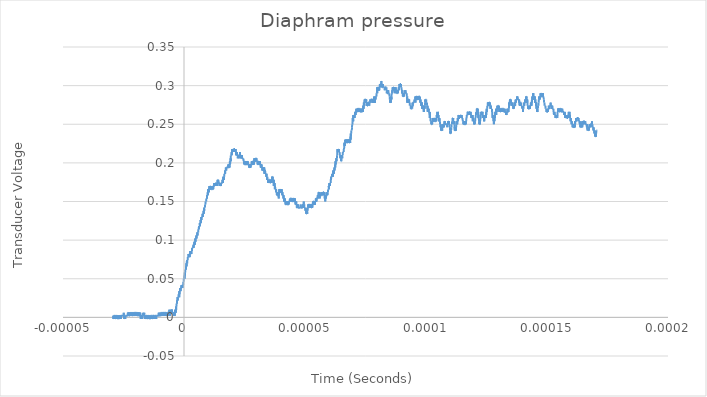
| Category | Series 0 |
|---|---|
| -2.92e-05 | 0.002 |
| -2.9168e-05 | -0.002 |
| -2.9136e-05 | -0.002 |
| -2.9104e-05 | 0.002 |
| -2.9072e-05 | 0.002 |
| -2.904e-05 | 0.002 |
| -2.9008e-05 | -0.002 |
| -2.8976e-05 | 0.002 |
| -2.8944e-05 | 0.002 |
| -2.8912e-05 | 0.002 |
| -2.888e-05 | 0.002 |
| -2.8848e-05 | 0.002 |
| -2.8816e-05 | 0.002 |
| -2.8784e-05 | -0.002 |
| -2.8752e-05 | 0.002 |
| -2.872e-05 | 0.002 |
| -2.8688e-05 | -0.002 |
| -2.8656e-05 | 0.002 |
| -2.8624e-05 | 0.002 |
| -2.8592e-05 | 0.002 |
| -2.856e-05 | 0.002 |
| -2.8528e-05 | -0.002 |
| -2.8496e-05 | 0.002 |
| -2.8464e-05 | -0.002 |
| -2.8432e-05 | 0.002 |
| -2.84e-05 | 0.002 |
| -2.8368e-05 | 0.002 |
| -2.8336e-05 | 0.002 |
| -2.8304e-05 | 0.002 |
| -2.8272e-05 | -0.002 |
| -2.824e-05 | -0.002 |
| -2.8208e-05 | -0.002 |
| -2.8176e-05 | 0.002 |
| -2.8144e-05 | 0.002 |
| -2.8112e-05 | 0.002 |
| -2.808e-05 | 0.002 |
| -2.8048e-05 | 0.002 |
| -2.8016e-05 | 0.002 |
| -2.7984e-05 | 0.002 |
| -2.7952e-05 | -0.002 |
| -2.792e-05 | 0.002 |
| -2.7888e-05 | 0.002 |
| -2.7856e-05 | -0.002 |
| -2.7824e-05 | 0.002 |
| -2.7792e-05 | -0.002 |
| -2.776e-05 | 0.002 |
| -2.7728e-05 | 0.002 |
| -2.7696e-05 | 0.002 |
| -2.7664e-05 | -0.002 |
| -2.7632e-05 | -0.002 |
| -2.76e-05 | -0.002 |
| -2.7568e-05 | 0.002 |
| -2.7536e-05 | -0.002 |
| -2.7504e-05 | -0.002 |
| -2.7472e-05 | -0.002 |
| -2.744e-05 | 0.002 |
| -2.7408e-05 | -0.002 |
| -2.7376e-05 | 0.002 |
| -2.7344e-05 | 0.002 |
| -2.7312e-05 | 0.002 |
| -2.728e-05 | -0.002 |
| -2.7248e-05 | 0.002 |
| -2.7216e-05 | -0.002 |
| -2.7184e-05 | -0.002 |
| -2.7152e-05 | -0.002 |
| -2.712e-05 | -0.002 |
| -2.7088e-05 | -0.002 |
| -2.7056e-05 | -0.002 |
| -2.7024e-05 | 0.002 |
| -2.6992e-05 | -0.002 |
| -2.696e-05 | 0.002 |
| -2.6928e-05 | -0.002 |
| -2.6896e-05 | 0.002 |
| -2.6864e-05 | -0.002 |
| -2.6832e-05 | 0.002 |
| -2.68e-05 | 0.002 |
| -2.6768e-05 | 0.002 |
| -2.6736e-05 | 0.002 |
| -2.6704e-05 | -0.002 |
| -2.6672e-05 | -0.002 |
| -2.664e-05 | 0.002 |
| -2.6608e-05 | -0.002 |
| -2.6576e-05 | 0.002 |
| -2.6544e-05 | -0.002 |
| -2.6512e-05 | -0.002 |
| -2.648e-05 | 0.002 |
| -2.6448e-05 | -0.002 |
| -2.6416e-05 | 0.002 |
| -2.6384e-05 | 0.002 |
| -2.6352e-05 | -0.002 |
| -2.632e-05 | 0.002 |
| -2.6288e-05 | 0.002 |
| -2.6256e-05 | -0.002 |
| -2.6224e-05 | 0.002 |
| -2.6192e-05 | -0.002 |
| -2.616e-05 | 0.002 |
| -2.6128e-05 | -0.002 |
| -2.6096e-05 | 0.002 |
| -2.6064e-05 | 0.002 |
| -2.6032e-05 | 0.002 |
| -2.6e-05 | 0.002 |
| -2.5968e-05 | 0.002 |
| -2.5936e-05 | 0.002 |
| -2.5904e-05 | 0.002 |
| -2.5872e-05 | 0.002 |
| -2.584e-05 | 0.002 |
| -2.5808e-05 | 0.002 |
| -2.5776e-05 | 0.002 |
| -2.5744e-05 | 0.002 |
| -2.5712e-05 | 0.002 |
| -2.568e-05 | 0.002 |
| -2.5648e-05 | 0.002 |
| -2.5616e-05 | 0.002 |
| -2.5584e-05 | 0.002 |
| -2.5552e-05 | 0.002 |
| -2.552e-05 | 0.002 |
| -2.5488e-05 | 0.002 |
| -2.5456e-05 | 0.002 |
| -2.5424e-05 | 0.002 |
| -2.5392e-05 | 0.002 |
| -2.536e-05 | 0.002 |
| -2.5328e-05 | 0.002 |
| -2.5296e-05 | 0.002 |
| -2.5264e-05 | 0.002 |
| -2.5232e-05 | 0.002 |
| -2.52e-05 | 0.002 |
| -2.5168e-05 | 0.002 |
| -2.5136e-05 | 0.002 |
| -2.5104e-05 | 0.002 |
| -2.5072e-05 | 0.002 |
| -2.504e-05 | 0.002 |
| -2.5008e-05 | 0.002 |
| -2.4976e-05 | 0.002 |
| -2.4944e-05 | 0.002 |
| -2.4912e-05 | 0.002 |
| -2.488e-05 | 0.006 |
| -2.4848e-05 | 0.002 |
| -2.4816e-05 | 0.002 |
| -2.4784e-05 | 0.002 |
| -2.4752e-05 | 0.002 |
| -2.472e-05 | 0.002 |
| -2.4688e-05 | -0.002 |
| -2.4656e-05 | 0.002 |
| -2.4624e-05 | 0.002 |
| -2.4592e-05 | 0.002 |
| -2.456e-05 | 0.002 |
| -2.4528e-05 | 0.002 |
| -2.4496e-05 | -0.002 |
| -2.4464e-05 | -0.002 |
| -2.4432e-05 | 0.002 |
| -2.44e-05 | 0.002 |
| -2.4368e-05 | 0.002 |
| -2.4336e-05 | 0.002 |
| -2.4304e-05 | 0.002 |
| -2.4272e-05 | -0.002 |
| -2.424e-05 | 0.002 |
| -2.4208e-05 | 0.002 |
| -2.4176e-05 | 0.002 |
| -2.4144e-05 | 0.002 |
| -2.4112e-05 | 0.002 |
| -2.408e-05 | 0.002 |
| -2.4048e-05 | 0.002 |
| -2.4016e-05 | 0.002 |
| -2.3984e-05 | 0.002 |
| -2.3952e-05 | 0.002 |
| -2.392e-05 | 0.002 |
| -2.3888e-05 | 0.002 |
| -2.3856e-05 | 0.002 |
| -2.3824e-05 | 0.002 |
| -2.3792e-05 | 0.002 |
| -2.376e-05 | 0.002 |
| -2.3728e-05 | 0.002 |
| -2.3696e-05 | 0.002 |
| -2.3664e-05 | 0.002 |
| -2.3632e-05 | 0.002 |
| -2.36e-05 | 0.002 |
| -2.3568e-05 | 0.002 |
| -2.3536e-05 | 0.002 |
| -2.3504e-05 | 0.002 |
| -2.3472e-05 | 0.002 |
| -2.344e-05 | 0.002 |
| -2.3408e-05 | 0.002 |
| -2.3376e-05 | 0.002 |
| -2.3344e-05 | 0.002 |
| -2.3312e-05 | 0.002 |
| -2.328e-05 | 0.002 |
| -2.3248e-05 | 0.002 |
| -2.3216e-05 | 0.006 |
| -2.3184e-05 | 0.006 |
| -2.3152e-05 | 0.006 |
| -2.312e-05 | 0.002 |
| -2.3088e-05 | 0.002 |
| -2.3056e-05 | 0.002 |
| -2.3024e-05 | 0.006 |
| -2.2992e-05 | 0.002 |
| -2.296e-05 | 0.002 |
| -2.2928e-05 | 0.006 |
| -2.2896e-05 | 0.002 |
| -2.2864e-05 | 0.006 |
| -2.2832e-05 | 0.002 |
| -2.28e-05 | 0.002 |
| -2.2768e-05 | 0.006 |
| -2.2736e-05 | 0.006 |
| -2.2704e-05 | 0.002 |
| -2.2672e-05 | 0.002 |
| -2.264e-05 | 0.006 |
| -2.2608e-05 | 0.002 |
| -2.2576e-05 | 0.002 |
| -2.2544e-05 | 0.002 |
| -2.2512e-05 | 0.002 |
| -2.248e-05 | 0.002 |
| -2.2448e-05 | 0.002 |
| -2.2416e-05 | 0.002 |
| -2.2384e-05 | 0.006 |
| -2.2352e-05 | 0.002 |
| -2.232e-05 | 0.002 |
| -2.2288e-05 | 0.006 |
| -2.2256e-05 | 0.002 |
| -2.2224e-05 | 0.002 |
| -2.2192e-05 | 0.002 |
| -2.216e-05 | 0.002 |
| -2.2128e-05 | 0.006 |
| -2.2096e-05 | 0.006 |
| -2.2064e-05 | 0.002 |
| -2.2032e-05 | 0.006 |
| -2.2e-05 | 0.002 |
| -2.1968e-05 | 0.006 |
| -2.1936e-05 | 0.006 |
| -2.1904e-05 | 0.006 |
| -2.1872e-05 | 0.006 |
| -2.184e-05 | 0.002 |
| -2.1808e-05 | 0.006 |
| -2.1776e-05 | 0.002 |
| -2.1744e-05 | 0.006 |
| -2.1712e-05 | 0.002 |
| -2.168e-05 | 0.002 |
| -2.1648e-05 | 0.006 |
| -2.1616e-05 | 0.006 |
| -2.1584e-05 | 0.002 |
| -2.1552e-05 | 0.006 |
| -2.152e-05 | 0.006 |
| -2.1488e-05 | 0.006 |
| -2.1456e-05 | 0.006 |
| -2.1424e-05 | 0.002 |
| -2.1392e-05 | 0.002 |
| -2.136e-05 | 0.002 |
| -2.1328e-05 | 0.006 |
| -2.1296e-05 | 0.006 |
| -2.1264e-05 | 0.002 |
| -2.1232e-05 | 0.002 |
| -2.12e-05 | 0.002 |
| -2.1168e-05 | 0.006 |
| -2.1136e-05 | 0.006 |
| -2.1104e-05 | 0.002 |
| -2.1072e-05 | 0.002 |
| -2.104e-05 | 0.006 |
| -2.1008e-05 | 0.002 |
| -2.0976e-05 | 0.006 |
| -2.0944e-05 | 0.002 |
| -2.0912e-05 | 0.006 |
| -2.088e-05 | 0.006 |
| -2.0848e-05 | 0.006 |
| -2.0816e-05 | 0.002 |
| -2.0784e-05 | 0.002 |
| -2.0752e-05 | 0.002 |
| -2.072e-05 | 0.002 |
| -2.0688e-05 | 0.006 |
| -2.0656e-05 | 0.002 |
| -2.0624e-05 | 0.002 |
| -2.0592e-05 | 0.006 |
| -2.056e-05 | 0.006 |
| -2.0528e-05 | 0.006 |
| -2.0496e-05 | 0.002 |
| -2.0464e-05 | 0.006 |
| -2.0432e-05 | 0.002 |
| -2.04e-05 | 0.006 |
| -2.0368e-05 | 0.006 |
| -2.0336e-05 | 0.006 |
| -2.0304e-05 | 0.006 |
| -2.0272e-05 | 0.006 |
| -2.024e-05 | 0.002 |
| -2.0208e-05 | 0.006 |
| -2.0176e-05 | 0.002 |
| -2.0144e-05 | 0.006 |
| -2.0112e-05 | 0.006 |
| -2.008e-05 | 0.006 |
| -2.0048e-05 | 0.006 |
| -2.0016e-05 | 0.002 |
| -1.9984e-05 | 0.006 |
| -1.9952e-05 | 0.006 |
| -1.992e-05 | 0.006 |
| -1.9888e-05 | 0.006 |
| -1.9856e-05 | 0.006 |
| -1.9824e-05 | 0.006 |
| -1.9792e-05 | 0.002 |
| -1.976e-05 | 0.006 |
| -1.9728e-05 | 0.006 |
| -1.9696e-05 | 0.006 |
| -1.9664e-05 | 0.002 |
| -1.9632e-05 | 0.006 |
| -1.96e-05 | 0.006 |
| -1.9568e-05 | 0.002 |
| -1.9536e-05 | 0.006 |
| -1.9504e-05 | 0.006 |
| -1.9472e-05 | 0.006 |
| -1.944e-05 | 0.002 |
| -1.9408e-05 | 0.002 |
| -1.9376e-05 | 0.002 |
| -1.9344e-05 | 0.002 |
| -1.9312e-05 | 0.006 |
| -1.928e-05 | 0.002 |
| -1.9248e-05 | 0.006 |
| -1.9216e-05 | 0.006 |
| -1.9184e-05 | 0.006 |
| -1.9152e-05 | 0.002 |
| -1.912e-05 | 0.002 |
| -1.9088e-05 | 0.002 |
| -1.9056e-05 | 0.006 |
| -1.9024e-05 | 0.002 |
| -1.8992e-05 | 0.002 |
| -1.896e-05 | 0.002 |
| -1.8928e-05 | 0.006 |
| -1.8896e-05 | 0.002 |
| -1.8864e-05 | 0.006 |
| -1.8832e-05 | 0.002 |
| -1.88e-05 | 0.002 |
| -1.8768e-05 | 0.002 |
| -1.8736e-05 | 0.002 |
| -1.8704e-05 | 0.002 |
| -1.8672e-05 | 0.006 |
| -1.864e-05 | 0.002 |
| -1.8608e-05 | 0.002 |
| -1.8576e-05 | 0.002 |
| -1.8544e-05 | 0.002 |
| -1.8512e-05 | 0.006 |
| -1.848e-05 | 0.002 |
| -1.8448e-05 | 0.002 |
| -1.8416e-05 | 0.002 |
| -1.8384e-05 | 0.002 |
| -1.8352e-05 | 0.006 |
| -1.832e-05 | 0.002 |
| -1.8288e-05 | 0.002 |
| -1.8256e-05 | 0.006 |
| -1.8224e-05 | 0.002 |
| -1.8192e-05 | 0.002 |
| -1.816e-05 | 0.002 |
| -1.8128e-05 | 0.002 |
| -1.8096e-05 | 0.002 |
| -1.8064e-05 | 0.006 |
| -1.8032e-05 | 0.002 |
| -1.8e-05 | 0.002 |
| -1.7968e-05 | 0.002 |
| -1.7936e-05 | 0.002 |
| -1.7904e-05 | -0.002 |
| -1.7872e-05 | 0.002 |
| -1.784e-05 | 0.002 |
| -1.7808e-05 | 0.002 |
| -1.7776e-05 | 0.002 |
| -1.7744e-05 | 0.002 |
| -1.7712e-05 | 0.002 |
| -1.768e-05 | 0.002 |
| -1.7648e-05 | 0.002 |
| -1.7616e-05 | 0.002 |
| -1.7584e-05 | 0.002 |
| -1.7552e-05 | 0.002 |
| -1.752e-05 | 0.002 |
| -1.7488e-05 | 0.002 |
| -1.7456e-05 | 0.002 |
| -1.7424e-05 | 0.002 |
| -1.7392e-05 | 0.002 |
| -1.736e-05 | 0.002 |
| -1.7328e-05 | 0.002 |
| -1.7296e-05 | 0.002 |
| -1.7264e-05 | -0.002 |
| -1.7232e-05 | 0.002 |
| -1.72e-05 | 0.002 |
| -1.7168e-05 | 0.002 |
| -1.7136e-05 | 0.002 |
| -1.7104e-05 | 0.002 |
| -1.7072e-05 | 0.002 |
| -1.704e-05 | 0.002 |
| -1.7008e-05 | 0.002 |
| -1.6976e-05 | 0.002 |
| -1.6944e-05 | 0.002 |
| -1.6912e-05 | 0.002 |
| -1.688e-05 | 0.006 |
| -1.6848e-05 | 0.002 |
| -1.6816e-05 | 0.002 |
| -1.6784e-05 | 0.002 |
| -1.6752e-05 | 0.002 |
| -1.672e-05 | 0.002 |
| -1.6688e-05 | 0.002 |
| -1.6656e-05 | 0.002 |
| -1.6624e-05 | 0.002 |
| -1.6592e-05 | 0.002 |
| -1.656e-05 | 0.002 |
| -1.6528e-05 | 0.002 |
| -1.6496e-05 | 0.002 |
| -1.6464e-05 | 0.006 |
| -1.6432e-05 | 0.002 |
| -1.64e-05 | 0.002 |
| -1.6368e-05 | 0.002 |
| -1.6336e-05 | 0.002 |
| -1.6304e-05 | 0.002 |
| -1.6272e-05 | 0.002 |
| -1.624e-05 | 0.002 |
| -1.6208e-05 | 0.002 |
| -1.6176e-05 | 0.002 |
| -1.6144e-05 | -0.002 |
| -1.6112e-05 | 0.002 |
| -1.608e-05 | 0.002 |
| -1.6048e-05 | 0.002 |
| -1.6016e-05 | 0.002 |
| -1.5984e-05 | -0.002 |
| -1.5952e-05 | -0.002 |
| -1.592e-05 | 0.002 |
| -1.5888e-05 | 0.002 |
| -1.5856e-05 | -0.002 |
| -1.5824e-05 | 0.002 |
| -1.5792e-05 | 0.002 |
| -1.576e-05 | 0.002 |
| -1.5728e-05 | -0.002 |
| -1.5696e-05 | 0.002 |
| -1.5664e-05 | 0.002 |
| -1.5632e-05 | 0.002 |
| -1.56e-05 | 0.002 |
| -1.5568e-05 | -0.002 |
| -1.5536e-05 | 0.002 |
| -1.5504e-05 | 0.002 |
| -1.5472e-05 | 0.002 |
| -1.544e-05 | 0.002 |
| -1.5408e-05 | 0.002 |
| -1.5376e-05 | 0.002 |
| -1.5344e-05 | -0.002 |
| -1.5312e-05 | -0.002 |
| -1.528e-05 | 0.002 |
| -1.5248e-05 | 0.002 |
| -1.5216e-05 | -0.002 |
| -1.5184e-05 | 0.002 |
| -1.5152e-05 | -0.002 |
| -1.512e-05 | -0.002 |
| -1.5088e-05 | 0.002 |
| -1.5056e-05 | 0.002 |
| -1.5024e-05 | -0.002 |
| -1.4992e-05 | -0.002 |
| -1.496e-05 | -0.002 |
| -1.4928e-05 | 0.002 |
| -1.4896e-05 | 0.002 |
| -1.4864e-05 | -0.002 |
| -1.4832e-05 | 0.002 |
| -1.48e-05 | -0.002 |
| -1.4768e-05 | 0.002 |
| -1.4736e-05 | 0.002 |
| -1.4704e-05 | -0.002 |
| -1.4672e-05 | -0.002 |
| -1.464e-05 | 0.002 |
| -1.4608e-05 | 0.002 |
| -1.4576e-05 | -0.002 |
| -1.4544e-05 | 0.002 |
| -1.4512e-05 | 0.002 |
| -1.448e-05 | 0.002 |
| -1.4448e-05 | -0.002 |
| -1.4416e-05 | -0.002 |
| -1.4384e-05 | -0.002 |
| -1.4352e-05 | 0.002 |
| -1.432e-05 | -0.002 |
| -1.4288e-05 | -0.002 |
| -1.4256e-05 | -0.002 |
| -1.4224e-05 | 0.002 |
| -1.4192e-05 | -0.002 |
| -1.416e-05 | 0.002 |
| -1.4128e-05 | 0.002 |
| -1.4096e-05 | -0.002 |
| -1.4064e-05 | -0.002 |
| -1.4032e-05 | 0.002 |
| -1.4e-05 | -0.002 |
| -1.3968e-05 | -0.002 |
| -1.3936e-05 | -0.002 |
| -1.3904e-05 | -0.002 |
| -1.3872e-05 | -0.002 |
| -1.384e-05 | -0.002 |
| -1.3808e-05 | 0.002 |
| -1.3776e-05 | -0.002 |
| -1.3744e-05 | 0.002 |
| -1.3712e-05 | 0.002 |
| -1.368e-05 | 0.002 |
| -1.3648e-05 | 0.002 |
| -1.3616e-05 | 0.002 |
| -1.3584e-05 | 0.002 |
| -1.3552e-05 | 0.002 |
| -1.352e-05 | -0.002 |
| -1.3488e-05 | 0.002 |
| -1.3456e-05 | 0.002 |
| -1.3424e-05 | 0.002 |
| -1.3392e-05 | 0.002 |
| -1.336e-05 | 0.002 |
| -1.3328e-05 | 0.002 |
| -1.3296e-05 | 0.002 |
| -1.3264e-05 | 0.002 |
| -1.3232e-05 | 0.002 |
| -1.32e-05 | 0.002 |
| -1.3168e-05 | 0.002 |
| -1.3136e-05 | -0.002 |
| -1.3104e-05 | 0.002 |
| -1.3072e-05 | -0.002 |
| -1.304e-05 | -0.002 |
| -1.3008e-05 | 0.002 |
| -1.2976e-05 | 0.002 |
| -1.2944e-05 | 0.002 |
| -1.2912e-05 | 0.002 |
| -1.288e-05 | -0.002 |
| -1.2848e-05 | -0.002 |
| -1.2816e-05 | 0.002 |
| -1.2784e-05 | 0.002 |
| -1.2752e-05 | 0.002 |
| -1.272e-05 | 0.002 |
| -1.2688e-05 | 0.002 |
| -1.2656e-05 | 0.002 |
| -1.2624e-05 | 0.002 |
| -1.2592e-05 | 0.002 |
| -1.256e-05 | 0.002 |
| -1.2528e-05 | 0.002 |
| -1.2496e-05 | 0.002 |
| -1.2464e-05 | 0.002 |
| -1.2432e-05 | 0.002 |
| -1.24e-05 | 0.002 |
| -1.2368e-05 | 0.002 |
| -1.2336e-05 | 0.002 |
| -1.2304e-05 | 0.002 |
| -1.2272e-05 | -0.002 |
| -1.224e-05 | 0.002 |
| -1.2208e-05 | -0.002 |
| -1.2176e-05 | 0.002 |
| -1.2144e-05 | 0.002 |
| -1.2112e-05 | 0.002 |
| -1.208e-05 | -0.002 |
| -1.2048e-05 | 0.002 |
| -1.2016e-05 | 0.002 |
| -1.1984e-05 | -0.002 |
| -1.1952e-05 | 0.002 |
| -1.192e-05 | 0.002 |
| -1.1888e-05 | 0.002 |
| -1.1856e-05 | 0.002 |
| -1.1824e-05 | 0.002 |
| -1.1792e-05 | 0.002 |
| -1.176e-05 | 0.002 |
| -1.1728e-05 | 0.002 |
| -1.1696e-05 | 0.002 |
| -1.1664e-05 | 0.002 |
| -1.1632e-05 | 0.002 |
| -1.16e-05 | 0.002 |
| -1.1568e-05 | -0.002 |
| -1.1536e-05 | 0.002 |
| -1.1504e-05 | -0.002 |
| -1.1472e-05 | 0.002 |
| -1.144e-05 | 0.002 |
| -1.1408e-05 | 0.002 |
| -1.1376e-05 | 0.002 |
| -1.1344e-05 | 0.002 |
| -1.1312e-05 | 0.002 |
| -1.128e-05 | 0.002 |
| -1.1248e-05 | 0.002 |
| -1.1216e-05 | 0.002 |
| -1.1184e-05 | 0.002 |
| -1.1152e-05 | 0.002 |
| -1.112e-05 | 0.002 |
| -1.1088e-05 | 0.002 |
| -1.1056e-05 | 0.002 |
| -1.1024e-05 | 0.002 |
| -1.0992e-05 | 0.002 |
| -1.096e-05 | 0.002 |
| -1.0928e-05 | 0.002 |
| -1.0896e-05 | 0.002 |
| -1.0864e-05 | 0.002 |
| -1.0832e-05 | 0.002 |
| -1.08e-05 | 0.002 |
| -1.0768e-05 | 0.002 |
| -1.0736e-05 | 0.002 |
| -1.0704e-05 | 0.002 |
| -1.0672e-05 | 0.002 |
| -1.064e-05 | 0.002 |
| -1.0608e-05 | 0.002 |
| -1.0576e-05 | 0.002 |
| -1.0544e-05 | 0.002 |
| -1.0512e-05 | 0.002 |
| -1.048e-05 | 0.002 |
| -1.0448e-05 | 0.006 |
| -1.0416e-05 | 0.002 |
| -1.0384e-05 | 0.002 |
| -1.0352e-05 | 0.002 |
| -1.032e-05 | 0.002 |
| -1.0288e-05 | 0.002 |
| -1.0256e-05 | 0.002 |
| -1.0224e-05 | 0.006 |
| -1.0192e-05 | 0.002 |
| -1.016e-05 | 0.002 |
| -1.0128e-05 | 0.002 |
| -1.0096e-05 | 0.002 |
| -1.0064e-05 | 0.002 |
| -1.0032e-05 | 0.002 |
| -1e-05 | 0.002 |
| -9.968e-06 | 0.002 |
| -9.936e-06 | 0.002 |
| -9.904e-06 | 0.002 |
| -9.872e-06 | 0.002 |
| -9.84e-06 | 0.002 |
| -9.808e-06 | 0.002 |
| -9.776e-06 | 0.002 |
| -9.744e-06 | 0.002 |
| -9.712e-06 | 0.006 |
| -9.68e-06 | 0.006 |
| -9.648e-06 | 0.002 |
| -9.616e-06 | 0.002 |
| -9.584e-06 | 0.006 |
| -9.552e-06 | 0.006 |
| -9.52e-06 | 0.006 |
| -9.488e-06 | 0.006 |
| -9.456e-06 | 0.006 |
| -9.424e-06 | 0.002 |
| -9.392e-06 | 0.006 |
| -9.36e-06 | 0.006 |
| -9.328e-06 | 0.002 |
| -9.296e-06 | 0.002 |
| -9.264e-06 | 0.002 |
| -9.232e-06 | 0.006 |
| -9.2e-06 | 0.006 |
| -9.168e-06 | 0.006 |
| -9.136e-06 | 0.006 |
| -9.104e-06 | 0.006 |
| -9.072e-06 | 0.002 |
| -9.04e-06 | 0.006 |
| -9.008e-06 | 0.006 |
| -8.976e-06 | 0.006 |
| -8.944e-06 | 0.002 |
| -8.912e-06 | 0.006 |
| -8.88e-06 | 0.006 |
| -8.848e-06 | 0.002 |
| -8.816e-06 | 0.006 |
| -8.784e-06 | 0.002 |
| -8.752e-06 | 0.006 |
| -8.72e-06 | 0.006 |
| -8.688e-06 | 0.006 |
| -8.656e-06 | 0.002 |
| -8.624e-06 | 0.006 |
| -8.592e-06 | 0.002 |
| -8.56e-06 | 0.006 |
| -8.528e-06 | 0.006 |
| -8.496e-06 | 0.002 |
| -8.464e-06 | 0.006 |
| -8.432e-06 | 0.006 |
| -8.4e-06 | 0.006 |
| -8.368e-06 | 0.006 |
| -8.336e-06 | 0.006 |
| -8.304e-06 | 0.006 |
| -8.272e-06 | 0.002 |
| -8.24e-06 | 0.006 |
| -8.208e-06 | 0.006 |
| -8.176e-06 | 0.002 |
| -8.144e-06 | 0.006 |
| -8.112e-06 | 0.006 |
| -8.08e-06 | 0.002 |
| -8.048e-06 | 0.006 |
| -8.016e-06 | 0.006 |
| -7.984e-06 | 0.006 |
| -7.952e-06 | 0.006 |
| -7.92e-06 | 0.002 |
| -7.888e-06 | 0.006 |
| -7.856e-06 | 0.006 |
| -7.824e-06 | 0.006 |
| -7.792e-06 | 0.006 |
| -7.76e-06 | 0.006 |
| -7.728e-06 | 0.006 |
| -7.696e-06 | 0.006 |
| -7.664e-06 | 0.002 |
| -7.632e-06 | 0.006 |
| -7.6e-06 | 0.006 |
| -7.568e-06 | 0.002 |
| -7.536e-06 | 0.006 |
| -7.504e-06 | 0.006 |
| -7.472e-06 | 0.006 |
| -7.44e-06 | 0.002 |
| -7.408e-06 | 0.006 |
| -7.376e-06 | 0.002 |
| -7.344e-06 | 0.006 |
| -7.312e-06 | 0.002 |
| -7.28e-06 | 0.002 |
| -7.248e-06 | 0.006 |
| -7.216e-06 | 0.006 |
| -7.184e-06 | 0.002 |
| -7.152e-06 | 0.006 |
| -7.12e-06 | 0.006 |
| -7.088e-06 | 0.002 |
| -7.056e-06 | 0.002 |
| -7.024e-06 | 0.006 |
| -6.992e-06 | 0.006 |
| -6.96e-06 | 0.006 |
| -6.928e-06 | 0.006 |
| -6.896e-06 | 0.002 |
| -6.864e-06 | 0.002 |
| -6.832e-06 | 0.006 |
| -6.8e-06 | 0.006 |
| -6.768e-06 | 0.002 |
| -6.736e-06 | 0.006 |
| -6.704e-06 | 0.006 |
| -6.672e-06 | 0.006 |
| -6.64e-06 | 0.006 |
| -6.608e-06 | 0.006 |
| -6.576e-06 | 0.002 |
| -6.544e-06 | 0.006 |
| -6.512e-06 | 0.006 |
| -6.48e-06 | 0.006 |
| -6.448e-06 | 0.006 |
| -6.416e-06 | 0.006 |
| -6.384e-06 | 0.006 |
| -6.352e-06 | 0.006 |
| -6.32e-06 | 0.006 |
| -6.288e-06 | 0.006 |
| -6.256e-06 | 0.006 |
| -6.224e-06 | 0.006 |
| -6.192e-06 | 0.006 |
| -6.16e-06 | 0.006 |
| -6.128e-06 | 0.006 |
| -6.096e-06 | 0.006 |
| -6.064e-06 | 0.01 |
| -6.032e-06 | 0.006 |
| -6e-06 | 0.006 |
| -5.968e-06 | 0.006 |
| -5.936e-06 | 0.002 |
| -5.904e-06 | 0.006 |
| -5.872e-06 | 0.006 |
| -5.84e-06 | 0.006 |
| -5.808e-06 | 0.002 |
| -5.776e-06 | 0.006 |
| -5.744e-06 | 0.006 |
| -5.712e-06 | 0.006 |
| -5.68e-06 | 0.006 |
| -5.648e-06 | 0.006 |
| -5.616e-06 | 0.006 |
| -5.584e-06 | 0.01 |
| -5.552e-06 | 0.01 |
| -5.52e-06 | 0.006 |
| -5.488e-06 | 0.006 |
| -5.456e-06 | 0.006 |
| -5.424e-06 | 0.006 |
| -5.392e-06 | 0.006 |
| -5.36e-06 | 0.006 |
| -5.328e-06 | 0.006 |
| -5.296e-06 | 0.006 |
| -5.264e-06 | 0.006 |
| -5.232e-06 | 0.006 |
| -5.2e-06 | 0.01 |
| -5.168e-06 | 0.006 |
| -5.136e-06 | 0.006 |
| -5.104e-06 | 0.006 |
| -5.072e-06 | 0.006 |
| -5.04e-06 | 0.006 |
| -5.008e-06 | 0.01 |
| -4.976e-06 | 0.006 |
| -4.944e-06 | 0.01 |
| -4.912e-06 | 0.006 |
| -4.88e-06 | 0.006 |
| -4.848e-06 | 0.006 |
| -4.816e-06 | 0.006 |
| -4.784e-06 | 0.006 |
| -4.752e-06 | 0.006 |
| -4.72e-06 | 0.006 |
| -4.688e-06 | 0.006 |
| -4.656e-06 | 0.006 |
| -4.624e-06 | 0.006 |
| -4.592e-06 | 0.006 |
| -4.56e-06 | 0.006 |
| -4.528e-06 | 0.006 |
| -4.496e-06 | 0.006 |
| -4.464e-06 | 0.006 |
| -4.432e-06 | 0.006 |
| -4.4e-06 | 0.006 |
| -4.368e-06 | 0.006 |
| -4.336e-06 | 0.006 |
| -4.304e-06 | 0.006 |
| -4.272e-06 | 0.002 |
| -4.24e-06 | 0.006 |
| -4.208e-06 | 0.006 |
| -4.176e-06 | 0.002 |
| -4.144e-06 | 0.006 |
| -4.112e-06 | 0.002 |
| -4.08e-06 | 0.006 |
| -4.048e-06 | 0.002 |
| -4.016e-06 | 0.006 |
| -3.984e-06 | 0.006 |
| -3.952e-06 | 0.002 |
| -3.92e-06 | 0.006 |
| -3.888e-06 | 0.002 |
| -3.856e-06 | 0.006 |
| -3.824e-06 | 0.006 |
| -3.792e-06 | 0.006 |
| -3.76e-06 | 0.006 |
| -3.728e-06 | 0.006 |
| -3.696e-06 | 0.006 |
| -3.664e-06 | 0.01 |
| -3.632e-06 | 0.006 |
| -3.6e-06 | 0.006 |
| -3.568e-06 | 0.006 |
| -3.536e-06 | 0.01 |
| -3.504e-06 | 0.01 |
| -3.472e-06 | 0.01 |
| -3.44e-06 | 0.01 |
| -3.408e-06 | 0.006 |
| -3.376e-06 | 0.01 |
| -3.344e-06 | 0.01 |
| -3.312e-06 | 0.014 |
| -3.28e-06 | 0.014 |
| -3.248e-06 | 0.01 |
| -3.216e-06 | 0.014 |
| -3.184e-06 | 0.014 |
| -3.152e-06 | 0.014 |
| -3.12e-06 | 0.014 |
| -3.088e-06 | 0.014 |
| -3.056e-06 | 0.018 |
| -3.024e-06 | 0.018 |
| -2.992e-06 | 0.018 |
| -2.96e-06 | 0.018 |
| -2.928e-06 | 0.018 |
| -2.896e-06 | 0.022 |
| -2.864e-06 | 0.018 |
| -2.832e-06 | 0.022 |
| -2.8e-06 | 0.022 |
| -2.768e-06 | 0.022 |
| -2.736e-06 | 0.022 |
| -2.704e-06 | 0.022 |
| -2.672e-06 | 0.026 |
| -2.64e-06 | 0.026 |
| -2.608e-06 | 0.022 |
| -2.576e-06 | 0.022 |
| -2.544e-06 | 0.026 |
| -2.512e-06 | 0.026 |
| -2.48e-06 | 0.026 |
| -2.448e-06 | 0.026 |
| -2.416e-06 | 0.026 |
| -2.384e-06 | 0.026 |
| -2.352e-06 | 0.026 |
| -2.32e-06 | 0.026 |
| -2.288e-06 | 0.026 |
| -2.256e-06 | 0.03 |
| -2.224e-06 | 0.03 |
| -2.192e-06 | 0.03 |
| -2.16e-06 | 0.03 |
| -2.128e-06 | 0.03 |
| -2.096e-06 | 0.03 |
| -2.064e-06 | 0.03 |
| -2.032e-06 | 0.03 |
| -2e-06 | 0.03 |
| -1.968e-06 | 0.026 |
| -1.936e-06 | 0.03 |
| -1.904e-06 | 0.034 |
| -1.872e-06 | 0.03 |
| -1.84e-06 | 0.034 |
| -1.808e-06 | 0.034 |
| -1.776e-06 | 0.034 |
| -1.744e-06 | 0.034 |
| -1.712e-06 | 0.034 |
| -1.68e-06 | 0.034 |
| -1.648e-06 | 0.034 |
| -1.616e-06 | 0.034 |
| -1.584e-06 | 0.034 |
| -1.552e-06 | 0.038 |
| -1.52e-06 | 0.034 |
| -1.488e-06 | 0.038 |
| -1.456e-06 | 0.038 |
| -1.424e-06 | 0.034 |
| -1.392e-06 | 0.038 |
| -1.36e-06 | 0.038 |
| -1.328e-06 | 0.038 |
| -1.296e-06 | 0.038 |
| -1.264e-06 | 0.038 |
| -1.232e-06 | 0.038 |
| -1.2e-06 | 0.038 |
| -1.168e-06 | 0.038 |
| -1.136e-06 | 0.038 |
| -1.104e-06 | 0.038 |
| -1.072e-06 | 0.042 |
| -1.04e-06 | 0.042 |
| -1.008e-06 | 0.042 |
| -9.76e-07 | 0.038 |
| -9.44e-07 | 0.038 |
| -9.12e-07 | 0.038 |
| -8.8e-07 | 0.038 |
| -8.48e-07 | 0.038 |
| -8.16e-07 | 0.038 |
| -7.84e-07 | 0.038 |
| -7.52e-07 | 0.042 |
| -7.2e-07 | 0.042 |
| -6.88e-07 | 0.038 |
| -6.56e-07 | 0.042 |
| -6.24e-07 | 0.038 |
| -5.92e-07 | 0.038 |
| -5.6e-07 | 0.042 |
| -5.28e-07 | 0.042 |
| -4.96e-07 | 0.042 |
| -4.64e-07 | 0.042 |
| -4.32e-07 | 0.042 |
| -4e-07 | 0.042 |
| -3.68e-07 | 0.042 |
| -3.36e-07 | 0.042 |
| -3.04e-07 | 0.042 |
| -2.72e-07 | 0.046 |
| -2.4e-07 | 0.046 |
| -2.08e-07 | 0.046 |
| -1.76e-07 | 0.046 |
| -1.44e-07 | 0.046 |
| -1.12e-07 | 0.046 |
| -8e-08 | 0.05 |
| -4.8e-08 | 0.05 |
| -1.6e-08 | 0.05 |
| 1.6e-08 | 0.05 |
| 4.8e-08 | 0.05 |
| 8e-08 | 0.05 |
| 1.12e-07 | 0.05 |
| 1.44e-07 | 0.05 |
| 1.76e-07 | 0.054 |
| 2.08e-07 | 0.054 |
| 2.4e-07 | 0.05 |
| 2.72e-07 | 0.058 |
| 3.04e-07 | 0.054 |
| 3.36e-07 | 0.054 |
| 3.68e-07 | 0.054 |
| 4e-07 | 0.058 |
| 4.32e-07 | 0.058 |
| 4.64e-07 | 0.058 |
| 4.96e-07 | 0.058 |
| 5.28e-07 | 0.058 |
| 5.6e-07 | 0.062 |
| 5.92e-07 | 0.062 |
| 6.24e-07 | 0.062 |
| 6.56e-07 | 0.062 |
| 6.88e-07 | 0.062 |
| 7.2e-07 | 0.062 |
| 7.52e-07 | 0.062 |
| 7.84e-07 | 0.062 |
| 8.16e-07 | 0.066 |
| 8.48e-07 | 0.062 |
| 8.8e-07 | 0.066 |
| 9.12e-07 | 0.066 |
| 9.44e-07 | 0.066 |
| 9.76e-07 | 0.066 |
| 1.008e-06 | 0.07 |
| 1.04e-06 | 0.066 |
| 1.072e-06 | 0.07 |
| 1.104e-06 | 0.07 |
| 1.136e-06 | 0.07 |
| 1.168e-06 | 0.07 |
| 1.2e-06 | 0.074 |
| 1.232e-06 | 0.074 |
| 1.264e-06 | 0.074 |
| 1.296e-06 | 0.07 |
| 1.328e-06 | 0.074 |
| 1.36e-06 | 0.074 |
| 1.392e-06 | 0.074 |
| 1.424e-06 | 0.074 |
| 1.456e-06 | 0.074 |
| 1.488e-06 | 0.074 |
| 1.52e-06 | 0.074 |
| 1.552e-06 | 0.074 |
| 1.584e-06 | 0.078 |
| 1.616e-06 | 0.078 |
| 1.648e-06 | 0.078 |
| 1.68e-06 | 0.078 |
| 1.712e-06 | 0.078 |
| 1.744e-06 | 0.078 |
| 1.776e-06 | 0.078 |
| 1.808e-06 | 0.078 |
| 1.84e-06 | 0.078 |
| 1.872e-06 | 0.078 |
| 1.904e-06 | 0.082 |
| 1.936e-06 | 0.078 |
| 1.968e-06 | 0.078 |
| 2e-06 | 0.082 |
| 2.032e-06 | 0.082 |
| 2.064e-06 | 0.082 |
| 2.096e-06 | 0.078 |
| 2.128e-06 | 0.082 |
| 2.16e-06 | 0.082 |
| 2.192e-06 | 0.082 |
| 2.224e-06 | 0.082 |
| 2.256e-06 | 0.082 |
| 2.288e-06 | 0.082 |
| 2.32e-06 | 0.082 |
| 2.352e-06 | 0.082 |
| 2.384e-06 | 0.078 |
| 2.416e-06 | 0.082 |
| 2.448e-06 | 0.082 |
| 2.48e-06 | 0.082 |
| 2.512e-06 | 0.082 |
| 2.544e-06 | 0.082 |
| 2.576e-06 | 0.082 |
| 2.608e-06 | 0.082 |
| 2.64e-06 | 0.086 |
| 2.672e-06 | 0.082 |
| 2.704e-06 | 0.082 |
| 2.736e-06 | 0.086 |
| 2.768e-06 | 0.082 |
| 2.8e-06 | 0.082 |
| 2.832e-06 | 0.082 |
| 2.864e-06 | 0.082 |
| 2.896e-06 | 0.086 |
| 2.928e-06 | 0.086 |
| 2.96e-06 | 0.086 |
| 2.992e-06 | 0.082 |
| 3.024e-06 | 0.082 |
| 3.056e-06 | 0.082 |
| 3.088e-06 | 0.086 |
| 3.12e-06 | 0.086 |
| 3.152e-06 | 0.086 |
| 3.184e-06 | 0.086 |
| 3.216e-06 | 0.086 |
| 3.248e-06 | 0.086 |
| 3.28e-06 | 0.086 |
| 3.312e-06 | 0.086 |
| 3.344e-06 | 0.09 |
| 3.376e-06 | 0.09 |
| 3.408e-06 | 0.09 |
| 3.44e-06 | 0.09 |
| 3.472e-06 | 0.09 |
| 3.504e-06 | 0.09 |
| 3.536e-06 | 0.09 |
| 3.568e-06 | 0.09 |
| 3.6e-06 | 0.09 |
| 3.632e-06 | 0.09 |
| 3.664e-06 | 0.09 |
| 3.696e-06 | 0.09 |
| 3.728e-06 | 0.09 |
| 3.76e-06 | 0.09 |
| 3.792e-06 | 0.09 |
| 3.824e-06 | 0.09 |
| 3.856e-06 | 0.09 |
| 3.888e-06 | 0.094 |
| 3.92e-06 | 0.094 |
| 3.952e-06 | 0.094 |
| 3.984e-06 | 0.09 |
| 4.016e-06 | 0.09 |
| 4.048e-06 | 0.094 |
| 4.08e-06 | 0.094 |
| 4.112e-06 | 0.094 |
| 4.144e-06 | 0.094 |
| 4.176e-06 | 0.094 |
| 4.208e-06 | 0.094 |
| 4.24e-06 | 0.094 |
| 4.272e-06 | 0.094 |
| 4.304e-06 | 0.098 |
| 4.336e-06 | 0.098 |
| 4.368e-06 | 0.094 |
| 4.4e-06 | 0.098 |
| 4.432e-06 | 0.094 |
| 4.464e-06 | 0.098 |
| 4.496e-06 | 0.098 |
| 4.528e-06 | 0.098 |
| 4.56e-06 | 0.098 |
| 4.592e-06 | 0.098 |
| 4.624e-06 | 0.098 |
| 4.656e-06 | 0.102 |
| 4.688e-06 | 0.102 |
| 4.72e-06 | 0.098 |
| 4.752e-06 | 0.102 |
| 4.784e-06 | 0.102 |
| 4.816e-06 | 0.102 |
| 4.848e-06 | 0.102 |
| 4.88e-06 | 0.102 |
| 4.912e-06 | 0.102 |
| 4.944e-06 | 0.102 |
| 4.976e-06 | 0.102 |
| 5.008e-06 | 0.102 |
| 5.04e-06 | 0.102 |
| 5.072e-06 | 0.102 |
| 5.104e-06 | 0.106 |
| 5.136e-06 | 0.106 |
| 5.168e-06 | 0.102 |
| 5.2e-06 | 0.106 |
| 5.232e-06 | 0.106 |
| 5.264e-06 | 0.106 |
| 5.296e-06 | 0.106 |
| 5.328e-06 | 0.106 |
| 5.36e-06 | 0.106 |
| 5.392e-06 | 0.106 |
| 5.424e-06 | 0.106 |
| 5.456e-06 | 0.106 |
| 5.488e-06 | 0.106 |
| 5.52e-06 | 0.11 |
| 5.552e-06 | 0.106 |
| 5.584e-06 | 0.11 |
| 5.616e-06 | 0.11 |
| 5.648e-06 | 0.11 |
| 5.68e-06 | 0.11 |
| 5.712e-06 | 0.11 |
| 5.744e-06 | 0.11 |
| 5.776e-06 | 0.11 |
| 5.808e-06 | 0.11 |
| 5.84e-06 | 0.11 |
| 5.872e-06 | 0.11 |
| 5.904e-06 | 0.114 |
| 5.936e-06 | 0.114 |
| 5.968e-06 | 0.114 |
| 6e-06 | 0.114 |
| 6.032e-06 | 0.114 |
| 6.064e-06 | 0.114 |
| 6.096e-06 | 0.114 |
| 6.128e-06 | 0.114 |
| 6.16e-06 | 0.118 |
| 6.192e-06 | 0.114 |
| 6.224e-06 | 0.118 |
| 6.256e-06 | 0.118 |
| 6.288e-06 | 0.118 |
| 6.32e-06 | 0.118 |
| 6.352e-06 | 0.118 |
| 6.384e-06 | 0.118 |
| 6.416e-06 | 0.118 |
| 6.448e-06 | 0.118 |
| 6.48e-06 | 0.118 |
| 6.512e-06 | 0.118 |
| 6.544e-06 | 0.122 |
| 6.576e-06 | 0.118 |
| 6.608e-06 | 0.122 |
| 6.64e-06 | 0.122 |
| 6.672e-06 | 0.122 |
| 6.704e-06 | 0.122 |
| 6.736e-06 | 0.122 |
| 6.768e-06 | 0.122 |
| 6.8e-06 | 0.122 |
| 6.832e-06 | 0.122 |
| 6.864e-06 | 0.126 |
| 6.896e-06 | 0.122 |
| 6.928e-06 | 0.122 |
| 6.96e-06 | 0.122 |
| 6.992e-06 | 0.126 |
| 7.024e-06 | 0.126 |
| 7.056e-06 | 0.126 |
| 7.088e-06 | 0.126 |
| 7.12e-06 | 0.126 |
| 7.152e-06 | 0.13 |
| 7.184e-06 | 0.126 |
| 7.216e-06 | 0.126 |
| 7.248e-06 | 0.126 |
| 7.28e-06 | 0.13 |
| 7.312e-06 | 0.13 |
| 7.344e-06 | 0.13 |
| 7.376e-06 | 0.13 |
| 7.408e-06 | 0.13 |
| 7.44e-06 | 0.13 |
| 7.472e-06 | 0.13 |
| 7.504e-06 | 0.13 |
| 7.536e-06 | 0.13 |
| 7.568e-06 | 0.13 |
| 7.6e-06 | 0.13 |
| 7.632e-06 | 0.13 |
| 7.664e-06 | 0.13 |
| 7.696e-06 | 0.134 |
| 7.728e-06 | 0.134 |
| 7.76e-06 | 0.13 |
| 7.792e-06 | 0.134 |
| 7.824e-06 | 0.134 |
| 7.856e-06 | 0.134 |
| 7.888e-06 | 0.134 |
| 7.92e-06 | 0.134 |
| 7.952e-06 | 0.134 |
| 7.984e-06 | 0.134 |
| 8.016e-06 | 0.134 |
| 8.048e-06 | 0.134 |
| 8.08e-06 | 0.134 |
| 8.112e-06 | 0.138 |
| 8.144e-06 | 0.134 |
| 8.176e-06 | 0.138 |
| 8.208e-06 | 0.138 |
| 8.24e-06 | 0.138 |
| 8.272e-06 | 0.138 |
| 8.304e-06 | 0.142 |
| 8.336e-06 | 0.138 |
| 8.368e-06 | 0.138 |
| 8.4e-06 | 0.142 |
| 8.432e-06 | 0.142 |
| 8.464e-06 | 0.142 |
| 8.496e-06 | 0.142 |
| 8.528e-06 | 0.142 |
| 8.56e-06 | 0.142 |
| 8.592e-06 | 0.142 |
| 8.624e-06 | 0.142 |
| 8.656e-06 | 0.146 |
| 8.688e-06 | 0.146 |
| 8.72e-06 | 0.146 |
| 8.752e-06 | 0.146 |
| 8.784e-06 | 0.146 |
| 8.816e-06 | 0.146 |
| 8.848e-06 | 0.146 |
| 8.88e-06 | 0.146 |
| 8.912e-06 | 0.15 |
| 8.944e-06 | 0.15 |
| 8.976e-06 | 0.15 |
| 9.008e-06 | 0.15 |
| 9.04e-06 | 0.15 |
| 9.072e-06 | 0.15 |
| 9.104e-06 | 0.15 |
| 9.136e-06 | 0.15 |
| 9.168e-06 | 0.15 |
| 9.2e-06 | 0.154 |
| 9.232e-06 | 0.154 |
| 9.264e-06 | 0.154 |
| 9.296e-06 | 0.154 |
| 9.328e-06 | 0.154 |
| 9.36e-06 | 0.154 |
| 9.392e-06 | 0.154 |
| 9.424e-06 | 0.154 |
| 9.456e-06 | 0.154 |
| 9.488e-06 | 0.158 |
| 9.52e-06 | 0.154 |
| 9.552e-06 | 0.158 |
| 9.584e-06 | 0.158 |
| 9.616e-06 | 0.158 |
| 9.648e-06 | 0.158 |
| 9.68e-06 | 0.158 |
| 9.712e-06 | 0.162 |
| 9.744e-06 | 0.162 |
| 9.776e-06 | 0.162 |
| 9.808e-06 | 0.162 |
| 9.84e-06 | 0.162 |
| 9.872e-06 | 0.162 |
| 9.904e-06 | 0.158 |
| 9.936e-06 | 0.162 |
| 9.968e-06 | 0.162 |
| 1e-05 | 0.166 |
| 1.0032e-05 | 0.162 |
| 1.0064e-05 | 0.162 |
| 1.0096e-05 | 0.166 |
| 1.0128e-05 | 0.166 |
| 1.016e-05 | 0.162 |
| 1.0192e-05 | 0.166 |
| 1.0224e-05 | 0.166 |
| 1.0256e-05 | 0.162 |
| 1.0288e-05 | 0.166 |
| 1.032e-05 | 0.166 |
| 1.0352e-05 | 0.166 |
| 1.0384e-05 | 0.166 |
| 1.0416e-05 | 0.166 |
| 1.0448e-05 | 0.166 |
| 1.048e-05 | 0.166 |
| 1.0512e-05 | 0.17 |
| 1.0544e-05 | 0.166 |
| 1.0576e-05 | 0.166 |
| 1.0608e-05 | 0.17 |
| 1.064e-05 | 0.166 |
| 1.0672e-05 | 0.166 |
| 1.0704e-05 | 0.17 |
| 1.0736e-05 | 0.17 |
| 1.0768e-05 | 0.17 |
| 1.08e-05 | 0.166 |
| 1.0832e-05 | 0.17 |
| 1.0864e-05 | 0.17 |
| 1.0896e-05 | 0.17 |
| 1.0928e-05 | 0.166 |
| 1.096e-05 | 0.17 |
| 1.0992e-05 | 0.166 |
| 1.1024e-05 | 0.17 |
| 1.1056e-05 | 0.17 |
| 1.1088e-05 | 0.17 |
| 1.112e-05 | 0.166 |
| 1.1152e-05 | 0.17 |
| 1.1184e-05 | 0.166 |
| 1.1216e-05 | 0.166 |
| 1.1248e-05 | 0.166 |
| 1.128e-05 | 0.166 |
| 1.1312e-05 | 0.17 |
| 1.1344e-05 | 0.166 |
| 1.1376e-05 | 0.166 |
| 1.1408e-05 | 0.166 |
| 1.144e-05 | 0.166 |
| 1.1472e-05 | 0.166 |
| 1.1504e-05 | 0.166 |
| 1.1536e-05 | 0.166 |
| 1.1568e-05 | 0.166 |
| 1.16e-05 | 0.166 |
| 1.1632e-05 | 0.166 |
| 1.1664e-05 | 0.166 |
| 1.1696e-05 | 0.17 |
| 1.1728e-05 | 0.166 |
| 1.176e-05 | 0.17 |
| 1.1792e-05 | 0.17 |
| 1.1824e-05 | 0.17 |
| 1.1856e-05 | 0.166 |
| 1.1888e-05 | 0.166 |
| 1.192e-05 | 0.17 |
| 1.1952e-05 | 0.17 |
| 1.1984e-05 | 0.166 |
| 1.2016e-05 | 0.166 |
| 1.2048e-05 | 0.17 |
| 1.208e-05 | 0.166 |
| 1.2112e-05 | 0.17 |
| 1.2144e-05 | 0.17 |
| 1.2176e-05 | 0.17 |
| 1.2208e-05 | 0.17 |
| 1.224e-05 | 0.17 |
| 1.2272e-05 | 0.17 |
| 1.2304e-05 | 0.17 |
| 1.2336e-05 | 0.17 |
| 1.2368e-05 | 0.17 |
| 1.24e-05 | 0.17 |
| 1.2432e-05 | 0.17 |
| 1.2464e-05 | 0.17 |
| 1.2496e-05 | 0.174 |
| 1.2528e-05 | 0.17 |
| 1.256e-05 | 0.17 |
| 1.2592e-05 | 0.17 |
| 1.2624e-05 | 0.17 |
| 1.2656e-05 | 0.17 |
| 1.2688e-05 | 0.174 |
| 1.272e-05 | 0.17 |
| 1.2752e-05 | 0.174 |
| 1.2784e-05 | 0.17 |
| 1.2816e-05 | 0.17 |
| 1.2848e-05 | 0.174 |
| 1.288e-05 | 0.17 |
| 1.2912e-05 | 0.174 |
| 1.2944e-05 | 0.174 |
| 1.2976e-05 | 0.174 |
| 1.3008e-05 | 0.174 |
| 1.304e-05 | 0.174 |
| 1.3072e-05 | 0.174 |
| 1.3104e-05 | 0.17 |
| 1.3136e-05 | 0.174 |
| 1.3168e-05 | 0.174 |
| 1.32e-05 | 0.174 |
| 1.3232e-05 | 0.17 |
| 1.3264e-05 | 0.174 |
| 1.3296e-05 | 0.17 |
| 1.3328e-05 | 0.174 |
| 1.336e-05 | 0.174 |
| 1.3392e-05 | 0.174 |
| 1.3424e-05 | 0.174 |
| 1.3456e-05 | 0.17 |
| 1.3488e-05 | 0.174 |
| 1.352e-05 | 0.174 |
| 1.3552e-05 | 0.174 |
| 1.3584e-05 | 0.174 |
| 1.3616e-05 | 0.174 |
| 1.3648e-05 | 0.174 |
| 1.368e-05 | 0.17 |
| 1.3712e-05 | 0.174 |
| 1.3744e-05 | 0.174 |
| 1.3776e-05 | 0.174 |
| 1.3808e-05 | 0.174 |
| 1.384e-05 | 0.174 |
| 1.3872e-05 | 0.174 |
| 1.3904e-05 | 0.178 |
| 1.3936e-05 | 0.174 |
| 1.3968e-05 | 0.178 |
| 1.4e-05 | 0.178 |
| 1.4032e-05 | 0.174 |
| 1.4064e-05 | 0.174 |
| 1.4096e-05 | 0.174 |
| 1.4128e-05 | 0.174 |
| 1.416e-05 | 0.174 |
| 1.4192e-05 | 0.178 |
| 1.4224e-05 | 0.174 |
| 1.4256e-05 | 0.174 |
| 1.4288e-05 | 0.174 |
| 1.432e-05 | 0.174 |
| 1.4352e-05 | 0.174 |
| 1.4384e-05 | 0.174 |
| 1.4416e-05 | 0.174 |
| 1.4448e-05 | 0.174 |
| 1.448e-05 | 0.174 |
| 1.4512e-05 | 0.174 |
| 1.4544e-05 | 0.174 |
| 1.4576e-05 | 0.174 |
| 1.4608e-05 | 0.174 |
| 1.464e-05 | 0.17 |
| 1.4672e-05 | 0.174 |
| 1.4704e-05 | 0.174 |
| 1.4736e-05 | 0.174 |
| 1.4768e-05 | 0.174 |
| 1.48e-05 | 0.174 |
| 1.4832e-05 | 0.174 |
| 1.4864e-05 | 0.174 |
| 1.4896e-05 | 0.174 |
| 1.4928e-05 | 0.174 |
| 1.496e-05 | 0.17 |
| 1.4992e-05 | 0.17 |
| 1.5024e-05 | 0.174 |
| 1.5056e-05 | 0.174 |
| 1.5088e-05 | 0.174 |
| 1.512e-05 | 0.17 |
| 1.5152e-05 | 0.174 |
| 1.5184e-05 | 0.17 |
| 1.5216e-05 | 0.174 |
| 1.5248e-05 | 0.17 |
| 1.528e-05 | 0.17 |
| 1.5312e-05 | 0.17 |
| 1.5344e-05 | 0.174 |
| 1.5376e-05 | 0.174 |
| 1.5408e-05 | 0.174 |
| 1.544e-05 | 0.174 |
| 1.5472e-05 | 0.174 |
| 1.5504e-05 | 0.174 |
| 1.5536e-05 | 0.174 |
| 1.5568e-05 | 0.174 |
| 1.56e-05 | 0.174 |
| 1.5632e-05 | 0.174 |
| 1.5664e-05 | 0.174 |
| 1.5696e-05 | 0.174 |
| 1.5728e-05 | 0.174 |
| 1.576e-05 | 0.174 |
| 1.5792e-05 | 0.174 |
| 1.5824e-05 | 0.174 |
| 1.5856e-05 | 0.174 |
| 1.5888e-05 | 0.174 |
| 1.592e-05 | 0.178 |
| 1.5952e-05 | 0.174 |
| 1.5984e-05 | 0.174 |
| 1.6016e-05 | 0.174 |
| 1.6048e-05 | 0.178 |
| 1.608e-05 | 0.178 |
| 1.6112e-05 | 0.174 |
| 1.6144e-05 | 0.178 |
| 1.6176e-05 | 0.178 |
| 1.6208e-05 | 0.178 |
| 1.624e-05 | 0.182 |
| 1.6272e-05 | 0.178 |
| 1.6304e-05 | 0.178 |
| 1.6336e-05 | 0.178 |
| 1.6368e-05 | 0.178 |
| 1.64e-05 | 0.178 |
| 1.6432e-05 | 0.182 |
| 1.6464e-05 | 0.178 |
| 1.6496e-05 | 0.182 |
| 1.6528e-05 | 0.182 |
| 1.656e-05 | 0.182 |
| 1.6592e-05 | 0.182 |
| 1.6624e-05 | 0.182 |
| 1.6656e-05 | 0.186 |
| 1.6688e-05 | 0.186 |
| 1.672e-05 | 0.186 |
| 1.6752e-05 | 0.186 |
| 1.6784e-05 | 0.186 |
| 1.6816e-05 | 0.186 |
| 1.6848e-05 | 0.186 |
| 1.688e-05 | 0.186 |
| 1.6912e-05 | 0.186 |
| 1.6944e-05 | 0.19 |
| 1.6976e-05 | 0.186 |
| 1.7008e-05 | 0.186 |
| 1.704e-05 | 0.186 |
| 1.7072e-05 | 0.19 |
| 1.7104e-05 | 0.19 |
| 1.7136e-05 | 0.19 |
| 1.7168e-05 | 0.19 |
| 1.72e-05 | 0.19 |
| 1.7232e-05 | 0.19 |
| 1.7264e-05 | 0.19 |
| 1.7296e-05 | 0.194 |
| 1.7328e-05 | 0.194 |
| 1.736e-05 | 0.194 |
| 1.7392e-05 | 0.194 |
| 1.7424e-05 | 0.19 |
| 1.7456e-05 | 0.194 |
| 1.7488e-05 | 0.194 |
| 1.752e-05 | 0.194 |
| 1.7552e-05 | 0.194 |
| 1.7584e-05 | 0.194 |
| 1.7616e-05 | 0.194 |
| 1.7648e-05 | 0.194 |
| 1.768e-05 | 0.194 |
| 1.7712e-05 | 0.194 |
| 1.7744e-05 | 0.194 |
| 1.7776e-05 | 0.194 |
| 1.7808e-05 | 0.194 |
| 1.784e-05 | 0.194 |
| 1.7872e-05 | 0.194 |
| 1.7904e-05 | 0.194 |
| 1.7936e-05 | 0.194 |
| 1.7968e-05 | 0.194 |
| 1.8e-05 | 0.194 |
| 1.8032e-05 | 0.194 |
| 1.8064e-05 | 0.194 |
| 1.8096e-05 | 0.194 |
| 1.8128e-05 | 0.194 |
| 1.816e-05 | 0.194 |
| 1.8192e-05 | 0.194 |
| 1.8224e-05 | 0.194 |
| 1.8256e-05 | 0.194 |
| 1.8288e-05 | 0.198 |
| 1.832e-05 | 0.194 |
| 1.8352e-05 | 0.194 |
| 1.8384e-05 | 0.194 |
| 1.8416e-05 | 0.194 |
| 1.8448e-05 | 0.194 |
| 1.848e-05 | 0.194 |
| 1.8512e-05 | 0.198 |
| 1.8544e-05 | 0.194 |
| 1.8576e-05 | 0.194 |
| 1.8608e-05 | 0.194 |
| 1.864e-05 | 0.194 |
| 1.8672e-05 | 0.194 |
| 1.8704e-05 | 0.194 |
| 1.8736e-05 | 0.198 |
| 1.8768e-05 | 0.194 |
| 1.88e-05 | 0.198 |
| 1.8832e-05 | 0.198 |
| 1.8864e-05 | 0.198 |
| 1.8896e-05 | 0.198 |
| 1.8928e-05 | 0.198 |
| 1.896e-05 | 0.202 |
| 1.8992e-05 | 0.198 |
| 1.9024e-05 | 0.198 |
| 1.9056e-05 | 0.198 |
| 1.9088e-05 | 0.202 |
| 1.912e-05 | 0.202 |
| 1.9152e-05 | 0.202 |
| 1.9184e-05 | 0.202 |
| 1.9216e-05 | 0.202 |
| 1.9248e-05 | 0.206 |
| 1.928e-05 | 0.206 |
| 1.9312e-05 | 0.202 |
| 1.9344e-05 | 0.206 |
| 1.9376e-05 | 0.21 |
| 1.9408e-05 | 0.21 |
| 1.944e-05 | 0.21 |
| 1.9472e-05 | 0.21 |
| 1.9504e-05 | 0.21 |
| 1.9536e-05 | 0.21 |
| 1.9568e-05 | 0.21 |
| 1.96e-05 | 0.21 |
| 1.9632e-05 | 0.21 |
| 1.9664e-05 | 0.21 |
| 1.9696e-05 | 0.214 |
| 1.9728e-05 | 0.21 |
| 1.976e-05 | 0.214 |
| 1.9792e-05 | 0.214 |
| 1.9824e-05 | 0.214 |
| 1.9856e-05 | 0.214 |
| 1.9888e-05 | 0.218 |
| 1.992e-05 | 0.214 |
| 1.9952e-05 | 0.214 |
| 1.9984e-05 | 0.214 |
| 2.0016e-05 | 0.214 |
| 2.0048e-05 | 0.214 |
| 2.008e-05 | 0.218 |
| 2.0112e-05 | 0.218 |
| 2.0144e-05 | 0.214 |
| 2.0176e-05 | 0.214 |
| 2.0208e-05 | 0.214 |
| 2.024e-05 | 0.218 |
| 2.0272e-05 | 0.218 |
| 2.0304e-05 | 0.218 |
| 2.0336e-05 | 0.218 |
| 2.0368e-05 | 0.218 |
| 2.04e-05 | 0.214 |
| 2.0432e-05 | 0.218 |
| 2.0464e-05 | 0.218 |
| 2.0496e-05 | 0.218 |
| 2.0528e-05 | 0.218 |
| 2.056e-05 | 0.218 |
| 2.0592e-05 | 0.218 |
| 2.0624e-05 | 0.218 |
| 2.0656e-05 | 0.218 |
| 2.0688e-05 | 0.218 |
| 2.072e-05 | 0.218 |
| 2.0752e-05 | 0.218 |
| 2.0784e-05 | 0.218 |
| 2.0816e-05 | 0.218 |
| 2.0848e-05 | 0.218 |
| 2.088e-05 | 0.218 |
| 2.0912e-05 | 0.218 |
| 2.0944e-05 | 0.218 |
| 2.0976e-05 | 0.218 |
| 2.1008e-05 | 0.218 |
| 2.104e-05 | 0.218 |
| 2.1072e-05 | 0.214 |
| 2.1104e-05 | 0.214 |
| 2.1136e-05 | 0.218 |
| 2.1168e-05 | 0.214 |
| 2.12e-05 | 0.218 |
| 2.1232e-05 | 0.214 |
| 2.1264e-05 | 0.214 |
| 2.1296e-05 | 0.218 |
| 2.1328e-05 | 0.214 |
| 2.136e-05 | 0.214 |
| 2.1392e-05 | 0.214 |
| 2.1424e-05 | 0.214 |
| 2.1456e-05 | 0.214 |
| 2.1488e-05 | 0.21 |
| 2.152e-05 | 0.214 |
| 2.1552e-05 | 0.214 |
| 2.1584e-05 | 0.214 |
| 2.1616e-05 | 0.214 |
| 2.1648e-05 | 0.21 |
| 2.168e-05 | 0.21 |
| 2.1712e-05 | 0.21 |
| 2.1744e-05 | 0.21 |
| 2.1776e-05 | 0.214 |
| 2.1808e-05 | 0.214 |
| 2.184e-05 | 0.21 |
| 2.1872e-05 | 0.214 |
| 2.1904e-05 | 0.21 |
| 2.1936e-05 | 0.21 |
| 2.1968e-05 | 0.21 |
| 2.2e-05 | 0.21 |
| 2.2032e-05 | 0.21 |
| 2.2064e-05 | 0.21 |
| 2.2096e-05 | 0.21 |
| 2.2128e-05 | 0.21 |
| 2.216e-05 | 0.21 |
| 2.2192e-05 | 0.21 |
| 2.2224e-05 | 0.21 |
| 2.2256e-05 | 0.206 |
| 2.2288e-05 | 0.21 |
| 2.232e-05 | 0.21 |
| 2.2352e-05 | 0.21 |
| 2.2384e-05 | 0.21 |
| 2.2416e-05 | 0.21 |
| 2.2448e-05 | 0.21 |
| 2.248e-05 | 0.206 |
| 2.2512e-05 | 0.21 |
| 2.2544e-05 | 0.21 |
| 2.2576e-05 | 0.21 |
| 2.2608e-05 | 0.21 |
| 2.264e-05 | 0.21 |
| 2.2672e-05 | 0.21 |
| 2.2704e-05 | 0.21 |
| 2.2736e-05 | 0.21 |
| 2.2768e-05 | 0.21 |
| 2.28e-05 | 0.21 |
| 2.2832e-05 | 0.21 |
| 2.2864e-05 | 0.21 |
| 2.2896e-05 | 0.21 |
| 2.2928e-05 | 0.21 |
| 2.296e-05 | 0.21 |
| 2.2992e-05 | 0.21 |
| 2.3024e-05 | 0.206 |
| 2.3056e-05 | 0.21 |
| 2.3088e-05 | 0.21 |
| 2.312e-05 | 0.21 |
| 2.3152e-05 | 0.214 |
| 2.3184e-05 | 0.21 |
| 2.3216e-05 | 0.21 |
| 2.3248e-05 | 0.21 |
| 2.328e-05 | 0.21 |
| 2.3312e-05 | 0.21 |
| 2.3344e-05 | 0.21 |
| 2.3376e-05 | 0.21 |
| 2.3408e-05 | 0.21 |
| 2.344e-05 | 0.21 |
| 2.3472e-05 | 0.21 |
| 2.3504e-05 | 0.21 |
| 2.3536e-05 | 0.21 |
| 2.3568e-05 | 0.21 |
| 2.36e-05 | 0.206 |
| 2.3632e-05 | 0.206 |
| 2.3664e-05 | 0.206 |
| 2.3696e-05 | 0.206 |
| 2.3728e-05 | 0.21 |
| 2.376e-05 | 0.206 |
| 2.3792e-05 | 0.21 |
| 2.3824e-05 | 0.21 |
| 2.3856e-05 | 0.21 |
| 2.3888e-05 | 0.206 |
| 2.392e-05 | 0.21 |
| 2.3952e-05 | 0.206 |
| 2.3984e-05 | 0.206 |
| 2.4016e-05 | 0.206 |
| 2.4048e-05 | 0.206 |
| 2.408e-05 | 0.206 |
| 2.4112e-05 | 0.206 |
| 2.4144e-05 | 0.206 |
| 2.4176e-05 | 0.206 |
| 2.4208e-05 | 0.206 |
| 2.424e-05 | 0.206 |
| 2.4272e-05 | 0.206 |
| 2.4304e-05 | 0.206 |
| 2.4336e-05 | 0.206 |
| 2.4368e-05 | 0.206 |
| 2.44e-05 | 0.206 |
| 2.4432e-05 | 0.206 |
| 2.4464e-05 | 0.206 |
| 2.4496e-05 | 0.206 |
| 2.4528e-05 | 0.206 |
| 2.456e-05 | 0.202 |
| 2.4592e-05 | 0.202 |
| 2.4624e-05 | 0.202 |
| 2.4656e-05 | 0.202 |
| 2.4688e-05 | 0.202 |
| 2.472e-05 | 0.202 |
| 2.4752e-05 | 0.202 |
| 2.4784e-05 | 0.202 |
| 2.4816e-05 | 0.202 |
| 2.4848e-05 | 0.198 |
| 2.488e-05 | 0.198 |
| 2.4912e-05 | 0.198 |
| 2.4944e-05 | 0.198 |
| 2.4976e-05 | 0.198 |
| 2.5008e-05 | 0.202 |
| 2.504e-05 | 0.202 |
| 2.5072e-05 | 0.202 |
| 2.5104e-05 | 0.202 |
| 2.5136e-05 | 0.198 |
| 2.5168e-05 | 0.198 |
| 2.52e-05 | 0.198 |
| 2.5232e-05 | 0.198 |
| 2.5264e-05 | 0.198 |
| 2.5296e-05 | 0.198 |
| 2.5328e-05 | 0.198 |
| 2.536e-05 | 0.198 |
| 2.5392e-05 | 0.198 |
| 2.5424e-05 | 0.198 |
| 2.5456e-05 | 0.202 |
| 2.5488e-05 | 0.198 |
| 2.552e-05 | 0.198 |
| 2.5552e-05 | 0.198 |
| 2.5584e-05 | 0.202 |
| 2.5616e-05 | 0.202 |
| 2.5648e-05 | 0.198 |
| 2.568e-05 | 0.198 |
| 2.5712e-05 | 0.198 |
| 2.5744e-05 | 0.202 |
| 2.5776e-05 | 0.198 |
| 2.5808e-05 | 0.198 |
| 2.584e-05 | 0.198 |
| 2.5872e-05 | 0.198 |
| 2.5904e-05 | 0.198 |
| 2.5936e-05 | 0.202 |
| 2.5968e-05 | 0.198 |
| 2.6e-05 | 0.198 |
| 2.6032e-05 | 0.202 |
| 2.6064e-05 | 0.202 |
| 2.6096e-05 | 0.198 |
| 2.6128e-05 | 0.198 |
| 2.616e-05 | 0.198 |
| 2.6192e-05 | 0.198 |
| 2.6224e-05 | 0.202 |
| 2.6256e-05 | 0.198 |
| 2.6288e-05 | 0.202 |
| 2.632e-05 | 0.198 |
| 2.6352e-05 | 0.198 |
| 2.6384e-05 | 0.198 |
| 2.6416e-05 | 0.198 |
| 2.6448e-05 | 0.198 |
| 2.648e-05 | 0.198 |
| 2.6512e-05 | 0.198 |
| 2.6544e-05 | 0.198 |
| 2.6576e-05 | 0.198 |
| 2.6608e-05 | 0.198 |
| 2.664e-05 | 0.198 |
| 2.6672e-05 | 0.198 |
| 2.6704e-05 | 0.198 |
| 2.6736e-05 | 0.198 |
| 2.6768e-05 | 0.198 |
| 2.68e-05 | 0.198 |
| 2.6832e-05 | 0.198 |
| 2.6864e-05 | 0.198 |
| 2.6896e-05 | 0.194 |
| 2.6928e-05 | 0.194 |
| 2.696e-05 | 0.198 |
| 2.6992e-05 | 0.198 |
| 2.7024e-05 | 0.198 |
| 2.7056e-05 | 0.198 |
| 2.7088e-05 | 0.194 |
| 2.712e-05 | 0.198 |
| 2.7152e-05 | 0.198 |
| 2.7184e-05 | 0.194 |
| 2.7216e-05 | 0.194 |
| 2.7248e-05 | 0.198 |
| 2.728e-05 | 0.194 |
| 2.7312e-05 | 0.198 |
| 2.7344e-05 | 0.198 |
| 2.7376e-05 | 0.198 |
| 2.7408e-05 | 0.194 |
| 2.744e-05 | 0.198 |
| 2.7472e-05 | 0.194 |
| 2.7504e-05 | 0.198 |
| 2.7536e-05 | 0.198 |
| 2.7568e-05 | 0.198 |
| 2.76e-05 | 0.198 |
| 2.7632e-05 | 0.198 |
| 2.7664e-05 | 0.198 |
| 2.7696e-05 | 0.198 |
| 2.7728e-05 | 0.198 |
| 2.776e-05 | 0.198 |
| 2.7792e-05 | 0.198 |
| 2.7824e-05 | 0.198 |
| 2.7856e-05 | 0.198 |
| 2.7888e-05 | 0.198 |
| 2.792e-05 | 0.198 |
| 2.7952e-05 | 0.198 |
| 2.7984e-05 | 0.198 |
| 2.8016e-05 | 0.202 |
| 2.8048e-05 | 0.198 |
| 2.808e-05 | 0.198 |
| 2.8112e-05 | 0.198 |
| 2.8144e-05 | 0.198 |
| 2.8176e-05 | 0.198 |
| 2.8208e-05 | 0.198 |
| 2.824e-05 | 0.202 |
| 2.8272e-05 | 0.198 |
| 2.8304e-05 | 0.202 |
| 2.8336e-05 | 0.202 |
| 2.8368e-05 | 0.202 |
| 2.84e-05 | 0.202 |
| 2.8432e-05 | 0.198 |
| 2.8464e-05 | 0.202 |
| 2.8496e-05 | 0.202 |
| 2.8528e-05 | 0.202 |
| 2.856e-05 | 0.198 |
| 2.8592e-05 | 0.202 |
| 2.8624e-05 | 0.202 |
| 2.8656e-05 | 0.202 |
| 2.8688e-05 | 0.198 |
| 2.872e-05 | 0.202 |
| 2.8752e-05 | 0.202 |
| 2.8784e-05 | 0.202 |
| 2.8816e-05 | 0.202 |
| 2.8848e-05 | 0.202 |
| 2.888e-05 | 0.198 |
| 2.8912e-05 | 0.202 |
| 2.8944e-05 | 0.202 |
| 2.8976e-05 | 0.202 |
| 2.9008e-05 | 0.206 |
| 2.904e-05 | 0.202 |
| 2.9072e-05 | 0.202 |
| 2.9104e-05 | 0.202 |
| 2.9136e-05 | 0.202 |
| 2.9168e-05 | 0.202 |
| 2.92e-05 | 0.202 |
| 2.9232e-05 | 0.202 |
| 2.9264e-05 | 0.202 |
| 2.9296e-05 | 0.206 |
| 2.9328e-05 | 0.202 |
| 2.936e-05 | 0.202 |
| 2.9392e-05 | 0.206 |
| 2.9424e-05 | 0.202 |
| 2.9456e-05 | 0.202 |
| 2.9488e-05 | 0.202 |
| 2.952e-05 | 0.206 |
| 2.9552e-05 | 0.206 |
| 2.9584e-05 | 0.206 |
| 2.9616e-05 | 0.206 |
| 2.9648e-05 | 0.202 |
| 2.968e-05 | 0.206 |
| 2.9712e-05 | 0.206 |
| 2.9744e-05 | 0.202 |
| 2.9776e-05 | 0.206 |
| 2.9808e-05 | 0.206 |
| 2.984e-05 | 0.202 |
| 2.9872e-05 | 0.206 |
| 2.9904e-05 | 0.206 |
| 2.9936e-05 | 0.206 |
| 2.9968e-05 | 0.206 |
| 3e-05 | 0.202 |
| 3.0032e-05 | 0.202 |
| 3.0064e-05 | 0.202 |
| 3.0096e-05 | 0.202 |
| 3.0128e-05 | 0.202 |
| 3.016e-05 | 0.202 |
| 3.0192e-05 | 0.202 |
| 3.0224e-05 | 0.202 |
| 3.0256e-05 | 0.202 |
| 3.0288e-05 | 0.202 |
| 3.032e-05 | 0.202 |
| 3.0352e-05 | 0.202 |
| 3.0384e-05 | 0.202 |
| 3.0416e-05 | 0.198 |
| 3.0448e-05 | 0.198 |
| 3.048e-05 | 0.198 |
| 3.0512e-05 | 0.202 |
| 3.0544e-05 | 0.202 |
| 3.0576e-05 | 0.202 |
| 3.0608e-05 | 0.202 |
| 3.064e-05 | 0.202 |
| 3.0672e-05 | 0.202 |
| 3.0704e-05 | 0.198 |
| 3.0736e-05 | 0.202 |
| 3.0768e-05 | 0.198 |
| 3.08e-05 | 0.202 |
| 3.0832e-05 | 0.198 |
| 3.0864e-05 | 0.198 |
| 3.0896e-05 | 0.198 |
| 3.0928e-05 | 0.202 |
| 3.096e-05 | 0.202 |
| 3.0992e-05 | 0.198 |
| 3.1024e-05 | 0.198 |
| 3.1056e-05 | 0.202 |
| 3.1088e-05 | 0.198 |
| 3.112e-05 | 0.198 |
| 3.1152e-05 | 0.198 |
| 3.1184e-05 | 0.198 |
| 3.1216e-05 | 0.198 |
| 3.1248e-05 | 0.202 |
| 3.128e-05 | 0.198 |
| 3.1312e-05 | 0.198 |
| 3.1344e-05 | 0.198 |
| 3.1376e-05 | 0.202 |
| 3.1408e-05 | 0.198 |
| 3.144e-05 | 0.198 |
| 3.1472e-05 | 0.198 |
| 3.1504e-05 | 0.198 |
| 3.1536e-05 | 0.198 |
| 3.1568e-05 | 0.198 |
| 3.16e-05 | 0.198 |
| 3.1632e-05 | 0.198 |
| 3.1664e-05 | 0.198 |
| 3.1696e-05 | 0.198 |
| 3.1728e-05 | 0.194 |
| 3.176e-05 | 0.198 |
| 3.1792e-05 | 0.198 |
| 3.1824e-05 | 0.198 |
| 3.1856e-05 | 0.194 |
| 3.1888e-05 | 0.198 |
| 3.192e-05 | 0.198 |
| 3.1952e-05 | 0.198 |
| 3.1984e-05 | 0.194 |
| 3.2016e-05 | 0.198 |
| 3.2048e-05 | 0.194 |
| 3.208e-05 | 0.194 |
| 3.2112e-05 | 0.194 |
| 3.2144e-05 | 0.194 |
| 3.2176e-05 | 0.194 |
| 3.2208e-05 | 0.194 |
| 3.224e-05 | 0.194 |
| 3.2272e-05 | 0.194 |
| 3.2304e-05 | 0.194 |
| 3.2336e-05 | 0.194 |
| 3.2368e-05 | 0.19 |
| 3.24e-05 | 0.194 |
| 3.2432e-05 | 0.194 |
| 3.2464e-05 | 0.194 |
| 3.2496e-05 | 0.194 |
| 3.2528e-05 | 0.194 |
| 3.256e-05 | 0.194 |
| 3.2592e-05 | 0.19 |
| 3.2624e-05 | 0.19 |
| 3.2656e-05 | 0.19 |
| 3.2688e-05 | 0.19 |
| 3.272e-05 | 0.19 |
| 3.2752e-05 | 0.194 |
| 3.2784e-05 | 0.19 |
| 3.2816e-05 | 0.19 |
| 3.2848e-05 | 0.19 |
| 3.288e-05 | 0.19 |
| 3.2912e-05 | 0.19 |
| 3.2944e-05 | 0.19 |
| 3.2976e-05 | 0.19 |
| 3.3008e-05 | 0.19 |
| 3.304e-05 | 0.194 |
| 3.3072e-05 | 0.19 |
| 3.3104e-05 | 0.19 |
| 3.3136e-05 | 0.19 |
| 3.3168e-05 | 0.19 |
| 3.32e-05 | 0.194 |
| 3.3232e-05 | 0.19 |
| 3.3264e-05 | 0.186 |
| 3.3296e-05 | 0.19 |
| 3.3328e-05 | 0.19 |
| 3.336e-05 | 0.19 |
| 3.3392e-05 | 0.186 |
| 3.3424e-05 | 0.19 |
| 3.3456e-05 | 0.19 |
| 3.3488e-05 | 0.186 |
| 3.352e-05 | 0.19 |
| 3.3552e-05 | 0.186 |
| 3.3584e-05 | 0.186 |
| 3.3616e-05 | 0.186 |
| 3.3648e-05 | 0.186 |
| 3.368e-05 | 0.186 |
| 3.3712e-05 | 0.186 |
| 3.3744e-05 | 0.186 |
| 3.3776e-05 | 0.186 |
| 3.3808e-05 | 0.186 |
| 3.384e-05 | 0.186 |
| 3.3872e-05 | 0.186 |
| 3.3904e-05 | 0.186 |
| 3.3936e-05 | 0.186 |
| 3.3968e-05 | 0.186 |
| 3.4e-05 | 0.186 |
| 3.4032e-05 | 0.182 |
| 3.4064e-05 | 0.186 |
| 3.4096e-05 | 0.186 |
| 3.4128e-05 | 0.182 |
| 3.416e-05 | 0.182 |
| 3.4192e-05 | 0.182 |
| 3.4224e-05 | 0.182 |
| 3.4256e-05 | 0.182 |
| 3.4288e-05 | 0.182 |
| 3.432e-05 | 0.178 |
| 3.4352e-05 | 0.182 |
| 3.4384e-05 | 0.182 |
| 3.4416e-05 | 0.182 |
| 3.4448e-05 | 0.182 |
| 3.448e-05 | 0.178 |
| 3.4512e-05 | 0.178 |
| 3.4544e-05 | 0.178 |
| 3.4576e-05 | 0.178 |
| 3.4608e-05 | 0.178 |
| 3.464e-05 | 0.178 |
| 3.4672e-05 | 0.178 |
| 3.4704e-05 | 0.178 |
| 3.4736e-05 | 0.178 |
| 3.4768e-05 | 0.178 |
| 3.48e-05 | 0.178 |
| 3.4832e-05 | 0.178 |
| 3.4864e-05 | 0.174 |
| 3.4896e-05 | 0.178 |
| 3.4928e-05 | 0.174 |
| 3.496e-05 | 0.178 |
| 3.4992e-05 | 0.174 |
| 3.5024e-05 | 0.174 |
| 3.5056e-05 | 0.178 |
| 3.5088e-05 | 0.178 |
| 3.512e-05 | 0.178 |
| 3.5152e-05 | 0.178 |
| 3.5184e-05 | 0.178 |
| 3.5216e-05 | 0.178 |
| 3.5248e-05 | 0.174 |
| 3.528e-05 | 0.174 |
| 3.5312e-05 | 0.174 |
| 3.5344e-05 | 0.178 |
| 3.5376e-05 | 0.178 |
| 3.5408e-05 | 0.178 |
| 3.544e-05 | 0.178 |
| 3.5472e-05 | 0.174 |
| 3.5504e-05 | 0.178 |
| 3.5536e-05 | 0.178 |
| 3.5568e-05 | 0.174 |
| 3.56e-05 | 0.174 |
| 3.5632e-05 | 0.174 |
| 3.5664e-05 | 0.174 |
| 3.5696e-05 | 0.174 |
| 3.5728e-05 | 0.174 |
| 3.576e-05 | 0.174 |
| 3.5792e-05 | 0.174 |
| 3.5824e-05 | 0.174 |
| 3.5856e-05 | 0.174 |
| 3.5888e-05 | 0.178 |
| 3.592e-05 | 0.174 |
| 3.5952e-05 | 0.178 |
| 3.5984e-05 | 0.174 |
| 3.6016e-05 | 0.178 |
| 3.6048e-05 | 0.174 |
| 3.608e-05 | 0.178 |
| 3.6112e-05 | 0.178 |
| 3.6144e-05 | 0.178 |
| 3.6176e-05 | 0.178 |
| 3.6208e-05 | 0.178 |
| 3.624e-05 | 0.178 |
| 3.6272e-05 | 0.178 |
| 3.6304e-05 | 0.178 |
| 3.6336e-05 | 0.182 |
| 3.6368e-05 | 0.178 |
| 3.64e-05 | 0.178 |
| 3.6432e-05 | 0.182 |
| 3.6464e-05 | 0.182 |
| 3.6496e-05 | 0.182 |
| 3.6528e-05 | 0.178 |
| 3.656e-05 | 0.178 |
| 3.6592e-05 | 0.178 |
| 3.6624e-05 | 0.182 |
| 3.6656e-05 | 0.178 |
| 3.6688e-05 | 0.178 |
| 3.672e-05 | 0.178 |
| 3.6752e-05 | 0.178 |
| 3.6784e-05 | 0.178 |
| 3.6816e-05 | 0.178 |
| 3.6848e-05 | 0.178 |
| 3.688e-05 | 0.178 |
| 3.6912e-05 | 0.178 |
| 3.6944e-05 | 0.174 |
| 3.6976e-05 | 0.178 |
| 3.7008e-05 | 0.174 |
| 3.704e-05 | 0.174 |
| 3.7072e-05 | 0.178 |
| 3.7104e-05 | 0.17 |
| 3.7136e-05 | 0.174 |
| 3.7168e-05 | 0.174 |
| 3.72e-05 | 0.174 |
| 3.7232e-05 | 0.174 |
| 3.7264e-05 | 0.17 |
| 3.7296e-05 | 0.174 |
| 3.7328e-05 | 0.17 |
| 3.736e-05 | 0.17 |
| 3.7392e-05 | 0.174 |
| 3.7424e-05 | 0.17 |
| 3.7456e-05 | 0.17 |
| 3.7488e-05 | 0.17 |
| 3.752e-05 | 0.17 |
| 3.7552e-05 | 0.166 |
| 3.7584e-05 | 0.166 |
| 3.7616e-05 | 0.17 |
| 3.7648e-05 | 0.17 |
| 3.768e-05 | 0.166 |
| 3.7712e-05 | 0.166 |
| 3.7744e-05 | 0.166 |
| 3.7776e-05 | 0.166 |
| 3.7808e-05 | 0.166 |
| 3.784e-05 | 0.166 |
| 3.7872e-05 | 0.166 |
| 3.7904e-05 | 0.166 |
| 3.7936e-05 | 0.166 |
| 3.7968e-05 | 0.166 |
| 3.8e-05 | 0.162 |
| 3.8032e-05 | 0.166 |
| 3.8064e-05 | 0.166 |
| 3.8096e-05 | 0.162 |
| 3.8128e-05 | 0.162 |
| 3.816e-05 | 0.162 |
| 3.8192e-05 | 0.162 |
| 3.8224e-05 | 0.162 |
| 3.8256e-05 | 0.162 |
| 3.8288e-05 | 0.162 |
| 3.832e-05 | 0.162 |
| 3.8352e-05 | 0.162 |
| 3.8384e-05 | 0.158 |
| 3.8416e-05 | 0.158 |
| 3.8448e-05 | 0.158 |
| 3.848e-05 | 0.158 |
| 3.8512e-05 | 0.158 |
| 3.8544e-05 | 0.162 |
| 3.8576e-05 | 0.158 |
| 3.8608e-05 | 0.162 |
| 3.864e-05 | 0.158 |
| 3.8672e-05 | 0.158 |
| 3.8704e-05 | 0.158 |
| 3.8736e-05 | 0.158 |
| 3.8768e-05 | 0.158 |
| 3.88e-05 | 0.158 |
| 3.8832e-05 | 0.158 |
| 3.8864e-05 | 0.158 |
| 3.8896e-05 | 0.158 |
| 3.8928e-05 | 0.158 |
| 3.896e-05 | 0.158 |
| 3.8992e-05 | 0.158 |
| 3.9024e-05 | 0.158 |
| 3.9056e-05 | 0.158 |
| 3.9088e-05 | 0.158 |
| 3.912e-05 | 0.154 |
| 3.9152e-05 | 0.162 |
| 3.9184e-05 | 0.158 |
| 3.9216e-05 | 0.162 |
| 3.9248e-05 | 0.158 |
| 3.928e-05 | 0.158 |
| 3.9312e-05 | 0.162 |
| 3.9344e-05 | 0.166 |
| 3.9376e-05 | 0.162 |
| 3.9408e-05 | 0.162 |
| 3.944e-05 | 0.162 |
| 3.9472e-05 | 0.162 |
| 3.9504e-05 | 0.162 |
| 3.9536e-05 | 0.162 |
| 3.9568e-05 | 0.162 |
| 3.96e-05 | 0.162 |
| 3.9632e-05 | 0.166 |
| 3.9664e-05 | 0.166 |
| 3.9696e-05 | 0.162 |
| 3.9728e-05 | 0.166 |
| 3.976e-05 | 0.162 |
| 3.9792e-05 | 0.162 |
| 3.9824e-05 | 0.162 |
| 3.9856e-05 | 0.162 |
| 3.9888e-05 | 0.166 |
| 3.992e-05 | 0.166 |
| 3.9952e-05 | 0.162 |
| 3.9984e-05 | 0.162 |
| 4.0016e-05 | 0.166 |
| 4.0048e-05 | 0.162 |
| 4.008e-05 | 0.166 |
| 4.0112e-05 | 0.162 |
| 4.0144e-05 | 0.162 |
| 4.0176e-05 | 0.162 |
| 4.0208e-05 | 0.162 |
| 4.024e-05 | 0.162 |
| 4.0272e-05 | 0.162 |
| 4.0304e-05 | 0.162 |
| 4.0336e-05 | 0.162 |
| 4.0368e-05 | 0.162 |
| 4.04e-05 | 0.166 |
| 4.0432e-05 | 0.162 |
| 4.0464e-05 | 0.162 |
| 4.0496e-05 | 0.162 |
| 4.0528e-05 | 0.162 |
| 4.056e-05 | 0.162 |
| 4.0592e-05 | 0.162 |
| 4.0624e-05 | 0.158 |
| 4.0656e-05 | 0.162 |
| 4.0688e-05 | 0.158 |
| 4.072e-05 | 0.158 |
| 4.0752e-05 | 0.158 |
| 4.0784e-05 | 0.158 |
| 4.0816e-05 | 0.158 |
| 4.0848e-05 | 0.158 |
| 4.088e-05 | 0.158 |
| 4.0912e-05 | 0.158 |
| 4.0944e-05 | 0.158 |
| 4.0976e-05 | 0.158 |
| 4.1008e-05 | 0.158 |
| 4.104e-05 | 0.158 |
| 4.1072e-05 | 0.158 |
| 4.1104e-05 | 0.154 |
| 4.1136e-05 | 0.158 |
| 4.1168e-05 | 0.154 |
| 4.12e-05 | 0.154 |
| 4.1232e-05 | 0.154 |
| 4.1264e-05 | 0.154 |
| 4.1296e-05 | 0.154 |
| 4.1328e-05 | 0.154 |
| 4.136e-05 | 0.154 |
| 4.1392e-05 | 0.15 |
| 4.1424e-05 | 0.154 |
| 4.1456e-05 | 0.154 |
| 4.1488e-05 | 0.15 |
| 4.152e-05 | 0.15 |
| 4.1552e-05 | 0.154 |
| 4.1584e-05 | 0.15 |
| 4.1616e-05 | 0.154 |
| 4.1648e-05 | 0.15 |
| 4.168e-05 | 0.15 |
| 4.1712e-05 | 0.15 |
| 4.1744e-05 | 0.15 |
| 4.1776e-05 | 0.15 |
| 4.1808e-05 | 0.15 |
| 4.184e-05 | 0.15 |
| 4.1872e-05 | 0.15 |
| 4.1904e-05 | 0.15 |
| 4.1936e-05 | 0.146 |
| 4.1968e-05 | 0.146 |
| 4.2e-05 | 0.146 |
| 4.2032e-05 | 0.146 |
| 4.2064e-05 | 0.15 |
| 4.2096e-05 | 0.146 |
| 4.2128e-05 | 0.146 |
| 4.216e-05 | 0.15 |
| 4.2192e-05 | 0.146 |
| 4.2224e-05 | 0.15 |
| 4.2256e-05 | 0.146 |
| 4.2288e-05 | 0.15 |
| 4.232e-05 | 0.15 |
| 4.2352e-05 | 0.15 |
| 4.2384e-05 | 0.146 |
| 4.2416e-05 | 0.146 |
| 4.2448e-05 | 0.146 |
| 4.248e-05 | 0.146 |
| 4.2512e-05 | 0.146 |
| 4.2544e-05 | 0.146 |
| 4.2576e-05 | 0.146 |
| 4.2608e-05 | 0.146 |
| 4.264e-05 | 0.146 |
| 4.2672e-05 | 0.146 |
| 4.2704e-05 | 0.146 |
| 4.2736e-05 | 0.146 |
| 4.2768e-05 | 0.146 |
| 4.28e-05 | 0.15 |
| 4.2832e-05 | 0.146 |
| 4.2864e-05 | 0.146 |
| 4.2896e-05 | 0.146 |
| 4.2928e-05 | 0.15 |
| 4.296e-05 | 0.146 |
| 4.2992e-05 | 0.146 |
| 4.3024e-05 | 0.146 |
| 4.3056e-05 | 0.146 |
| 4.3088e-05 | 0.146 |
| 4.312e-05 | 0.146 |
| 4.3152e-05 | 0.146 |
| 4.3184e-05 | 0.15 |
| 4.3216e-05 | 0.146 |
| 4.3248e-05 | 0.146 |
| 4.328e-05 | 0.15 |
| 4.3312e-05 | 0.15 |
| 4.3344e-05 | 0.15 |
| 4.3376e-05 | 0.15 |
| 4.3408e-05 | 0.15 |
| 4.344e-05 | 0.15 |
| 4.3472e-05 | 0.15 |
| 4.3504e-05 | 0.15 |
| 4.3536e-05 | 0.15 |
| 4.3568e-05 | 0.15 |
| 4.36e-05 | 0.15 |
| 4.3632e-05 | 0.15 |
| 4.3664e-05 | 0.15 |
| 4.3696e-05 | 0.15 |
| 4.3728e-05 | 0.15 |
| 4.376e-05 | 0.154 |
| 4.3792e-05 | 0.154 |
| 4.3824e-05 | 0.154 |
| 4.3856e-05 | 0.154 |
| 4.3888e-05 | 0.154 |
| 4.392e-05 | 0.154 |
| 4.3952e-05 | 0.15 |
| 4.3984e-05 | 0.154 |
| 4.4016e-05 | 0.154 |
| 4.4048e-05 | 0.154 |
| 4.408e-05 | 0.154 |
| 4.4112e-05 | 0.154 |
| 4.4144e-05 | 0.154 |
| 4.4176e-05 | 0.154 |
| 4.4208e-05 | 0.154 |
| 4.424e-05 | 0.154 |
| 4.4272e-05 | 0.154 |
| 4.4304e-05 | 0.154 |
| 4.4336e-05 | 0.15 |
| 4.4368e-05 | 0.154 |
| 4.44e-05 | 0.154 |
| 4.4432e-05 | 0.154 |
| 4.4464e-05 | 0.154 |
| 4.4496e-05 | 0.154 |
| 4.4528e-05 | 0.154 |
| 4.456e-05 | 0.154 |
| 4.4592e-05 | 0.15 |
| 4.4624e-05 | 0.15 |
| 4.4656e-05 | 0.15 |
| 4.4688e-05 | 0.15 |
| 4.472e-05 | 0.15 |
| 4.4752e-05 | 0.154 |
| 4.4784e-05 | 0.154 |
| 4.4816e-05 | 0.154 |
| 4.4848e-05 | 0.15 |
| 4.488e-05 | 0.154 |
| 4.4912e-05 | 0.15 |
| 4.4944e-05 | 0.15 |
| 4.4976e-05 | 0.15 |
| 4.5008e-05 | 0.154 |
| 4.504e-05 | 0.15 |
| 4.5072e-05 | 0.15 |
| 4.5104e-05 | 0.15 |
| 4.5136e-05 | 0.154 |
| 4.5168e-05 | 0.154 |
| 4.52e-05 | 0.15 |
| 4.5232e-05 | 0.15 |
| 4.5264e-05 | 0.154 |
| 4.5296e-05 | 0.154 |
| 4.5328e-05 | 0.154 |
| 4.536e-05 | 0.154 |
| 4.5392e-05 | 0.15 |
| 4.5424e-05 | 0.154 |
| 4.5456e-05 | 0.15 |
| 4.5488e-05 | 0.154 |
| 4.552e-05 | 0.15 |
| 4.5552e-05 | 0.15 |
| 4.5584e-05 | 0.15 |
| 4.5616e-05 | 0.154 |
| 4.5648e-05 | 0.154 |
| 4.568e-05 | 0.15 |
| 4.5712e-05 | 0.15 |
| 4.5744e-05 | 0.154 |
| 4.5776e-05 | 0.15 |
| 4.5808e-05 | 0.154 |
| 4.584e-05 | 0.15 |
| 4.5872e-05 | 0.15 |
| 4.5904e-05 | 0.15 |
| 4.5936e-05 | 0.15 |
| 4.5968e-05 | 0.15 |
| 4.6e-05 | 0.15 |
| 4.6032e-05 | 0.15 |
| 4.6064e-05 | 0.15 |
| 4.6096e-05 | 0.146 |
| 4.6128e-05 | 0.15 |
| 4.616e-05 | 0.15 |
| 4.6192e-05 | 0.15 |
| 4.6224e-05 | 0.15 |
| 4.6256e-05 | 0.146 |
| 4.6288e-05 | 0.146 |
| 4.632e-05 | 0.146 |
| 4.6352e-05 | 0.15 |
| 4.6384e-05 | 0.146 |
| 4.6416e-05 | 0.146 |
| 4.6448e-05 | 0.146 |
| 4.648e-05 | 0.146 |
| 4.6512e-05 | 0.146 |
| 4.6544e-05 | 0.146 |
| 4.6576e-05 | 0.146 |
| 4.6608e-05 | 0.142 |
| 4.664e-05 | 0.142 |
| 4.6672e-05 | 0.142 |
| 4.6704e-05 | 0.142 |
| 4.6736e-05 | 0.142 |
| 4.6768e-05 | 0.142 |
| 4.68e-05 | 0.146 |
| 4.6832e-05 | 0.146 |
| 4.6864e-05 | 0.142 |
| 4.6896e-05 | 0.142 |
| 4.6928e-05 | 0.146 |
| 4.696e-05 | 0.146 |
| 4.6992e-05 | 0.142 |
| 4.7024e-05 | 0.142 |
| 4.7056e-05 | 0.146 |
| 4.7088e-05 | 0.142 |
| 4.712e-05 | 0.142 |
| 4.7152e-05 | 0.142 |
| 4.7184e-05 | 0.142 |
| 4.7216e-05 | 0.142 |
| 4.7248e-05 | 0.142 |
| 4.728e-05 | 0.142 |
| 4.7312e-05 | 0.142 |
| 4.7344e-05 | 0.142 |
| 4.7376e-05 | 0.142 |
| 4.7408e-05 | 0.142 |
| 4.744e-05 | 0.142 |
| 4.7472e-05 | 0.142 |
| 4.7504e-05 | 0.142 |
| 4.7536e-05 | 0.142 |
| 4.7568e-05 | 0.142 |
| 4.76e-05 | 0.142 |
| 4.7632e-05 | 0.142 |
| 4.7664e-05 | 0.142 |
| 4.7696e-05 | 0.142 |
| 4.7728e-05 | 0.142 |
| 4.776e-05 | 0.142 |
| 4.7792e-05 | 0.142 |
| 4.7824e-05 | 0.142 |
| 4.7856e-05 | 0.142 |
| 4.7888e-05 | 0.142 |
| 4.792e-05 | 0.142 |
| 4.7952e-05 | 0.142 |
| 4.7984e-05 | 0.142 |
| 4.8016e-05 | 0.142 |
| 4.8048e-05 | 0.142 |
| 4.808e-05 | 0.142 |
| 4.8112e-05 | 0.142 |
| 4.8144e-05 | 0.142 |
| 4.8176e-05 | 0.146 |
| 4.8208e-05 | 0.146 |
| 4.824e-05 | 0.142 |
| 4.8272e-05 | 0.142 |
| 4.8304e-05 | 0.142 |
| 4.8336e-05 | 0.142 |
| 4.8368e-05 | 0.142 |
| 4.84e-05 | 0.142 |
| 4.8432e-05 | 0.142 |
| 4.8464e-05 | 0.142 |
| 4.8496e-05 | 0.142 |
| 4.8528e-05 | 0.142 |
| 4.856e-05 | 0.142 |
| 4.8592e-05 | 0.142 |
| 4.8624e-05 | 0.142 |
| 4.8656e-05 | 0.142 |
| 4.8688e-05 | 0.142 |
| 4.872e-05 | 0.142 |
| 4.8752e-05 | 0.142 |
| 4.8784e-05 | 0.142 |
| 4.8816e-05 | 0.142 |
| 4.8848e-05 | 0.142 |
| 4.888e-05 | 0.142 |
| 4.8912e-05 | 0.142 |
| 4.8944e-05 | 0.142 |
| 4.8976e-05 | 0.142 |
| 4.9008e-05 | 0.142 |
| 4.904e-05 | 0.142 |
| 4.9072e-05 | 0.146 |
| 4.9104e-05 | 0.142 |
| 4.9136e-05 | 0.146 |
| 4.9168e-05 | 0.146 |
| 4.92e-05 | 0.142 |
| 4.9232e-05 | 0.146 |
| 4.9264e-05 | 0.146 |
| 4.9296e-05 | 0.146 |
| 4.9328e-05 | 0.146 |
| 4.936e-05 | 0.146 |
| 4.9392e-05 | 0.146 |
| 4.9424e-05 | 0.146 |
| 4.9456e-05 | 0.146 |
| 4.9488e-05 | 0.15 |
| 4.952e-05 | 0.146 |
| 4.9552e-05 | 0.146 |
| 4.9584e-05 | 0.146 |
| 4.9616e-05 | 0.142 |
| 4.9648e-05 | 0.146 |
| 4.968e-05 | 0.142 |
| 4.9712e-05 | 0.142 |
| 4.9744e-05 | 0.142 |
| 4.9776e-05 | 0.142 |
| 4.9808e-05 | 0.142 |
| 4.984e-05 | 0.142 |
| 4.9872e-05 | 0.142 |
| 4.9904e-05 | 0.142 |
| 4.9936e-05 | 0.142 |
| 4.9968e-05 | 0.142 |
| 5e-05 | 0.142 |
| 5.0032e-05 | 0.142 |
| 5.0064e-05 | 0.142 |
| 5.0096e-05 | 0.142 |
| 5.0128e-05 | 0.142 |
| 5.016e-05 | 0.138 |
| 5.0192e-05 | 0.138 |
| 5.0224e-05 | 0.138 |
| 5.0256e-05 | 0.138 |
| 5.0288e-05 | 0.142 |
| 5.032e-05 | 0.138 |
| 5.0352e-05 | 0.138 |
| 5.0384e-05 | 0.138 |
| 5.0416e-05 | 0.138 |
| 5.0448e-05 | 0.138 |
| 5.048e-05 | 0.138 |
| 5.0512e-05 | 0.134 |
| 5.0544e-05 | 0.138 |
| 5.0576e-05 | 0.134 |
| 5.0608e-05 | 0.134 |
| 5.064e-05 | 0.134 |
| 5.0672e-05 | 0.134 |
| 5.0704e-05 | 0.134 |
| 5.0736e-05 | 0.134 |
| 5.0768e-05 | 0.134 |
| 5.08e-05 | 0.134 |
| 5.0832e-05 | 0.138 |
| 5.0864e-05 | 0.138 |
| 5.0896e-05 | 0.134 |
| 5.0928e-05 | 0.138 |
| 5.096e-05 | 0.138 |
| 5.0992e-05 | 0.138 |
| 5.1024e-05 | 0.138 |
| 5.1056e-05 | 0.138 |
| 5.1088e-05 | 0.138 |
| 5.112e-05 | 0.142 |
| 5.1152e-05 | 0.142 |
| 5.1184e-05 | 0.142 |
| 5.1216e-05 | 0.142 |
| 5.1248e-05 | 0.142 |
| 5.128e-05 | 0.142 |
| 5.1312e-05 | 0.142 |
| 5.1344e-05 | 0.142 |
| 5.1376e-05 | 0.146 |
| 5.1408e-05 | 0.142 |
| 5.144e-05 | 0.142 |
| 5.1472e-05 | 0.146 |
| 5.1504e-05 | 0.142 |
| 5.1536e-05 | 0.146 |
| 5.1568e-05 | 0.146 |
| 5.16e-05 | 0.146 |
| 5.1632e-05 | 0.146 |
| 5.1664e-05 | 0.146 |
| 5.1696e-05 | 0.146 |
| 5.1728e-05 | 0.146 |
| 5.176e-05 | 0.146 |
| 5.1792e-05 | 0.142 |
| 5.1824e-05 | 0.146 |
| 5.1856e-05 | 0.146 |
| 5.1888e-05 | 0.146 |
| 5.192e-05 | 0.142 |
| 5.1952e-05 | 0.146 |
| 5.1984e-05 | 0.142 |
| 5.2016e-05 | 0.142 |
| 5.2048e-05 | 0.142 |
| 5.208e-05 | 0.142 |
| 5.2112e-05 | 0.142 |
| 5.2144e-05 | 0.146 |
| 5.2176e-05 | 0.146 |
| 5.2208e-05 | 0.142 |
| 5.224e-05 | 0.146 |
| 5.2272e-05 | 0.142 |
| 5.2304e-05 | 0.146 |
| 5.2336e-05 | 0.146 |
| 5.2368e-05 | 0.142 |
| 5.24e-05 | 0.146 |
| 5.2432e-05 | 0.142 |
| 5.2464e-05 | 0.146 |
| 5.2496e-05 | 0.142 |
| 5.2528e-05 | 0.142 |
| 5.256e-05 | 0.142 |
| 5.2592e-05 | 0.142 |
| 5.2624e-05 | 0.142 |
| 5.2656e-05 | 0.146 |
| 5.2688e-05 | 0.142 |
| 5.272e-05 | 0.146 |
| 5.2752e-05 | 0.146 |
| 5.2784e-05 | 0.142 |
| 5.2816e-05 | 0.142 |
| 5.2848e-05 | 0.142 |
| 5.288e-05 | 0.142 |
| 5.2912e-05 | 0.146 |
| 5.2944e-05 | 0.146 |
| 5.2976e-05 | 0.146 |
| 5.3008e-05 | 0.146 |
| 5.304e-05 | 0.142 |
| 5.3072e-05 | 0.146 |
| 5.3104e-05 | 0.146 |
| 5.3136e-05 | 0.146 |
| 5.3168e-05 | 0.146 |
| 5.32e-05 | 0.146 |
| 5.3232e-05 | 0.146 |
| 5.3264e-05 | 0.15 |
| 5.3296e-05 | 0.15 |
| 5.3328e-05 | 0.146 |
| 5.336e-05 | 0.15 |
| 5.3392e-05 | 0.15 |
| 5.3424e-05 | 0.15 |
| 5.3456e-05 | 0.15 |
| 5.3488e-05 | 0.15 |
| 5.352e-05 | 0.15 |
| 5.3552e-05 | 0.15 |
| 5.3584e-05 | 0.15 |
| 5.3616e-05 | 0.15 |
| 5.3648e-05 | 0.15 |
| 5.368e-05 | 0.15 |
| 5.3712e-05 | 0.15 |
| 5.3744e-05 | 0.15 |
| 5.3776e-05 | 0.146 |
| 5.3808e-05 | 0.15 |
| 5.384e-05 | 0.146 |
| 5.3872e-05 | 0.15 |
| 5.3904e-05 | 0.15 |
| 5.3936e-05 | 0.146 |
| 5.3968e-05 | 0.15 |
| 5.4e-05 | 0.146 |
| 5.4032e-05 | 0.146 |
| 5.4064e-05 | 0.15 |
| 5.4096e-05 | 0.146 |
| 5.4128e-05 | 0.15 |
| 5.416e-05 | 0.146 |
| 5.4192e-05 | 0.15 |
| 5.4224e-05 | 0.15 |
| 5.4256e-05 | 0.15 |
| 5.4288e-05 | 0.15 |
| 5.432e-05 | 0.15 |
| 5.4352e-05 | 0.15 |
| 5.4384e-05 | 0.15 |
| 5.4416e-05 | 0.15 |
| 5.4448e-05 | 0.154 |
| 5.448e-05 | 0.154 |
| 5.4512e-05 | 0.154 |
| 5.4544e-05 | 0.15 |
| 5.4576e-05 | 0.154 |
| 5.4608e-05 | 0.154 |
| 5.464e-05 | 0.154 |
| 5.4672e-05 | 0.154 |
| 5.4704e-05 | 0.154 |
| 5.4736e-05 | 0.15 |
| 5.4768e-05 | 0.154 |
| 5.48e-05 | 0.154 |
| 5.4832e-05 | 0.154 |
| 5.4864e-05 | 0.154 |
| 5.4896e-05 | 0.154 |
| 5.4928e-05 | 0.154 |
| 5.496e-05 | 0.154 |
| 5.4992e-05 | 0.154 |
| 5.5024e-05 | 0.154 |
| 5.5056e-05 | 0.154 |
| 5.5088e-05 | 0.154 |
| 5.512e-05 | 0.154 |
| 5.5152e-05 | 0.154 |
| 5.5184e-05 | 0.154 |
| 5.5216e-05 | 0.154 |
| 5.5248e-05 | 0.158 |
| 5.528e-05 | 0.158 |
| 5.5312e-05 | 0.154 |
| 5.5344e-05 | 0.158 |
| 5.5376e-05 | 0.158 |
| 5.5408e-05 | 0.158 |
| 5.544e-05 | 0.158 |
| 5.5472e-05 | 0.158 |
| 5.5504e-05 | 0.158 |
| 5.5536e-05 | 0.158 |
| 5.5568e-05 | 0.162 |
| 5.56e-05 | 0.162 |
| 5.5632e-05 | 0.162 |
| 5.5664e-05 | 0.162 |
| 5.5696e-05 | 0.162 |
| 5.5728e-05 | 0.158 |
| 5.576e-05 | 0.162 |
| 5.5792e-05 | 0.158 |
| 5.5824e-05 | 0.162 |
| 5.5856e-05 | 0.158 |
| 5.5888e-05 | 0.162 |
| 5.592e-05 | 0.162 |
| 5.5952e-05 | 0.158 |
| 5.5984e-05 | 0.158 |
| 5.6016e-05 | 0.158 |
| 5.6048e-05 | 0.162 |
| 5.608e-05 | 0.154 |
| 5.6112e-05 | 0.158 |
| 5.6144e-05 | 0.158 |
| 5.6176e-05 | 0.158 |
| 5.6208e-05 | 0.158 |
| 5.624e-05 | 0.158 |
| 5.6272e-05 | 0.158 |
| 5.6304e-05 | 0.158 |
| 5.6336e-05 | 0.158 |
| 5.6368e-05 | 0.158 |
| 5.64e-05 | 0.158 |
| 5.6432e-05 | 0.158 |
| 5.6464e-05 | 0.158 |
| 5.6496e-05 | 0.158 |
| 5.6528e-05 | 0.158 |
| 5.656e-05 | 0.158 |
| 5.6592e-05 | 0.158 |
| 5.6624e-05 | 0.158 |
| 5.6656e-05 | 0.158 |
| 5.6688e-05 | 0.158 |
| 5.672e-05 | 0.158 |
| 5.6752e-05 | 0.158 |
| 5.6784e-05 | 0.158 |
| 5.6816e-05 | 0.158 |
| 5.6848e-05 | 0.158 |
| 5.688e-05 | 0.158 |
| 5.6912e-05 | 0.162 |
| 5.6944e-05 | 0.158 |
| 5.6976e-05 | 0.158 |
| 5.7008e-05 | 0.158 |
| 5.704e-05 | 0.158 |
| 5.7072e-05 | 0.158 |
| 5.7104e-05 | 0.158 |
| 5.7136e-05 | 0.158 |
| 5.7168e-05 | 0.158 |
| 5.72e-05 | 0.162 |
| 5.7232e-05 | 0.162 |
| 5.7264e-05 | 0.158 |
| 5.7296e-05 | 0.158 |
| 5.7328e-05 | 0.158 |
| 5.736e-05 | 0.162 |
| 5.7392e-05 | 0.162 |
| 5.7424e-05 | 0.162 |
| 5.7456e-05 | 0.162 |
| 5.7488e-05 | 0.162 |
| 5.752e-05 | 0.162 |
| 5.7552e-05 | 0.162 |
| 5.7584e-05 | 0.162 |
| 5.7616e-05 | 0.162 |
| 5.7648e-05 | 0.162 |
| 5.768e-05 | 0.162 |
| 5.7712e-05 | 0.162 |
| 5.7744e-05 | 0.162 |
| 5.7776e-05 | 0.162 |
| 5.7808e-05 | 0.162 |
| 5.784e-05 | 0.158 |
| 5.7872e-05 | 0.158 |
| 5.7904e-05 | 0.162 |
| 5.7936e-05 | 0.162 |
| 5.7968e-05 | 0.158 |
| 5.8e-05 | 0.158 |
| 5.8032e-05 | 0.158 |
| 5.8064e-05 | 0.158 |
| 5.8096e-05 | 0.158 |
| 5.8128e-05 | 0.158 |
| 5.816e-05 | 0.154 |
| 5.8192e-05 | 0.154 |
| 5.8224e-05 | 0.158 |
| 5.8256e-05 | 0.154 |
| 5.8288e-05 | 0.158 |
| 5.832e-05 | 0.154 |
| 5.8352e-05 | 0.154 |
| 5.8384e-05 | 0.15 |
| 5.8416e-05 | 0.154 |
| 5.8448e-05 | 0.154 |
| 5.848e-05 | 0.154 |
| 5.8512e-05 | 0.154 |
| 5.8544e-05 | 0.154 |
| 5.8576e-05 | 0.154 |
| 5.8608e-05 | 0.158 |
| 5.864e-05 | 0.154 |
| 5.8672e-05 | 0.154 |
| 5.8704e-05 | 0.158 |
| 5.8736e-05 | 0.158 |
| 5.8768e-05 | 0.158 |
| 5.88e-05 | 0.158 |
| 5.8832e-05 | 0.158 |
| 5.8864e-05 | 0.158 |
| 5.8896e-05 | 0.162 |
| 5.8928e-05 | 0.158 |
| 5.896e-05 | 0.158 |
| 5.8992e-05 | 0.158 |
| 5.9024e-05 | 0.158 |
| 5.9056e-05 | 0.158 |
| 5.9088e-05 | 0.158 |
| 5.912e-05 | 0.158 |
| 5.9152e-05 | 0.158 |
| 5.9184e-05 | 0.158 |
| 5.9216e-05 | 0.158 |
| 5.9248e-05 | 0.158 |
| 5.928e-05 | 0.158 |
| 5.9312e-05 | 0.158 |
| 5.9344e-05 | 0.158 |
| 5.9376e-05 | 0.162 |
| 5.9408e-05 | 0.162 |
| 5.944e-05 | 0.162 |
| 5.9472e-05 | 0.162 |
| 5.9504e-05 | 0.162 |
| 5.9536e-05 | 0.162 |
| 5.9568e-05 | 0.166 |
| 5.96e-05 | 0.166 |
| 5.9632e-05 | 0.166 |
| 5.9664e-05 | 0.166 |
| 5.9696e-05 | 0.166 |
| 5.9728e-05 | 0.166 |
| 5.976e-05 | 0.166 |
| 5.9792e-05 | 0.166 |
| 5.9824e-05 | 0.17 |
| 5.9856e-05 | 0.17 |
| 5.9888e-05 | 0.166 |
| 5.992e-05 | 0.17 |
| 5.9952e-05 | 0.17 |
| 5.9984e-05 | 0.17 |
| 6.0016e-05 | 0.17 |
| 6.0048e-05 | 0.17 |
| 6.008e-05 | 0.174 |
| 6.0112e-05 | 0.174 |
| 6.0144e-05 | 0.174 |
| 6.0176e-05 | 0.17 |
| 6.0208e-05 | 0.174 |
| 6.024e-05 | 0.17 |
| 6.0272e-05 | 0.17 |
| 6.0304e-05 | 0.17 |
| 6.0336e-05 | 0.17 |
| 6.0368e-05 | 0.174 |
| 6.04e-05 | 0.174 |
| 6.0432e-05 | 0.174 |
| 6.0464e-05 | 0.174 |
| 6.0496e-05 | 0.174 |
| 6.0528e-05 | 0.174 |
| 6.056e-05 | 0.174 |
| 6.0592e-05 | 0.174 |
| 6.0624e-05 | 0.178 |
| 6.0656e-05 | 0.178 |
| 6.0688e-05 | 0.178 |
| 6.072e-05 | 0.182 |
| 6.0752e-05 | 0.182 |
| 6.0784e-05 | 0.178 |
| 6.0816e-05 | 0.182 |
| 6.0848e-05 | 0.182 |
| 6.088e-05 | 0.182 |
| 6.0912e-05 | 0.182 |
| 6.0944e-05 | 0.182 |
| 6.0976e-05 | 0.182 |
| 6.1008e-05 | 0.182 |
| 6.104e-05 | 0.182 |
| 6.1072e-05 | 0.182 |
| 6.1104e-05 | 0.182 |
| 6.1136e-05 | 0.182 |
| 6.1168e-05 | 0.182 |
| 6.12e-05 | 0.186 |
| 6.1232e-05 | 0.186 |
| 6.1264e-05 | 0.186 |
| 6.1296e-05 | 0.186 |
| 6.1328e-05 | 0.186 |
| 6.136e-05 | 0.186 |
| 6.1392e-05 | 0.186 |
| 6.1424e-05 | 0.186 |
| 6.1456e-05 | 0.186 |
| 6.1488e-05 | 0.186 |
| 6.152e-05 | 0.186 |
| 6.1552e-05 | 0.182 |
| 6.1584e-05 | 0.186 |
| 6.1616e-05 | 0.19 |
| 6.1648e-05 | 0.186 |
| 6.168e-05 | 0.186 |
| 6.1712e-05 | 0.186 |
| 6.1744e-05 | 0.186 |
| 6.1776e-05 | 0.186 |
| 6.1808e-05 | 0.186 |
| 6.184e-05 | 0.186 |
| 6.1872e-05 | 0.186 |
| 6.1904e-05 | 0.186 |
| 6.1936e-05 | 0.19 |
| 6.1968e-05 | 0.186 |
| 6.2e-05 | 0.19 |
| 6.2032e-05 | 0.19 |
| 6.2064e-05 | 0.19 |
| 6.2096e-05 | 0.19 |
| 6.2128e-05 | 0.19 |
| 6.216e-05 | 0.194 |
| 6.2192e-05 | 0.19 |
| 6.2224e-05 | 0.194 |
| 6.2256e-05 | 0.194 |
| 6.2288e-05 | 0.194 |
| 6.232e-05 | 0.194 |
| 6.2352e-05 | 0.194 |
| 6.2384e-05 | 0.194 |
| 6.2416e-05 | 0.198 |
| 6.2448e-05 | 0.198 |
| 6.248e-05 | 0.194 |
| 6.2512e-05 | 0.198 |
| 6.2544e-05 | 0.198 |
| 6.2576e-05 | 0.198 |
| 6.2608e-05 | 0.202 |
| 6.264e-05 | 0.198 |
| 6.2672e-05 | 0.198 |
| 6.2704e-05 | 0.202 |
| 6.2736e-05 | 0.202 |
| 6.2768e-05 | 0.202 |
| 6.28e-05 | 0.202 |
| 6.2832e-05 | 0.202 |
| 6.2864e-05 | 0.202 |
| 6.2896e-05 | 0.202 |
| 6.2928e-05 | 0.202 |
| 6.296e-05 | 0.206 |
| 6.2992e-05 | 0.202 |
| 6.3024e-05 | 0.206 |
| 6.3056e-05 | 0.206 |
| 6.3088e-05 | 0.206 |
| 6.312e-05 | 0.206 |
| 6.3152e-05 | 0.206 |
| 6.3184e-05 | 0.206 |
| 6.3216e-05 | 0.21 |
| 6.3248e-05 | 0.21 |
| 6.328e-05 | 0.21 |
| 6.3312e-05 | 0.214 |
| 6.3344e-05 | 0.214 |
| 6.3376e-05 | 0.214 |
| 6.3408e-05 | 0.214 |
| 6.344e-05 | 0.218 |
| 6.3472e-05 | 0.214 |
| 6.3504e-05 | 0.214 |
| 6.3536e-05 | 0.214 |
| 6.3568e-05 | 0.214 |
| 6.36e-05 | 0.218 |
| 6.3632e-05 | 0.214 |
| 6.3664e-05 | 0.218 |
| 6.3696e-05 | 0.218 |
| 6.3728e-05 | 0.214 |
| 6.376e-05 | 0.214 |
| 6.3792e-05 | 0.218 |
| 6.3824e-05 | 0.218 |
| 6.3856e-05 | 0.218 |
| 6.3888e-05 | 0.214 |
| 6.392e-05 | 0.218 |
| 6.3952e-05 | 0.214 |
| 6.3984e-05 | 0.214 |
| 6.4016e-05 | 0.214 |
| 6.4048e-05 | 0.214 |
| 6.408e-05 | 0.214 |
| 6.4112e-05 | 0.214 |
| 6.4144e-05 | 0.214 |
| 6.4176e-05 | 0.214 |
| 6.4208e-05 | 0.214 |
| 6.424e-05 | 0.214 |
| 6.4272e-05 | 0.214 |
| 6.4304e-05 | 0.214 |
| 6.4336e-05 | 0.21 |
| 6.4368e-05 | 0.21 |
| 6.44e-05 | 0.21 |
| 6.4432e-05 | 0.21 |
| 6.4464e-05 | 0.21 |
| 6.4496e-05 | 0.21 |
| 6.4528e-05 | 0.21 |
| 6.456e-05 | 0.21 |
| 6.4592e-05 | 0.21 |
| 6.4624e-05 | 0.206 |
| 6.4656e-05 | 0.206 |
| 6.4688e-05 | 0.21 |
| 6.472e-05 | 0.206 |
| 6.4752e-05 | 0.206 |
| 6.4784e-05 | 0.206 |
| 6.4816e-05 | 0.206 |
| 6.4848e-05 | 0.206 |
| 6.488e-05 | 0.206 |
| 6.4912e-05 | 0.202 |
| 6.4944e-05 | 0.202 |
| 6.4976e-05 | 0.202 |
| 6.5008e-05 | 0.202 |
| 6.504e-05 | 0.202 |
| 6.5072e-05 | 0.206 |
| 6.5104e-05 | 0.206 |
| 6.5136e-05 | 0.206 |
| 6.5168e-05 | 0.206 |
| 6.52e-05 | 0.206 |
| 6.5232e-05 | 0.206 |
| 6.5264e-05 | 0.206 |
| 6.5296e-05 | 0.206 |
| 6.5328e-05 | 0.21 |
| 6.536e-05 | 0.206 |
| 6.5392e-05 | 0.21 |
| 6.5424e-05 | 0.21 |
| 6.5456e-05 | 0.21 |
| 6.5488e-05 | 0.21 |
| 6.552e-05 | 0.21 |
| 6.5552e-05 | 0.21 |
| 6.5584e-05 | 0.21 |
| 6.5616e-05 | 0.214 |
| 6.5648e-05 | 0.214 |
| 6.568e-05 | 0.214 |
| 6.5712e-05 | 0.214 |
| 6.5744e-05 | 0.214 |
| 6.5776e-05 | 0.214 |
| 6.5808e-05 | 0.214 |
| 6.584e-05 | 0.214 |
| 6.5872e-05 | 0.214 |
| 6.5904e-05 | 0.214 |
| 6.5936e-05 | 0.214 |
| 6.5968e-05 | 0.214 |
| 6.6e-05 | 0.214 |
| 6.6032e-05 | 0.218 |
| 6.6064e-05 | 0.218 |
| 6.6096e-05 | 0.218 |
| 6.6128e-05 | 0.218 |
| 6.616e-05 | 0.218 |
| 6.6192e-05 | 0.222 |
| 6.6224e-05 | 0.222 |
| 6.6256e-05 | 0.222 |
| 6.6288e-05 | 0.222 |
| 6.632e-05 | 0.226 |
| 6.6352e-05 | 0.222 |
| 6.6384e-05 | 0.226 |
| 6.6416e-05 | 0.222 |
| 6.6448e-05 | 0.226 |
| 6.648e-05 | 0.226 |
| 6.6512e-05 | 0.226 |
| 6.6544e-05 | 0.226 |
| 6.6576e-05 | 0.226 |
| 6.6608e-05 | 0.226 |
| 6.664e-05 | 0.226 |
| 6.6672e-05 | 0.23 |
| 6.6704e-05 | 0.226 |
| 6.6736e-05 | 0.23 |
| 6.6768e-05 | 0.226 |
| 6.68e-05 | 0.226 |
| 6.6832e-05 | 0.226 |
| 6.6864e-05 | 0.226 |
| 6.6896e-05 | 0.226 |
| 6.6928e-05 | 0.226 |
| 6.696e-05 | 0.226 |
| 6.6992e-05 | 0.226 |
| 6.7024e-05 | 0.23 |
| 6.7056e-05 | 0.226 |
| 6.7088e-05 | 0.23 |
| 6.712e-05 | 0.226 |
| 6.7152e-05 | 0.226 |
| 6.7184e-05 | 0.226 |
| 6.7216e-05 | 0.226 |
| 6.7248e-05 | 0.23 |
| 6.728e-05 | 0.226 |
| 6.7312e-05 | 0.226 |
| 6.7344e-05 | 0.226 |
| 6.7376e-05 | 0.23 |
| 6.7408e-05 | 0.226 |
| 6.744e-05 | 0.226 |
| 6.7472e-05 | 0.226 |
| 6.7504e-05 | 0.226 |
| 6.7536e-05 | 0.226 |
| 6.7568e-05 | 0.226 |
| 6.76e-05 | 0.23 |
| 6.7632e-05 | 0.226 |
| 6.7664e-05 | 0.226 |
| 6.7696e-05 | 0.226 |
| 6.7728e-05 | 0.226 |
| 6.776e-05 | 0.226 |
| 6.7792e-05 | 0.226 |
| 6.7824e-05 | 0.23 |
| 6.7856e-05 | 0.226 |
| 6.7888e-05 | 0.23 |
| 6.792e-05 | 0.226 |
| 6.7952e-05 | 0.23 |
| 6.7984e-05 | 0.23 |
| 6.8016e-05 | 0.23 |
| 6.8048e-05 | 0.226 |
| 6.808e-05 | 0.23 |
| 6.8112e-05 | 0.226 |
| 6.8144e-05 | 0.226 |
| 6.8176e-05 | 0.23 |
| 6.8208e-05 | 0.226 |
| 6.824e-05 | 0.226 |
| 6.8272e-05 | 0.226 |
| 6.8304e-05 | 0.226 |
| 6.8336e-05 | 0.226 |
| 6.8368e-05 | 0.226 |
| 6.84e-05 | 0.23 |
| 6.8432e-05 | 0.226 |
| 6.8464e-05 | 0.226 |
| 6.8496e-05 | 0.226 |
| 6.8528e-05 | 0.226 |
| 6.856e-05 | 0.226 |
| 6.8592e-05 | 0.226 |
| 6.8624e-05 | 0.23 |
| 6.8656e-05 | 0.226 |
| 6.8688e-05 | 0.23 |
| 6.872e-05 | 0.23 |
| 6.8752e-05 | 0.23 |
| 6.8784e-05 | 0.234 |
| 6.8816e-05 | 0.23 |
| 6.8848e-05 | 0.23 |
| 6.888e-05 | 0.234 |
| 6.8912e-05 | 0.238 |
| 6.8944e-05 | 0.234 |
| 6.8976e-05 | 0.234 |
| 6.9008e-05 | 0.238 |
| 6.904e-05 | 0.238 |
| 6.9072e-05 | 0.238 |
| 6.9104e-05 | 0.238 |
| 6.9136e-05 | 0.242 |
| 6.9168e-05 | 0.242 |
| 6.92e-05 | 0.242 |
| 6.9232e-05 | 0.242 |
| 6.9264e-05 | 0.242 |
| 6.9296e-05 | 0.242 |
| 6.9328e-05 | 0.242 |
| 6.936e-05 | 0.242 |
| 6.9392e-05 | 0.246 |
| 6.9424e-05 | 0.246 |
| 6.9456e-05 | 0.246 |
| 6.9488e-05 | 0.25 |
| 6.952e-05 | 0.25 |
| 6.9552e-05 | 0.25 |
| 6.9584e-05 | 0.25 |
| 6.9616e-05 | 0.254 |
| 6.9648e-05 | 0.254 |
| 6.968e-05 | 0.254 |
| 6.9712e-05 | 0.254 |
| 6.9744e-05 | 0.258 |
| 6.9776e-05 | 0.254 |
| 6.9808e-05 | 0.254 |
| 6.984e-05 | 0.254 |
| 6.9872e-05 | 0.258 |
| 6.9904e-05 | 0.254 |
| 6.9936e-05 | 0.258 |
| 6.9968e-05 | 0.258 |
| 7e-05 | 0.262 |
| 7.0032e-05 | 0.258 |
| 7.0064e-05 | 0.258 |
| 7.0096e-05 | 0.262 |
| 7.0128e-05 | 0.262 |
| 7.016e-05 | 0.258 |
| 7.0192e-05 | 0.258 |
| 7.0224e-05 | 0.258 |
| 7.0256e-05 | 0.262 |
| 7.0288e-05 | 0.258 |
| 7.032e-05 | 0.262 |
| 7.0352e-05 | 0.262 |
| 7.0384e-05 | 0.262 |
| 7.0416e-05 | 0.262 |
| 7.0448e-05 | 0.262 |
| 7.048e-05 | 0.258 |
| 7.0512e-05 | 0.258 |
| 7.0544e-05 | 0.262 |
| 7.0576e-05 | 0.262 |
| 7.0608e-05 | 0.262 |
| 7.064e-05 | 0.266 |
| 7.0672e-05 | 0.262 |
| 7.0704e-05 | 0.262 |
| 7.0736e-05 | 0.262 |
| 7.0768e-05 | 0.266 |
| 7.08e-05 | 0.262 |
| 7.0832e-05 | 0.266 |
| 7.0864e-05 | 0.266 |
| 7.0896e-05 | 0.262 |
| 7.0928e-05 | 0.266 |
| 7.096e-05 | 0.266 |
| 7.0992e-05 | 0.266 |
| 7.1024e-05 | 0.266 |
| 7.1056e-05 | 0.266 |
| 7.1088e-05 | 0.266 |
| 7.112e-05 | 0.266 |
| 7.1152e-05 | 0.27 |
| 7.1184e-05 | 0.266 |
| 7.1216e-05 | 0.266 |
| 7.1248e-05 | 0.266 |
| 7.128e-05 | 0.266 |
| 7.1312e-05 | 0.266 |
| 7.1344e-05 | 0.266 |
| 7.1376e-05 | 0.266 |
| 7.1408e-05 | 0.266 |
| 7.144e-05 | 0.266 |
| 7.1472e-05 | 0.266 |
| 7.1504e-05 | 0.266 |
| 7.1536e-05 | 0.266 |
| 7.1568e-05 | 0.266 |
| 7.16e-05 | 0.27 |
| 7.1632e-05 | 0.266 |
| 7.1664e-05 | 0.27 |
| 7.1696e-05 | 0.27 |
| 7.1728e-05 | 0.27 |
| 7.176e-05 | 0.27 |
| 7.1792e-05 | 0.266 |
| 7.1824e-05 | 0.266 |
| 7.1856e-05 | 0.27 |
| 7.1888e-05 | 0.266 |
| 7.192e-05 | 0.266 |
| 7.1952e-05 | 0.27 |
| 7.1984e-05 | 0.266 |
| 7.2016e-05 | 0.27 |
| 7.2048e-05 | 0.266 |
| 7.208e-05 | 0.266 |
| 7.2112e-05 | 0.27 |
| 7.2144e-05 | 0.27 |
| 7.2176e-05 | 0.27 |
| 7.2208e-05 | 0.27 |
| 7.224e-05 | 0.27 |
| 7.2272e-05 | 0.27 |
| 7.2304e-05 | 0.27 |
| 7.2336e-05 | 0.27 |
| 7.2368e-05 | 0.27 |
| 7.24e-05 | 0.27 |
| 7.2432e-05 | 0.27 |
| 7.2464e-05 | 0.266 |
| 7.2496e-05 | 0.27 |
| 7.2528e-05 | 0.27 |
| 7.256e-05 | 0.27 |
| 7.2592e-05 | 0.266 |
| 7.2624e-05 | 0.266 |
| 7.2656e-05 | 0.27 |
| 7.2688e-05 | 0.266 |
| 7.272e-05 | 0.266 |
| 7.2752e-05 | 0.266 |
| 7.2784e-05 | 0.266 |
| 7.2816e-05 | 0.266 |
| 7.2848e-05 | 0.266 |
| 7.288e-05 | 0.27 |
| 7.2912e-05 | 0.266 |
| 7.2944e-05 | 0.266 |
| 7.2976e-05 | 0.266 |
| 7.3008e-05 | 0.266 |
| 7.304e-05 | 0.266 |
| 7.3072e-05 | 0.266 |
| 7.3104e-05 | 0.266 |
| 7.3136e-05 | 0.266 |
| 7.3168e-05 | 0.266 |
| 7.32e-05 | 0.266 |
| 7.3232e-05 | 0.266 |
| 7.3264e-05 | 0.266 |
| 7.3296e-05 | 0.27 |
| 7.3328e-05 | 0.266 |
| 7.336e-05 | 0.266 |
| 7.3392e-05 | 0.266 |
| 7.3424e-05 | 0.266 |
| 7.3456e-05 | 0.266 |
| 7.3488e-05 | 0.266 |
| 7.352e-05 | 0.266 |
| 7.3552e-05 | 0.266 |
| 7.3584e-05 | 0.266 |
| 7.3616e-05 | 0.27 |
| 7.3648e-05 | 0.266 |
| 7.368e-05 | 0.266 |
| 7.3712e-05 | 0.266 |
| 7.3744e-05 | 0.266 |
| 7.3776e-05 | 0.266 |
| 7.3808e-05 | 0.27 |
| 7.384e-05 | 0.266 |
| 7.3872e-05 | 0.27 |
| 7.3904e-05 | 0.266 |
| 7.3936e-05 | 0.266 |
| 7.3968e-05 | 0.27 |
| 7.4e-05 | 0.27 |
| 7.4032e-05 | 0.27 |
| 7.4064e-05 | 0.274 |
| 7.4096e-05 | 0.27 |
| 7.4128e-05 | 0.274 |
| 7.416e-05 | 0.27 |
| 7.4192e-05 | 0.274 |
| 7.4224e-05 | 0.274 |
| 7.4256e-05 | 0.278 |
| 7.4288e-05 | 0.278 |
| 7.432e-05 | 0.278 |
| 7.4352e-05 | 0.278 |
| 7.4384e-05 | 0.278 |
| 7.4416e-05 | 0.278 |
| 7.4448e-05 | 0.274 |
| 7.448e-05 | 0.278 |
| 7.4512e-05 | 0.278 |
| 7.4544e-05 | 0.278 |
| 7.4576e-05 | 0.282 |
| 7.4608e-05 | 0.282 |
| 7.464e-05 | 0.282 |
| 7.4672e-05 | 0.282 |
| 7.4704e-05 | 0.282 |
| 7.4736e-05 | 0.278 |
| 7.4768e-05 | 0.282 |
| 7.48e-05 | 0.282 |
| 7.4832e-05 | 0.282 |
| 7.4864e-05 | 0.278 |
| 7.4896e-05 | 0.282 |
| 7.4928e-05 | 0.282 |
| 7.496e-05 | 0.282 |
| 7.4992e-05 | 0.282 |
| 7.5024e-05 | 0.282 |
| 7.5056e-05 | 0.282 |
| 7.5088e-05 | 0.282 |
| 7.512e-05 | 0.282 |
| 7.5152e-05 | 0.278 |
| 7.5184e-05 | 0.282 |
| 7.5216e-05 | 0.282 |
| 7.5248e-05 | 0.278 |
| 7.528e-05 | 0.282 |
| 7.5312e-05 | 0.278 |
| 7.5344e-05 | 0.278 |
| 7.5376e-05 | 0.278 |
| 7.5408e-05 | 0.278 |
| 7.544e-05 | 0.278 |
| 7.5472e-05 | 0.278 |
| 7.5504e-05 | 0.278 |
| 7.5536e-05 | 0.274 |
| 7.5568e-05 | 0.278 |
| 7.56e-05 | 0.274 |
| 7.5632e-05 | 0.278 |
| 7.5664e-05 | 0.274 |
| 7.5696e-05 | 0.274 |
| 7.5728e-05 | 0.274 |
| 7.576e-05 | 0.274 |
| 7.5792e-05 | 0.274 |
| 7.5824e-05 | 0.274 |
| 7.5856e-05 | 0.274 |
| 7.5888e-05 | 0.274 |
| 7.592e-05 | 0.274 |
| 7.5952e-05 | 0.274 |
| 7.5984e-05 | 0.274 |
| 7.6016e-05 | 0.274 |
| 7.6048e-05 | 0.278 |
| 7.608e-05 | 0.278 |
| 7.6112e-05 | 0.278 |
| 7.6144e-05 | 0.278 |
| 7.6176e-05 | 0.278 |
| 7.6208e-05 | 0.278 |
| 7.624e-05 | 0.278 |
| 7.6272e-05 | 0.278 |
| 7.6304e-05 | 0.278 |
| 7.6336e-05 | 0.278 |
| 7.6368e-05 | 0.278 |
| 7.64e-05 | 0.278 |
| 7.6432e-05 | 0.278 |
| 7.6464e-05 | 0.278 |
| 7.6496e-05 | 0.278 |
| 7.6528e-05 | 0.274 |
| 7.656e-05 | 0.274 |
| 7.6592e-05 | 0.278 |
| 7.6624e-05 | 0.278 |
| 7.6656e-05 | 0.278 |
| 7.6688e-05 | 0.278 |
| 7.672e-05 | 0.278 |
| 7.6752e-05 | 0.278 |
| 7.6784e-05 | 0.278 |
| 7.6816e-05 | 0.278 |
| 7.6848e-05 | 0.278 |
| 7.688e-05 | 0.278 |
| 7.6912e-05 | 0.278 |
| 7.6944e-05 | 0.278 |
| 7.6976e-05 | 0.278 |
| 7.7008e-05 | 0.282 |
| 7.704e-05 | 0.278 |
| 7.7072e-05 | 0.278 |
| 7.7104e-05 | 0.282 |
| 7.7136e-05 | 0.282 |
| 7.7168e-05 | 0.282 |
| 7.72e-05 | 0.282 |
| 7.7232e-05 | 0.282 |
| 7.7264e-05 | 0.282 |
| 7.7296e-05 | 0.282 |
| 7.7328e-05 | 0.282 |
| 7.736e-05 | 0.282 |
| 7.7392e-05 | 0.282 |
| 7.7424e-05 | 0.282 |
| 7.7456e-05 | 0.282 |
| 7.7488e-05 | 0.282 |
| 7.752e-05 | 0.282 |
| 7.7552e-05 | 0.282 |
| 7.7584e-05 | 0.282 |
| 7.7616e-05 | 0.282 |
| 7.7648e-05 | 0.282 |
| 7.768e-05 | 0.282 |
| 7.7712e-05 | 0.282 |
| 7.7744e-05 | 0.282 |
| 7.7776e-05 | 0.282 |
| 7.7808e-05 | 0.282 |
| 7.784e-05 | 0.282 |
| 7.7872e-05 | 0.282 |
| 7.7904e-05 | 0.282 |
| 7.7936e-05 | 0.278 |
| 7.7968e-05 | 0.282 |
| 7.8e-05 | 0.282 |
| 7.8032e-05 | 0.278 |
| 7.8064e-05 | 0.282 |
| 7.8096e-05 | 0.282 |
| 7.8128e-05 | 0.282 |
| 7.816e-05 | 0.278 |
| 7.8192e-05 | 0.282 |
| 7.8224e-05 | 0.282 |
| 7.8256e-05 | 0.282 |
| 7.8288e-05 | 0.282 |
| 7.832e-05 | 0.282 |
| 7.8352e-05 | 0.282 |
| 7.8384e-05 | 0.278 |
| 7.8416e-05 | 0.282 |
| 7.8448e-05 | 0.282 |
| 7.848e-05 | 0.282 |
| 7.8512e-05 | 0.282 |
| 7.8544e-05 | 0.286 |
| 7.8576e-05 | 0.282 |
| 7.8608e-05 | 0.282 |
| 7.864e-05 | 0.282 |
| 7.8672e-05 | 0.282 |
| 7.8704e-05 | 0.282 |
| 7.8736e-05 | 0.282 |
| 7.8768e-05 | 0.282 |
| 7.88e-05 | 0.278 |
| 7.8832e-05 | 0.282 |
| 7.8864e-05 | 0.278 |
| 7.8896e-05 | 0.282 |
| 7.8928e-05 | 0.278 |
| 7.896e-05 | 0.282 |
| 7.8992e-05 | 0.282 |
| 7.9024e-05 | 0.282 |
| 7.9056e-05 | 0.282 |
| 7.9088e-05 | 0.286 |
| 7.912e-05 | 0.286 |
| 7.9152e-05 | 0.282 |
| 7.9184e-05 | 0.286 |
| 7.9216e-05 | 0.286 |
| 7.9248e-05 | 0.286 |
| 7.928e-05 | 0.286 |
| 7.9312e-05 | 0.286 |
| 7.9344e-05 | 0.286 |
| 7.9376e-05 | 0.286 |
| 7.9408e-05 | 0.286 |
| 7.944e-05 | 0.286 |
| 7.9472e-05 | 0.286 |
| 7.9504e-05 | 0.286 |
| 7.9536e-05 | 0.29 |
| 7.9568e-05 | 0.29 |
| 7.96e-05 | 0.29 |
| 7.9632e-05 | 0.29 |
| 7.9664e-05 | 0.29 |
| 7.9696e-05 | 0.29 |
| 7.9728e-05 | 0.294 |
| 7.976e-05 | 0.294 |
| 7.9792e-05 | 0.294 |
| 7.9824e-05 | 0.29 |
| 7.9856e-05 | 0.294 |
| 7.9888e-05 | 0.298 |
| 7.992e-05 | 0.294 |
| 7.9952e-05 | 0.294 |
| 7.9984e-05 | 0.298 |
| 8.0016e-05 | 0.298 |
| 8.0048e-05 | 0.298 |
| 8.008e-05 | 0.294 |
| 8.0112e-05 | 0.294 |
| 8.0144e-05 | 0.298 |
| 8.0176e-05 | 0.298 |
| 8.0208e-05 | 0.294 |
| 8.024e-05 | 0.298 |
| 8.0272e-05 | 0.298 |
| 8.0304e-05 | 0.298 |
| 8.0336e-05 | 0.298 |
| 8.0368e-05 | 0.298 |
| 8.04e-05 | 0.298 |
| 8.0432e-05 | 0.294 |
| 8.0464e-05 | 0.298 |
| 8.0496e-05 | 0.294 |
| 8.0528e-05 | 0.294 |
| 8.056e-05 | 0.298 |
| 8.0592e-05 | 0.294 |
| 8.0624e-05 | 0.298 |
| 8.0656e-05 | 0.294 |
| 8.0688e-05 | 0.298 |
| 8.072e-05 | 0.298 |
| 8.0752e-05 | 0.298 |
| 8.0784e-05 | 0.298 |
| 8.0816e-05 | 0.298 |
| 8.0848e-05 | 0.298 |
| 8.088e-05 | 0.298 |
| 8.0912e-05 | 0.298 |
| 8.0944e-05 | 0.302 |
| 8.0976e-05 | 0.302 |
| 8.1008e-05 | 0.302 |
| 8.104e-05 | 0.302 |
| 8.1072e-05 | 0.298 |
| 8.1104e-05 | 0.302 |
| 8.1136e-05 | 0.302 |
| 8.1168e-05 | 0.302 |
| 8.12e-05 | 0.302 |
| 8.1232e-05 | 0.302 |
| 8.1264e-05 | 0.302 |
| 8.1296e-05 | 0.302 |
| 8.1328e-05 | 0.302 |
| 8.136e-05 | 0.302 |
| 8.1392e-05 | 0.302 |
| 8.1424e-05 | 0.302 |
| 8.1456e-05 | 0.302 |
| 8.1488e-05 | 0.302 |
| 8.152e-05 | 0.302 |
| 8.1552e-05 | 0.306 |
| 8.1584e-05 | 0.306 |
| 8.1616e-05 | 0.298 |
| 8.1648e-05 | 0.302 |
| 8.168e-05 | 0.302 |
| 8.1712e-05 | 0.302 |
| 8.1744e-05 | 0.298 |
| 8.1776e-05 | 0.302 |
| 8.1808e-05 | 0.302 |
| 8.184e-05 | 0.302 |
| 8.1872e-05 | 0.302 |
| 8.1904e-05 | 0.298 |
| 8.1936e-05 | 0.298 |
| 8.1968e-05 | 0.298 |
| 8.2e-05 | 0.298 |
| 8.2032e-05 | 0.298 |
| 8.2064e-05 | 0.298 |
| 8.2096e-05 | 0.298 |
| 8.2128e-05 | 0.298 |
| 8.216e-05 | 0.298 |
| 8.2192e-05 | 0.298 |
| 8.2224e-05 | 0.298 |
| 8.2256e-05 | 0.302 |
| 8.2288e-05 | 0.298 |
| 8.232e-05 | 0.298 |
| 8.2352e-05 | 0.298 |
| 8.2384e-05 | 0.298 |
| 8.2416e-05 | 0.298 |
| 8.2448e-05 | 0.298 |
| 8.248e-05 | 0.298 |
| 8.2512e-05 | 0.298 |
| 8.2544e-05 | 0.298 |
| 8.2576e-05 | 0.298 |
| 8.2608e-05 | 0.298 |
| 8.264e-05 | 0.298 |
| 8.2672e-05 | 0.298 |
| 8.2704e-05 | 0.298 |
| 8.2736e-05 | 0.298 |
| 8.2768e-05 | 0.298 |
| 8.28e-05 | 0.298 |
| 8.2832e-05 | 0.298 |
| 8.2864e-05 | 0.298 |
| 8.2896e-05 | 0.298 |
| 8.2928e-05 | 0.298 |
| 8.296e-05 | 0.294 |
| 8.2992e-05 | 0.294 |
| 8.3024e-05 | 0.298 |
| 8.3056e-05 | 0.298 |
| 8.3088e-05 | 0.298 |
| 8.312e-05 | 0.298 |
| 8.3152e-05 | 0.298 |
| 8.3184e-05 | 0.298 |
| 8.3216e-05 | 0.298 |
| 8.3248e-05 | 0.298 |
| 8.328e-05 | 0.298 |
| 8.3312e-05 | 0.298 |
| 8.3344e-05 | 0.298 |
| 8.3376e-05 | 0.298 |
| 8.3408e-05 | 0.298 |
| 8.344e-05 | 0.298 |
| 8.3472e-05 | 0.298 |
| 8.3504e-05 | 0.298 |
| 8.3536e-05 | 0.298 |
| 8.3568e-05 | 0.298 |
| 8.36e-05 | 0.298 |
| 8.3632e-05 | 0.298 |
| 8.3664e-05 | 0.294 |
| 8.3696e-05 | 0.294 |
| 8.3728e-05 | 0.294 |
| 8.376e-05 | 0.294 |
| 8.3792e-05 | 0.29 |
| 8.3824e-05 | 0.29 |
| 8.3856e-05 | 0.294 |
| 8.3888e-05 | 0.29 |
| 8.392e-05 | 0.29 |
| 8.3952e-05 | 0.29 |
| 8.3984e-05 | 0.29 |
| 8.4016e-05 | 0.29 |
| 8.4048e-05 | 0.29 |
| 8.408e-05 | 0.29 |
| 8.4112e-05 | 0.29 |
| 8.4144e-05 | 0.29 |
| 8.4176e-05 | 0.29 |
| 8.4208e-05 | 0.29 |
| 8.424e-05 | 0.29 |
| 8.4272e-05 | 0.29 |
| 8.4304e-05 | 0.294 |
| 8.4336e-05 | 0.29 |
| 8.4368e-05 | 0.29 |
| 8.44e-05 | 0.294 |
| 8.4432e-05 | 0.29 |
| 8.4464e-05 | 0.29 |
| 8.4496e-05 | 0.29 |
| 8.4528e-05 | 0.29 |
| 8.456e-05 | 0.29 |
| 8.4592e-05 | 0.29 |
| 8.4624e-05 | 0.29 |
| 8.4656e-05 | 0.29 |
| 8.4688e-05 | 0.29 |
| 8.472e-05 | 0.29 |
| 8.4752e-05 | 0.29 |
| 8.4784e-05 | 0.29 |
| 8.4816e-05 | 0.29 |
| 8.4848e-05 | 0.29 |
| 8.488e-05 | 0.286 |
| 8.4912e-05 | 0.286 |
| 8.4944e-05 | 0.286 |
| 8.4976e-05 | 0.286 |
| 8.5008e-05 | 0.286 |
| 8.504e-05 | 0.286 |
| 8.5072e-05 | 0.282 |
| 8.5104e-05 | 0.282 |
| 8.5136e-05 | 0.282 |
| 8.5168e-05 | 0.282 |
| 8.52e-05 | 0.282 |
| 8.5232e-05 | 0.278 |
| 8.5264e-05 | 0.282 |
| 8.5296e-05 | 0.282 |
| 8.5328e-05 | 0.278 |
| 8.536e-05 | 0.282 |
| 8.5392e-05 | 0.282 |
| 8.5424e-05 | 0.278 |
| 8.5456e-05 | 0.278 |
| 8.5488e-05 | 0.282 |
| 8.552e-05 | 0.282 |
| 8.5552e-05 | 0.282 |
| 8.5584e-05 | 0.282 |
| 8.5616e-05 | 0.286 |
| 8.5648e-05 | 0.286 |
| 8.568e-05 | 0.286 |
| 8.5712e-05 | 0.282 |
| 8.5744e-05 | 0.286 |
| 8.5776e-05 | 0.286 |
| 8.5808e-05 | 0.29 |
| 8.584e-05 | 0.29 |
| 8.5872e-05 | 0.29 |
| 8.5904e-05 | 0.29 |
| 8.5936e-05 | 0.29 |
| 8.5968e-05 | 0.29 |
| 8.6e-05 | 0.29 |
| 8.6032e-05 | 0.29 |
| 8.6064e-05 | 0.294 |
| 8.6096e-05 | 0.29 |
| 8.6128e-05 | 0.294 |
| 8.616e-05 | 0.294 |
| 8.6192e-05 | 0.294 |
| 8.6224e-05 | 0.294 |
| 8.6256e-05 | 0.298 |
| 8.6288e-05 | 0.294 |
| 8.632e-05 | 0.298 |
| 8.6352e-05 | 0.294 |
| 8.6384e-05 | 0.294 |
| 8.6416e-05 | 0.298 |
| 8.6448e-05 | 0.298 |
| 8.648e-05 | 0.298 |
| 8.6512e-05 | 0.298 |
| 8.6544e-05 | 0.298 |
| 8.6576e-05 | 0.298 |
| 8.6608e-05 | 0.298 |
| 8.664e-05 | 0.298 |
| 8.6672e-05 | 0.298 |
| 8.6704e-05 | 0.294 |
| 8.6736e-05 | 0.294 |
| 8.6768e-05 | 0.294 |
| 8.68e-05 | 0.294 |
| 8.6832e-05 | 0.298 |
| 8.6864e-05 | 0.294 |
| 8.6896e-05 | 0.294 |
| 8.6928e-05 | 0.294 |
| 8.696e-05 | 0.294 |
| 8.6992e-05 | 0.294 |
| 8.7024e-05 | 0.298 |
| 8.7056e-05 | 0.294 |
| 8.7088e-05 | 0.294 |
| 8.712e-05 | 0.294 |
| 8.7152e-05 | 0.29 |
| 8.7184e-05 | 0.294 |
| 8.7216e-05 | 0.294 |
| 8.7248e-05 | 0.294 |
| 8.728e-05 | 0.294 |
| 8.7312e-05 | 0.294 |
| 8.7344e-05 | 0.294 |
| 8.7376e-05 | 0.294 |
| 8.7408e-05 | 0.294 |
| 8.744e-05 | 0.294 |
| 8.7472e-05 | 0.294 |
| 8.7504e-05 | 0.298 |
| 8.7536e-05 | 0.294 |
| 8.7568e-05 | 0.294 |
| 8.76e-05 | 0.294 |
| 8.7632e-05 | 0.294 |
| 8.7664e-05 | 0.294 |
| 8.7696e-05 | 0.294 |
| 8.7728e-05 | 0.294 |
| 8.776e-05 | 0.294 |
| 8.7792e-05 | 0.29 |
| 8.7824e-05 | 0.29 |
| 8.7856e-05 | 0.29 |
| 8.7888e-05 | 0.294 |
| 8.792e-05 | 0.294 |
| 8.7952e-05 | 0.294 |
| 8.7984e-05 | 0.29 |
| 8.8016e-05 | 0.29 |
| 8.8048e-05 | 0.29 |
| 8.808e-05 | 0.29 |
| 8.8112e-05 | 0.294 |
| 8.8144e-05 | 0.29 |
| 8.8176e-05 | 0.294 |
| 8.8208e-05 | 0.294 |
| 8.824e-05 | 0.294 |
| 8.8272e-05 | 0.294 |
| 8.8304e-05 | 0.294 |
| 8.8336e-05 | 0.294 |
| 8.8368e-05 | 0.294 |
| 8.84e-05 | 0.29 |
| 8.8432e-05 | 0.294 |
| 8.8464e-05 | 0.294 |
| 8.8496e-05 | 0.294 |
| 8.8528e-05 | 0.294 |
| 8.856e-05 | 0.294 |
| 8.8592e-05 | 0.294 |
| 8.8624e-05 | 0.294 |
| 8.8656e-05 | 0.294 |
| 8.8688e-05 | 0.294 |
| 8.872e-05 | 0.298 |
| 8.875199999999999e-05 | 0.298 |
| 8.8784e-05 | 0.294 |
| 8.8816e-05 | 0.298 |
| 8.8848e-05 | 0.298 |
| 8.888e-05 | 0.298 |
| 8.8912e-05 | 0.298 |
| 8.8944e-05 | 0.298 |
| 8.8976e-05 | 0.298 |
| 8.9008e-05 | 0.298 |
| 8.904e-05 | 0.302 |
| 8.9072e-05 | 0.298 |
| 8.9104e-05 | 0.298 |
| 8.9136e-05 | 0.302 |
| 8.9168e-05 | 0.302 |
| 8.92e-05 | 0.302 |
| 8.9232e-05 | 0.302 |
| 8.9264e-05 | 0.302 |
| 8.9296e-05 | 0.302 |
| 8.9328e-05 | 0.302 |
| 8.936e-05 | 0.302 |
| 8.9392e-05 | 0.302 |
| 8.9424e-05 | 0.302 |
| 8.9456e-05 | 0.302 |
| 8.9488e-05 | 0.302 |
| 8.952e-05 | 0.302 |
| 8.9552e-05 | 0.302 |
| 8.9584e-05 | 0.302 |
| 8.9616e-05 | 0.302 |
| 8.9648e-05 | 0.302 |
| 8.968e-05 | 0.298 |
| 8.9712e-05 | 0.298 |
| 8.9744e-05 | 0.298 |
| 8.9776e-05 | 0.298 |
| 8.9808e-05 | 0.298 |
| 8.984e-05 | 0.298 |
| 8.9872e-05 | 0.298 |
| 8.9904e-05 | 0.298 |
| 8.9936e-05 | 0.294 |
| 8.9968e-05 | 0.294 |
| 9e-05 | 0.294 |
| 9.0032e-05 | 0.294 |
| 9.0064e-05 | 0.29 |
| 9.0096e-05 | 0.294 |
| 9.0128e-05 | 0.29 |
| 9.016e-05 | 0.294 |
| 9.0192e-05 | 0.29 |
| 9.0224e-05 | 0.29 |
| 9.0256e-05 | 0.29 |
| 9.0288e-05 | 0.29 |
| 9.032e-05 | 0.29 |
| 9.0352e-05 | 0.29 |
| 9.0384e-05 | 0.29 |
| 9.0416e-05 | 0.29 |
| 9.0448e-05 | 0.286 |
| 9.048e-05 | 0.286 |
| 9.0512e-05 | 0.286 |
| 9.0544e-05 | 0.286 |
| 9.0576e-05 | 0.286 |
| 9.0608e-05 | 0.286 |
| 9.064e-05 | 0.286 |
| 9.0672e-05 | 0.29 |
| 9.0704e-05 | 0.29 |
| 9.0736e-05 | 0.286 |
| 9.0768e-05 | 0.29 |
| 9.08e-05 | 0.29 |
| 9.0832e-05 | 0.286 |
| 9.0864e-05 | 0.29 |
| 9.0896e-05 | 0.29 |
| 9.0928e-05 | 0.29 |
| 9.096e-05 | 0.29 |
| 9.0992e-05 | 0.29 |
| 9.1024e-05 | 0.29 |
| 9.1056e-05 | 0.29 |
| 9.1088e-05 | 0.29 |
| 9.112e-05 | 0.29 |
| 9.1152e-05 | 0.29 |
| 9.1184e-05 | 0.29 |
| 9.1216e-05 | 0.294 |
| 9.1248e-05 | 0.29 |
| 9.128e-05 | 0.29 |
| 9.1312e-05 | 0.29 |
| 9.1344e-05 | 0.29 |
| 9.1376e-05 | 0.29 |
| 9.1408e-05 | 0.29 |
| 9.144e-05 | 0.29 |
| 9.1472e-05 | 0.29 |
| 9.1504e-05 | 0.29 |
| 9.1536e-05 | 0.294 |
| 9.1568e-05 | 0.29 |
| 9.16e-05 | 0.29 |
| 9.1632e-05 | 0.29 |
| 9.1664e-05 | 0.29 |
| 9.1696e-05 | 0.29 |
| 9.1728e-05 | 0.29 |
| 9.176e-05 | 0.29 |
| 9.1792e-05 | 0.29 |
| 9.1824e-05 | 0.29 |
| 9.1856e-05 | 0.29 |
| 9.1888e-05 | 0.29 |
| 9.192e-05 | 0.29 |
| 9.1952e-05 | 0.29 |
| 9.1984e-05 | 0.29 |
| 9.2016e-05 | 0.29 |
| 9.2048e-05 | 0.286 |
| 9.208e-05 | 0.286 |
| 9.2112e-05 | 0.286 |
| 9.2144e-05 | 0.282 |
| 9.2176e-05 | 0.282 |
| 9.2208e-05 | 0.286 |
| 9.224e-05 | 0.282 |
| 9.2272e-05 | 0.282 |
| 9.2304e-05 | 0.278 |
| 9.2336e-05 | 0.282 |
| 9.2368e-05 | 0.282 |
| 9.24e-05 | 0.278 |
| 9.2432e-05 | 0.282 |
| 9.2464e-05 | 0.282 |
| 9.2496e-05 | 0.282 |
| 9.2528e-05 | 0.278 |
| 9.256e-05 | 0.282 |
| 9.2592e-05 | 0.282 |
| 9.2624e-05 | 0.282 |
| 9.2656e-05 | 0.282 |
| 9.2688e-05 | 0.282 |
| 9.272e-05 | 0.282 |
| 9.2752e-05 | 0.278 |
| 9.2784e-05 | 0.282 |
| 9.2816e-05 | 0.282 |
| 9.2848e-05 | 0.282 |
| 9.288e-05 | 0.282 |
| 9.2912e-05 | 0.282 |
| 9.2944e-05 | 0.278 |
| 9.2976e-05 | 0.282 |
| 9.3008e-05 | 0.282 |
| 9.304e-05 | 0.282 |
| 9.3072e-05 | 0.278 |
| 9.3104e-05 | 0.278 |
| 9.3136e-05 | 0.278 |
| 9.3168e-05 | 0.278 |
| 9.32e-05 | 0.278 |
| 9.3232e-05 | 0.278 |
| 9.3264e-05 | 0.278 |
| 9.3296e-05 | 0.278 |
| 9.3328e-05 | 0.274 |
| 9.336e-05 | 0.274 |
| 9.3392e-05 | 0.274 |
| 9.3424e-05 | 0.274 |
| 9.3456e-05 | 0.274 |
| 9.3488e-05 | 0.274 |
| 9.352e-05 | 0.274 |
| 9.3552e-05 | 0.274 |
| 9.3584e-05 | 0.274 |
| 9.3616e-05 | 0.274 |
| 9.3648e-05 | 0.274 |
| 9.368e-05 | 0.274 |
| 9.3712e-05 | 0.27 |
| 9.3744e-05 | 0.27 |
| 9.3776e-05 | 0.27 |
| 9.3808e-05 | 0.27 |
| 9.384e-05 | 0.27 |
| 9.3872e-05 | 0.274 |
| 9.3904e-05 | 0.27 |
| 9.3936e-05 | 0.27 |
| 9.3968e-05 | 0.27 |
| 9.4e-05 | 0.27 |
| 9.4032e-05 | 0.27 |
| 9.4064e-05 | 0.27 |
| 9.4096e-05 | 0.27 |
| 9.4128e-05 | 0.27 |
| 9.416e-05 | 0.27 |
| 9.4192e-05 | 0.27 |
| 9.4224e-05 | 0.27 |
| 9.4256e-05 | 0.27 |
| 9.4288e-05 | 0.27 |
| 9.432e-05 | 0.27 |
| 9.4352e-05 | 0.27 |
| 9.4384e-05 | 0.274 |
| 9.4416e-05 | 0.274 |
| 9.4448e-05 | 0.274 |
| 9.448e-05 | 0.278 |
| 9.4512e-05 | 0.274 |
| 9.4544e-05 | 0.278 |
| 9.4576e-05 | 0.278 |
| 9.4608e-05 | 0.278 |
| 9.464e-05 | 0.278 |
| 9.4672e-05 | 0.278 |
| 9.4704e-05 | 0.278 |
| 9.4736e-05 | 0.278 |
| 9.4768e-05 | 0.278 |
| 9.48e-05 | 0.278 |
| 9.4832e-05 | 0.278 |
| 9.4864e-05 | 0.278 |
| 9.4896e-05 | 0.278 |
| 9.4928e-05 | 0.278 |
| 9.496e-05 | 0.278 |
| 9.4992e-05 | 0.278 |
| 9.5024e-05 | 0.278 |
| 9.5056e-05 | 0.278 |
| 9.5088e-05 | 0.278 |
| 9.512e-05 | 0.278 |
| 9.5152e-05 | 0.278 |
| 9.5184e-05 | 0.282 |
| 9.5216e-05 | 0.282 |
| 9.5248e-05 | 0.282 |
| 9.528e-05 | 0.282 |
| 9.5312e-05 | 0.282 |
| 9.5344e-05 | 0.282 |
| 9.5376e-05 | 0.282 |
| 9.5408e-05 | 0.282 |
| 9.544e-05 | 0.282 |
| 9.5472e-05 | 0.282 |
| 9.5504e-05 | 0.282 |
| 9.5536e-05 | 0.282 |
| 9.5568e-05 | 0.282 |
| 9.56e-05 | 0.286 |
| 9.5632e-05 | 0.282 |
| 9.5664e-05 | 0.278 |
| 9.5696e-05 | 0.282 |
| 9.5728e-05 | 0.282 |
| 9.576e-05 | 0.282 |
| 9.5792e-05 | 0.282 |
| 9.5824e-05 | 0.286 |
| 9.5856e-05 | 0.286 |
| 9.5888e-05 | 0.286 |
| 9.592e-05 | 0.286 |
| 9.5952e-05 | 0.286 |
| 9.5984e-05 | 0.286 |
| 9.6016e-05 | 0.282 |
| 9.6048e-05 | 0.286 |
| 9.608e-05 | 0.282 |
| 9.6112e-05 | 0.282 |
| 9.6144e-05 | 0.286 |
| 9.6176e-05 | 0.286 |
| 9.6208e-05 | 0.286 |
| 9.624e-05 | 0.286 |
| 9.6272e-05 | 0.286 |
| 9.6304e-05 | 0.286 |
| 9.6336e-05 | 0.282 |
| 9.6368e-05 | 0.286 |
| 9.64e-05 | 0.282 |
| 9.6432e-05 | 0.282 |
| 9.6464e-05 | 0.282 |
| 9.6496e-05 | 0.282 |
| 9.6528e-05 | 0.286 |
| 9.656e-05 | 0.286 |
| 9.6592e-05 | 0.282 |
| 9.6624e-05 | 0.282 |
| 9.6656e-05 | 0.286 |
| 9.6688e-05 | 0.286 |
| 9.672e-05 | 0.286 |
| 9.6752e-05 | 0.282 |
| 9.6784e-05 | 0.282 |
| 9.6816e-05 | 0.282 |
| 9.6848e-05 | 0.282 |
| 9.688e-05 | 0.286 |
| 9.6912e-05 | 0.286 |
| 9.6944e-05 | 0.282 |
| 9.6976e-05 | 0.282 |
| 9.7008e-05 | 0.286 |
| 9.704e-05 | 0.286 |
| 9.7072e-05 | 0.286 |
| 9.7104e-05 | 0.286 |
| 9.7136e-05 | 0.286 |
| 9.7168e-05 | 0.282 |
| 9.72e-05 | 0.286 |
| 9.7232e-05 | 0.286 |
| 9.7264e-05 | 0.286 |
| 9.7296e-05 | 0.286 |
| 9.7328e-05 | 0.286 |
| 9.736e-05 | 0.286 |
| 9.7392e-05 | 0.286 |
| 9.7424e-05 | 0.286 |
| 9.7456e-05 | 0.286 |
| 9.7488e-05 | 0.286 |
| 9.752e-05 | 0.286 |
| 9.7552e-05 | 0.282 |
| 9.7584e-05 | 0.282 |
| 9.7616e-05 | 0.282 |
| 9.7648e-05 | 0.282 |
| 9.768e-05 | 0.278 |
| 9.7712e-05 | 0.282 |
| 9.7744e-05 | 0.278 |
| 9.7776e-05 | 0.278 |
| 9.7808e-05 | 0.278 |
| 9.784e-05 | 0.278 |
| 9.7872e-05 | 0.278 |
| 9.7904e-05 | 0.278 |
| 9.7936e-05 | 0.278 |
| 9.7968e-05 | 0.278 |
| 9.8e-05 | 0.274 |
| 9.8032e-05 | 0.274 |
| 9.8064e-05 | 0.274 |
| 9.8096e-05 | 0.278 |
| 9.8128e-05 | 0.274 |
| 9.816e-05 | 0.278 |
| 9.8192e-05 | 0.278 |
| 9.8224e-05 | 0.274 |
| 9.8256e-05 | 0.274 |
| 9.8288e-05 | 0.274 |
| 9.832e-05 | 0.274 |
| 9.8352e-05 | 0.278 |
| 9.8384e-05 | 0.274 |
| 9.8416e-05 | 0.274 |
| 9.8448e-05 | 0.27 |
| 9.848e-05 | 0.274 |
| 9.8512e-05 | 0.27 |
| 9.8544e-05 | 0.274 |
| 9.8576e-05 | 0.274 |
| 9.8608e-05 | 0.27 |
| 9.864e-05 | 0.27 |
| 9.8672e-05 | 0.274 |
| 9.8704e-05 | 0.27 |
| 9.8736e-05 | 0.27 |
| 9.8768e-05 | 0.27 |
| 9.88e-05 | 0.274 |
| 9.8832e-05 | 0.27 |
| 9.8864e-05 | 0.27 |
| 9.8896e-05 | 0.27 |
| 9.8928e-05 | 0.27 |
| 9.896e-05 | 0.27 |
| 9.8992e-05 | 0.27 |
| 9.9024e-05 | 0.27 |
| 9.9056e-05 | 0.266 |
| 9.9088e-05 | 0.27 |
| 9.912e-05 | 0.27 |
| 9.9152e-05 | 0.266 |
| 9.9184e-05 | 0.27 |
| 9.9216e-05 | 0.27 |
| 9.9248e-05 | 0.27 |
| 9.928e-05 | 0.27 |
| 9.9312e-05 | 0.27 |
| 9.9344e-05 | 0.274 |
| 9.9376e-05 | 0.27 |
| 9.9408e-05 | 0.27 |
| 9.944e-05 | 0.27 |
| 9.9472e-05 | 0.27 |
| 9.9504e-05 | 0.274 |
| 9.9536e-05 | 0.274 |
| 9.9568e-05 | 0.274 |
| 9.96e-05 | 0.278 |
| 9.9632e-05 | 0.278 |
| 9.9664e-05 | 0.278 |
| 9.9696e-05 | 0.278 |
| 9.9728e-05 | 0.282 |
| 9.976e-05 | 0.278 |
| 9.9792e-05 | 0.278 |
| 9.9824e-05 | 0.282 |
| 9.9856e-05 | 0.282 |
| 9.9888e-05 | 0.282 |
| 9.992e-05 | 0.282 |
| 9.9952e-05 | 0.282 |
| 9.9984e-05 | 0.282 |
| 0.00010002 | 0.282 |
| 0.00010005 | 0.282 |
| 0.00010008 | 0.282 |
| 0.00010011 | 0.282 |
| 0.00010014 | 0.278 |
| 0.00010018 | 0.278 |
| 0.00010021 | 0.278 |
| 0.00010024 | 0.278 |
| 0.00010027 | 0.278 |
| 0.0001003 | 0.278 |
| 0.00010034 | 0.278 |
| 0.00010037 | 0.278 |
| 0.0001004 | 0.278 |
| 0.00010043 | 0.274 |
| 0.00010046 | 0.274 |
| 0.0001005 | 0.274 |
| 0.00010053 | 0.274 |
| 0.00010056 | 0.274 |
| 0.00010059 | 0.27 |
| 0.00010062 | 0.274 |
| 0.00010066 | 0.27 |
| 0.00010069 | 0.27 |
| 0.00010072 | 0.266 |
| 0.00010075 | 0.27 |
| 0.00010078 | 0.266 |
| 0.00010082 | 0.27 |
| 0.00010085 | 0.27 |
| 0.00010088 | 0.27 |
| 0.00010091 | 0.27 |
| 0.00010094 | 0.266 |
| 0.00010098 | 0.266 |
| 0.00010101 | 0.266 |
| 0.00010104 | 0.266 |
| 0.00010107 | 0.266 |
| 0.0001011 | 0.27 |
| 0.00010114 | 0.266 |
| 0.00010117 | 0.266 |
| 0.0001012 | 0.266 |
| 0.00010123 | 0.266 |
| 0.00010126 | 0.266 |
| 0.0001013 | 0.266 |
| 0.00010133 | 0.266 |
| 0.00010136 | 0.266 |
| 0.00010139 | 0.266 |
| 0.00010142 | 0.266 |
| 0.00010146 | 0.266 |
| 0.00010149 | 0.266 |
| 0.00010152 | 0.258 |
| 0.00010155 | 0.266 |
| 0.00010158 | 0.262 |
| 0.00010162 | 0.262 |
| 0.00010165 | 0.262 |
| 0.00010168 | 0.258 |
| 0.00010171 | 0.258 |
| 0.00010174 | 0.258 |
| 0.00010178 | 0.258 |
| 0.00010181 | 0.258 |
| 0.00010184 | 0.258 |
| 0.00010187 | 0.258 |
| 0.0001019 | 0.254 |
| 0.00010194 | 0.254 |
| 0.00010197 | 0.254 |
| 0.000102 | 0.254 |
| 0.00010203 | 0.254 |
| 0.00010206 | 0.254 |
| 0.0001021 | 0.254 |
| 0.00010213 | 0.254 |
| 0.00010216 | 0.254 |
| 0.00010219 | 0.25 |
| 0.00010222 | 0.25 |
| 0.00010226 | 0.25 |
| 0.00010229 | 0.25 |
| 0.00010232 | 0.254 |
| 0.00010235 | 0.25 |
| 0.00010238 | 0.25 |
| 0.00010242 | 0.25 |
| 0.00010245 | 0.25 |
| 0.00010248 | 0.254 |
| 0.00010251 | 0.25 |
| 0.00010254 | 0.25 |
| 0.00010258 | 0.254 |
| 0.00010261 | 0.254 |
| 0.00010264 | 0.254 |
| 0.00010267 | 0.254 |
| 0.0001027 | 0.254 |
| 0.00010274 | 0.254 |
| 0.00010277 | 0.258 |
| 0.0001028 | 0.258 |
| 0.00010283 | 0.254 |
| 0.00010286 | 0.258 |
| 0.0001029 | 0.254 |
| 0.00010293 | 0.258 |
| 0.00010296 | 0.254 |
| 0.00010299 | 0.254 |
| 0.00010302 | 0.258 |
| 0.00010306 | 0.254 |
| 0.00010309 | 0.258 |
| 0.00010312 | 0.258 |
| 0.00010315 | 0.254 |
| 0.00010318 | 0.258 |
| 0.00010322 | 0.254 |
| 0.00010325 | 0.258 |
| 0.00010328 | 0.258 |
| 0.00010331 | 0.258 |
| 0.00010334 | 0.258 |
| 0.00010338 | 0.258 |
| 0.00010341 | 0.254 |
| 0.00010344 | 0.258 |
| 0.00010347 | 0.254 |
| 0.0001035 | 0.258 |
| 0.00010354 | 0.254 |
| 0.00010357 | 0.254 |
| 0.0001036 | 0.254 |
| 0.00010363 | 0.254 |
| 0.00010366 | 0.254 |
| 0.0001037 | 0.254 |
| 0.00010373 | 0.254 |
| 0.00010376 | 0.254 |
| 0.00010379 | 0.254 |
| 0.00010382 | 0.254 |
| 0.00010386 | 0.254 |
| 0.00010389 | 0.254 |
| 0.00010392 | 0.254 |
| 0.00010395 | 0.254 |
| 0.00010398 | 0.254 |
| 0.00010402 | 0.254 |
| 0.00010405 | 0.254 |
| 0.00010408 | 0.254 |
| 0.00010411 | 0.258 |
| 0.00010414 | 0.254 |
| 0.00010418 | 0.254 |
| 0.00010421 | 0.258 |
| 0.00010424 | 0.254 |
| 0.00010427 | 0.258 |
| 0.0001043 | 0.258 |
| 0.00010434 | 0.258 |
| 0.00010437 | 0.258 |
| 0.0001044 | 0.258 |
| 0.00010443 | 0.262 |
| 0.00010446 | 0.258 |
| 0.0001045 | 0.258 |
| 0.00010453 | 0.262 |
| 0.00010456 | 0.262 |
| 0.00010459 | 0.258 |
| 0.00010462 | 0.262 |
| 0.00010466 | 0.262 |
| 0.00010469 | 0.262 |
| 0.00010472 | 0.262 |
| 0.00010475 | 0.266 |
| 0.00010478 | 0.262 |
| 0.00010482 | 0.266 |
| 0.00010485 | 0.262 |
| 0.00010488 | 0.266 |
| 0.00010491 | 0.262 |
| 0.00010494 | 0.262 |
| 0.00010498 | 0.266 |
| 0.00010501 | 0.262 |
| 0.00010504 | 0.262 |
| 0.00010507 | 0.262 |
| 0.0001051 | 0.262 |
| 0.00010514 | 0.262 |
| 0.00010517 | 0.262 |
| 0.0001052 | 0.262 |
| 0.00010523 | 0.262 |
| 0.00010526 | 0.258 |
| 0.0001053 | 0.258 |
| 0.00010533 | 0.258 |
| 0.00010536 | 0.258 |
| 0.00010539 | 0.258 |
| 0.00010542 | 0.254 |
| 0.00010546 | 0.258 |
| 0.00010549 | 0.254 |
| 0.00010552 | 0.258 |
| 0.00010555 | 0.254 |
| 0.00010558 | 0.254 |
| 0.00010562 | 0.254 |
| 0.00010565 | 0.254 |
| 0.00010568 | 0.254 |
| 0.00010571 | 0.254 |
| 0.00010574 | 0.254 |
| 0.00010578 | 0.25 |
| 0.00010581 | 0.25 |
| 0.00010584 | 0.25 |
| 0.00010587 | 0.25 |
| 0.0001059 | 0.25 |
| 0.00010594 | 0.25 |
| 0.00010597 | 0.25 |
| 0.000106 | 0.25 |
| 0.00010603 | 0.246 |
| 0.00010606 | 0.246 |
| 0.0001061 | 0.25 |
| 0.00010613 | 0.246 |
| 0.00010616 | 0.246 |
| 0.00010619 | 0.246 |
| 0.00010622 | 0.246 |
| 0.00010626 | 0.242 |
| 0.00010629 | 0.246 |
| 0.00010632 | 0.242 |
| 0.00010635 | 0.242 |
| 0.00010638 | 0.242 |
| 0.00010642 | 0.246 |
| 0.00010645 | 0.246 |
| 0.00010648 | 0.246 |
| 0.00010651 | 0.242 |
| 0.00010654 | 0.246 |
| 0.00010658 | 0.246 |
| 0.00010661 | 0.246 |
| 0.00010664 | 0.246 |
| 0.00010667 | 0.242 |
| 0.0001067 | 0.246 |
| 0.00010674 | 0.246 |
| 0.00010677 | 0.246 |
| 0.0001068 | 0.246 |
| 0.00010683 | 0.246 |
| 0.00010686 | 0.246 |
| 0.0001069 | 0.246 |
| 0.00010693 | 0.246 |
| 0.00010696 | 0.246 |
| 0.00010699 | 0.246 |
| 0.00010702 | 0.25 |
| 0.00010706 | 0.246 |
| 0.00010709 | 0.246 |
| 0.00010712 | 0.246 |
| 0.00010715 | 0.246 |
| 0.00010718 | 0.25 |
| 0.00010722 | 0.246 |
| 0.00010725 | 0.246 |
| 0.00010728 | 0.25 |
| 0.00010731 | 0.246 |
| 0.00010734 | 0.25 |
| 0.00010738 | 0.25 |
| 0.00010741 | 0.25 |
| 0.00010744 | 0.25 |
| 0.00010747 | 0.25 |
| 0.0001075 | 0.25 |
| 0.00010754 | 0.25 |
| 0.00010757 | 0.25 |
| 0.0001076 | 0.25 |
| 0.00010763 | 0.254 |
| 0.00010766 | 0.254 |
| 0.0001077 | 0.254 |
| 0.00010773 | 0.25 |
| 0.00010776 | 0.254 |
| 0.00010779 | 0.25 |
| 0.00010782 | 0.25 |
| 0.00010786 | 0.25 |
| 0.00010789 | 0.25 |
| 0.00010792 | 0.25 |
| 0.00010795 | 0.25 |
| 0.00010798 | 0.25 |
| 0.00010802 | 0.25 |
| 0.00010805 | 0.25 |
| 0.00010808 | 0.25 |
| 0.00010811 | 0.25 |
| 0.00010814 | 0.25 |
| 0.00010818 | 0.25 |
| 0.00010821 | 0.25 |
| 0.00010824 | 0.25 |
| 0.00010827 | 0.25 |
| 0.0001083 | 0.25 |
| 0.00010834 | 0.25 |
| 0.00010837 | 0.25 |
| 0.0001084 | 0.25 |
| 0.00010843 | 0.25 |
| 0.00010846 | 0.25 |
| 0.0001085 | 0.25 |
| 0.00010853 | 0.25 |
| 0.00010856 | 0.25 |
| 0.00010859 | 0.25 |
| 0.00010862 | 0.25 |
| 0.00010866 | 0.25 |
| 0.00010869 | 0.25 |
| 0.00010872 | 0.25 |
| 0.00010875 | 0.25 |
| 0.00010878 | 0.246 |
| 0.00010882 | 0.25 |
| 0.00010885 | 0.25 |
| 0.00010888 | 0.25 |
| 0.00010891 | 0.25 |
| 0.00010894 | 0.25 |
| 0.00010898 | 0.25 |
| 0.00010901 | 0.25 |
| 0.00010904 | 0.25 |
| 0.00010907 | 0.25 |
| 0.0001091 | 0.254 |
| 0.00010914 | 0.254 |
| 0.00010917 | 0.254 |
| 0.0001092 | 0.254 |
| 0.00010923 | 0.25 |
| 0.00010926 | 0.25 |
| 0.0001093 | 0.254 |
| 0.00010933 | 0.254 |
| 0.00010936 | 0.25 |
| 0.00010939 | 0.25 |
| 0.00010942 | 0.254 |
| 0.00010946 | 0.25 |
| 0.00010949 | 0.254 |
| 0.00010952 | 0.25 |
| 0.00010955 | 0.25 |
| 0.00010958 | 0.25 |
| 0.00010962 | 0.25 |
| 0.00010965 | 0.25 |
| 0.00010968 | 0.25 |
| 0.00010971 | 0.246 |
| 0.00010974 | 0.246 |
| 0.00010978 | 0.246 |
| 0.00010981 | 0.246 |
| 0.00010984 | 0.246 |
| 0.00010987 | 0.246 |
| 0.0001099 | 0.246 |
| 0.00010994 | 0.242 |
| 0.00010997 | 0.242 |
| 0.00011 | 0.242 |
| 0.00011003 | 0.242 |
| 0.00011006 | 0.238 |
| 0.0001101 | 0.242 |
| 0.00011013 | 0.242 |
| 0.00011016 | 0.238 |
| 0.00011019 | 0.238 |
| 0.00011022 | 0.238 |
| 0.00011026 | 0.238 |
| 0.00011029 | 0.238 |
| 0.00011032 | 0.242 |
| 0.00011035 | 0.242 |
| 0.00011038 | 0.242 |
| 0.00011042 | 0.246 |
| 0.00011045 | 0.246 |
| 0.00011048 | 0.246 |
| 0.00011051 | 0.246 |
| 0.00011054 | 0.246 |
| 0.00011058 | 0.25 |
| 0.00011061 | 0.25 |
| 0.00011064 | 0.25 |
| 0.00011067 | 0.25 |
| 0.0001107 | 0.25 |
| 0.00011074 | 0.254 |
| 0.00011077 | 0.254 |
| 0.0001108 | 0.254 |
| 0.00011083 | 0.254 |
| 0.00011086 | 0.254 |
| 0.0001109 | 0.254 |
| 0.00011093 | 0.254 |
| 0.00011096 | 0.258 |
| 0.00011099 | 0.258 |
| 0.00011102 | 0.258 |
| 0.00011106 | 0.258 |
| 0.00011109 | 0.258 |
| 0.00011112 | 0.258 |
| 0.00011115 | 0.258 |
| 0.00011118 | 0.254 |
| 0.00011122 | 0.258 |
| 0.00011125 | 0.254 |
| 0.00011128 | 0.254 |
| 0.00011131 | 0.254 |
| 0.00011134 | 0.254 |
| 0.00011138 | 0.254 |
| 0.00011141 | 0.254 |
| 0.00011144 | 0.254 |
| 0.00011147 | 0.254 |
| 0.0001115 | 0.254 |
| 0.00011154 | 0.254 |
| 0.00011157 | 0.254 |
| 0.0001116 | 0.254 |
| 0.00011163 | 0.25 |
| 0.00011166 | 0.254 |
| 0.0001117 | 0.25 |
| 0.00011173 | 0.25 |
| 0.00011176 | 0.25 |
| 0.00011179 | 0.246 |
| 0.00011182 | 0.246 |
| 0.00011186 | 0.242 |
| 0.00011189 | 0.242 |
| 0.00011192 | 0.246 |
| 0.00011195 | 0.242 |
| 0.00011198 | 0.242 |
| 0.00011202 | 0.242 |
| 0.00011205 | 0.242 |
| 0.00011208 | 0.242 |
| 0.00011211 | 0.246 |
| 0.00011214 | 0.242 |
| 0.00011218 | 0.246 |
| 0.00011221 | 0.246 |
| 0.00011224 | 0.246 |
| 0.00011227 | 0.242 |
| 0.0001123 | 0.246 |
| 0.00011234 | 0.242 |
| 0.00011237 | 0.246 |
| 0.0001124 | 0.246 |
| 0.00011243 | 0.246 |
| 0.00011246 | 0.246 |
| 0.0001125 | 0.25 |
| 0.00011253 | 0.25 |
| 0.00011256 | 0.25 |
| 0.00011259 | 0.25 |
| 0.00011262 | 0.25 |
| 0.00011266 | 0.254 |
| 0.00011269 | 0.25 |
| 0.00011272 | 0.25 |
| 0.00011275 | 0.25 |
| 0.00011278 | 0.25 |
| 0.00011282 | 0.254 |
| 0.00011285 | 0.254 |
| 0.00011288 | 0.254 |
| 0.00011291 | 0.25 |
| 0.00011294 | 0.254 |
| 0.00011298 | 0.254 |
| 0.00011301 | 0.254 |
| 0.00011304 | 0.254 |
| 0.00011307 | 0.254 |
| 0.0001131 | 0.254 |
| 0.00011314 | 0.258 |
| 0.00011317 | 0.254 |
| 0.0001132 | 0.258 |
| 0.00011323 | 0.258 |
| 0.00011326 | 0.258 |
| 0.0001133 | 0.258 |
| 0.00011333 | 0.258 |
| 0.00011336 | 0.258 |
| 0.00011339 | 0.258 |
| 0.00011342 | 0.262 |
| 0.00011346 | 0.262 |
| 0.00011349 | 0.258 |
| 0.00011352 | 0.258 |
| 0.00011355 | 0.258 |
| 0.00011358 | 0.258 |
| 0.00011362 | 0.258 |
| 0.00011365 | 0.258 |
| 0.00011368 | 0.258 |
| 0.00011371 | 0.258 |
| 0.00011374 | 0.258 |
| 0.00011378 | 0.258 |
| 0.00011381 | 0.258 |
| 0.00011384 | 0.258 |
| 0.00011387 | 0.258 |
| 0.0001139 | 0.258 |
| 0.00011394 | 0.258 |
| 0.00011397 | 0.258 |
| 0.000114 | 0.258 |
| 0.00011403 | 0.258 |
| 0.00011406 | 0.258 |
| 0.0001141 | 0.262 |
| 0.00011413 | 0.258 |
| 0.00011416 | 0.262 |
| 0.00011419 | 0.262 |
| 0.00011422 | 0.262 |
| 0.00011426 | 0.262 |
| 0.00011429 | 0.262 |
| 0.00011432 | 0.258 |
| 0.00011435 | 0.262 |
| 0.00011438 | 0.262 |
| 0.00011442 | 0.262 |
| 0.00011445 | 0.258 |
| 0.00011448 | 0.258 |
| 0.00011451 | 0.262 |
| 0.00011454 | 0.258 |
| 0.00011458 | 0.262 |
| 0.00011461 | 0.262 |
| 0.00011464 | 0.262 |
| 0.00011467 | 0.258 |
| 0.0001147 | 0.262 |
| 0.00011474 | 0.258 |
| 0.00011477 | 0.258 |
| 0.0001148 | 0.258 |
| 0.00011483 | 0.258 |
| 0.00011486 | 0.258 |
| 0.0001149 | 0.258 |
| 0.00011493 | 0.258 |
| 0.00011496 | 0.258 |
| 0.00011499 | 0.258 |
| 0.00011502 | 0.258 |
| 0.00011506 | 0.258 |
| 0.00011509 | 0.258 |
| 0.00011512 | 0.258 |
| 0.00011515 | 0.254 |
| 0.00011518 | 0.254 |
| 0.00011522 | 0.254 |
| 0.00011525 | 0.254 |
| 0.00011528 | 0.254 |
| 0.00011531 | 0.254 |
| 0.00011534 | 0.254 |
| 0.00011538 | 0.254 |
| 0.00011541 | 0.254 |
| 0.00011544 | 0.254 |
| 0.00011547 | 0.254 |
| 0.0001155 | 0.25 |
| 0.00011554 | 0.254 |
| 0.00011557 | 0.254 |
| 0.0001156 | 0.25 |
| 0.00011563 | 0.25 |
| 0.00011566 | 0.254 |
| 0.0001157 | 0.25 |
| 0.00011573 | 0.254 |
| 0.00011576 | 0.25 |
| 0.00011579 | 0.25 |
| 0.00011582 | 0.25 |
| 0.00011586 | 0.25 |
| 0.00011589 | 0.25 |
| 0.00011592 | 0.254 |
| 0.00011595 | 0.25 |
| 0.00011598 | 0.25 |
| 0.00011602 | 0.25 |
| 0.00011605 | 0.254 |
| 0.00011608 | 0.25 |
| 0.00011611 | 0.25 |
| 0.00011614 | 0.254 |
| 0.00011618 | 0.25 |
| 0.00011621 | 0.25 |
| 0.00011624 | 0.25 |
| 0.00011627 | 0.25 |
| 0.0001163 | 0.25 |
| 0.00011634 | 0.25 |
| 0.00011637 | 0.25 |
| 0.0001164 | 0.25 |
| 0.00011643 | 0.25 |
| 0.00011646 | 0.25 |
| 0.0001165 | 0.254 |
| 0.00011653 | 0.25 |
| 0.00011656 | 0.254 |
| 0.00011659 | 0.254 |
| 0.00011662 | 0.254 |
| 0.00011666 | 0.254 |
| 0.00011669 | 0.258 |
| 0.00011672 | 0.258 |
| 0.00011675 | 0.258 |
| 0.00011678 | 0.258 |
| 0.00011682 | 0.262 |
| 0.00011685 | 0.262 |
| 0.00011688 | 0.262 |
| 0.00011691 | 0.262 |
| 0.00011694 | 0.262 |
| 0.00011698 | 0.262 |
| 0.00011701 | 0.262 |
| 0.00011704 | 0.262 |
| 0.00011707 | 0.262 |
| 0.0001171 | 0.262 |
| 0.00011714 | 0.266 |
| 0.00011717 | 0.266 |
| 0.0001172 | 0.266 |
| 0.00011723 | 0.266 |
| 0.00011726 | 0.266 |
| 0.0001173 | 0.266 |
| 0.00011733 | 0.266 |
| 0.00011736 | 0.266 |
| 0.00011739 | 0.262 |
| 0.00011742 | 0.266 |
| 0.00011746 | 0.266 |
| 0.00011749 | 0.266 |
| 0.00011752 | 0.262 |
| 0.00011755 | 0.262 |
| 0.00011758 | 0.262 |
| 0.00011762 | 0.266 |
| 0.00011765 | 0.266 |
| 0.00011768 | 0.262 |
| 0.00011771 | 0.266 |
| 0.00011774 | 0.266 |
| 0.00011778 | 0.266 |
| 0.00011781 | 0.266 |
| 0.00011784 | 0.266 |
| 0.00011787 | 0.266 |
| 0.0001179 | 0.266 |
| 0.00011794 | 0.266 |
| 0.00011797 | 0.266 |
| 0.000118 | 0.266 |
| 0.00011803 | 0.266 |
| 0.00011806 | 0.262 |
| 0.0001181 | 0.266 |
| 0.00011813 | 0.266 |
| 0.00011816 | 0.266 |
| 0.00011819 | 0.266 |
| 0.00011822 | 0.266 |
| 0.00011826 | 0.266 |
| 0.00011829 | 0.262 |
| 0.00011832 | 0.262 |
| 0.00011835 | 0.262 |
| 0.00011838 | 0.262 |
| 0.00011842 | 0.262 |
| 0.00011845 | 0.266 |
| 0.00011848 | 0.266 |
| 0.00011851 | 0.266 |
| 0.00011854 | 0.262 |
| 0.00011858 | 0.262 |
| 0.00011861 | 0.262 |
| 0.00011864 | 0.262 |
| 0.00011867 | 0.262 |
| 0.0001187 | 0.262 |
| 0.00011874 | 0.262 |
| 0.00011877 | 0.262 |
| 0.0001188 | 0.258 |
| 0.00011883 | 0.262 |
| 0.00011886 | 0.258 |
| 0.0001189 | 0.258 |
| 0.00011893 | 0.262 |
| 0.00011896 | 0.258 |
| 0.00011899 | 0.258 |
| 0.00011902 | 0.258 |
| 0.00011906 | 0.258 |
| 0.00011909 | 0.258 |
| 0.00011912 | 0.262 |
| 0.00011915 | 0.258 |
| 0.00011918 | 0.258 |
| 0.00011922 | 0.262 |
| 0.00011925 | 0.258 |
| 0.00011928 | 0.258 |
| 0.00011931 | 0.254 |
| 0.00011934 | 0.258 |
| 0.00011938 | 0.258 |
| 0.00011941 | 0.258 |
| 0.00011944 | 0.258 |
| 0.00011947 | 0.258 |
| 0.0001195 | 0.258 |
| 0.00011954 | 0.258 |
| 0.00011957 | 0.258 |
| 0.0001196 | 0.254 |
| 0.00011963 | 0.254 |
| 0.00011966 | 0.254 |
| 0.0001197 | 0.254 |
| 0.00011973 | 0.254 |
| 0.00011976 | 0.254 |
| 0.00011979 | 0.254 |
| 0.00011982 | 0.254 |
| 0.00011986 | 0.25 |
| 0.00011989 | 0.254 |
| 0.00011992 | 0.254 |
| 0.00011995 | 0.254 |
| 0.00011998 | 0.254 |
| 0.00012002 | 0.25 |
| 0.00012005 | 0.254 |
| 0.00012008 | 0.25 |
| 0.00012011 | 0.254 |
| 0.00012014 | 0.254 |
| 0.00012018 | 0.254 |
| 0.00012021 | 0.254 |
| 0.00012024 | 0.254 |
| 0.00012027 | 0.254 |
| 0.0001203 | 0.254 |
| 0.00012034 | 0.254 |
| 0.00012037 | 0.258 |
| 0.0001204 | 0.258 |
| 0.00012043 | 0.258 |
| 0.00012046 | 0.258 |
| 0.0001205 | 0.258 |
| 0.00012053 | 0.262 |
| 0.00012056 | 0.262 |
| 0.00012059 | 0.262 |
| 0.00012062 | 0.262 |
| 0.00012066 | 0.262 |
| 0.00012069 | 0.262 |
| 0.00012072 | 0.266 |
| 0.00012075 | 0.266 |
| 0.00012078 | 0.266 |
| 0.00012082 | 0.266 |
| 0.00012085 | 0.266 |
| 0.00012088 | 0.266 |
| 0.00012091 | 0.266 |
| 0.00012094 | 0.266 |
| 0.00012098 | 0.266 |
| 0.00012101 | 0.27 |
| 0.00012104 | 0.27 |
| 0.00012107 | 0.27 |
| 0.0001211 | 0.266 |
| 0.00012114 | 0.27 |
| 0.00012117 | 0.27 |
| 0.0001212 | 0.266 |
| 0.00012123 | 0.27 |
| 0.00012126 | 0.266 |
| 0.0001213 | 0.27 |
| 0.00012133 | 0.27 |
| 0.00012136 | 0.266 |
| 0.00012139 | 0.266 |
| 0.00012142 | 0.266 |
| 0.00012146 | 0.266 |
| 0.00012149 | 0.266 |
| 0.00012152 | 0.266 |
| 0.00012155 | 0.262 |
| 0.00012158 | 0.266 |
| 0.00012162 | 0.262 |
| 0.00012165 | 0.258 |
| 0.00012168 | 0.262 |
| 0.00012171 | 0.258 |
| 0.00012174 | 0.258 |
| 0.00012178 | 0.258 |
| 0.00012181 | 0.258 |
| 0.00012184 | 0.258 |
| 0.00012187 | 0.254 |
| 0.0001219 | 0.254 |
| 0.00012194 | 0.254 |
| 0.00012197 | 0.254 |
| 0.000122 | 0.254 |
| 0.00012203 | 0.254 |
| 0.00012206 | 0.25 |
| 0.0001221 | 0.254 |
| 0.00012213 | 0.25 |
| 0.00012216 | 0.25 |
| 0.00012219 | 0.25 |
| 0.00012222 | 0.254 |
| 0.00012226 | 0.254 |
| 0.00012229 | 0.254 |
| 0.00012232 | 0.25 |
| 0.00012235 | 0.254 |
| 0.00012238 | 0.254 |
| 0.00012242 | 0.254 |
| 0.00012245 | 0.254 |
| 0.00012248 | 0.258 |
| 0.00012251 | 0.258 |
| 0.00012254 | 0.258 |
| 0.00012258 | 0.258 |
| 0.00012261 | 0.258 |
| 0.00012264 | 0.262 |
| 0.00012267 | 0.262 |
| 0.0001227 | 0.262 |
| 0.00012274 | 0.262 |
| 0.00012277 | 0.262 |
| 0.0001228 | 0.262 |
| 0.00012283 | 0.262 |
| 0.00012286 | 0.266 |
| 0.0001229 | 0.262 |
| 0.00012293 | 0.266 |
| 0.00012296 | 0.266 |
| 0.00012299 | 0.266 |
| 0.00012302 | 0.266 |
| 0.00012306 | 0.266 |
| 0.00012309 | 0.266 |
| 0.00012312 | 0.262 |
| 0.00012315 | 0.266 |
| 0.00012318 | 0.266 |
| 0.00012322 | 0.266 |
| 0.00012325 | 0.266 |
| 0.00012328 | 0.262 |
| 0.00012331 | 0.266 |
| 0.00012334 | 0.262 |
| 0.00012338 | 0.262 |
| 0.00012341 | 0.262 |
| 0.00012344 | 0.262 |
| 0.00012347 | 0.262 |
| 0.0001235 | 0.262 |
| 0.00012354 | 0.258 |
| 0.00012357 | 0.258 |
| 0.0001236 | 0.262 |
| 0.00012363 | 0.258 |
| 0.00012366 | 0.258 |
| 0.0001237 | 0.258 |
| 0.00012373 | 0.258 |
| 0.00012376 | 0.258 |
| 0.00012379 | 0.262 |
| 0.00012382 | 0.258 |
| 0.00012386 | 0.258 |
| 0.00012389 | 0.258 |
| 0.00012392 | 0.258 |
| 0.00012395 | 0.258 |
| 0.00012398 | 0.254 |
| 0.00012402 | 0.258 |
| 0.00012405 | 0.254 |
| 0.00012408 | 0.258 |
| 0.00012411 | 0.258 |
| 0.00012414 | 0.258 |
| 0.00012418 | 0.258 |
| 0.00012421 | 0.262 |
| 0.00012424 | 0.258 |
| 0.00012427 | 0.258 |
| 0.0001243 | 0.258 |
| 0.00012434 | 0.258 |
| 0.00012437 | 0.258 |
| 0.0001244 | 0.258 |
| 0.00012443 | 0.258 |
| 0.00012446 | 0.262 |
| 0.0001245 | 0.258 |
| 0.00012453 | 0.258 |
| 0.00012456 | 0.258 |
| 0.00012459 | 0.262 |
| 0.00012462 | 0.258 |
| 0.00012466 | 0.262 |
| 0.00012469 | 0.258 |
| 0.00012472 | 0.262 |
| 0.00012475 | 0.262 |
| 0.00012478 | 0.262 |
| 0.00012482 | 0.262 |
| 0.00012485 | 0.266 |
| 0.00012488 | 0.262 |
| 0.00012491 | 0.262 |
| 0.00012494 | 0.266 |
| 0.00012498 | 0.266 |
| 0.00012501 | 0.266 |
| 0.00012504 | 0.266 |
| 0.00012507 | 0.27 |
| 0.0001251 | 0.266 |
| 0.00012514 | 0.27 |
| 0.00012517 | 0.27 |
| 0.0001252 | 0.27 |
| 0.00012523 | 0.27 |
| 0.00012526 | 0.27 |
| 0.0001253 | 0.274 |
| 0.00012533 | 0.274 |
| 0.00012536 | 0.274 |
| 0.00012539 | 0.274 |
| 0.00012542 | 0.274 |
| 0.00012546 | 0.274 |
| 0.00012549 | 0.274 |
| 0.00012552 | 0.274 |
| 0.00012555 | 0.278 |
| 0.00012558 | 0.278 |
| 0.00012562 | 0.274 |
| 0.00012565 | 0.274 |
| 0.00012568 | 0.278 |
| 0.00012571 | 0.274 |
| 0.00012574 | 0.274 |
| 0.00012578 | 0.274 |
| 0.00012581 | 0.274 |
| 0.00012584 | 0.274 |
| 0.00012587 | 0.278 |
| 0.0001259 | 0.274 |
| 0.00012594 | 0.278 |
| 0.00012597 | 0.274 |
| 0.000126 | 0.278 |
| 0.00012603 | 0.278 |
| 0.00012606 | 0.278 |
| 0.0001261 | 0.278 |
| 0.00012613 | 0.278 |
| 0.00012616 | 0.278 |
| 0.00012619 | 0.278 |
| 0.00012622 | 0.278 |
| 0.00012626 | 0.278 |
| 0.00012629 | 0.278 |
| 0.00012632 | 0.278 |
| 0.00012635 | 0.278 |
| 0.00012638 | 0.278 |
| 0.00012642 | 0.274 |
| 0.00012645 | 0.274 |
| 0.00012648 | 0.278 |
| 0.00012651 | 0.274 |
| 0.00012654 | 0.274 |
| 0.00012658 | 0.274 |
| 0.00012661 | 0.274 |
| 0.00012664 | 0.274 |
| 0.00012667 | 0.27 |
| 0.0001267 | 0.274 |
| 0.00012674 | 0.27 |
| 0.00012677 | 0.274 |
| 0.0001268 | 0.274 |
| 0.00012683 | 0.274 |
| 0.00012686 | 0.274 |
| 0.0001269 | 0.27 |
| 0.00012693 | 0.27 |
| 0.00012696 | 0.27 |
| 0.00012699 | 0.27 |
| 0.00012702 | 0.27 |
| 0.00012706 | 0.27 |
| 0.00012709 | 0.27 |
| 0.00012712 | 0.27 |
| 0.00012715 | 0.27 |
| 0.00012718 | 0.27 |
| 0.00012722 | 0.27 |
| 0.00012725 | 0.266 |
| 0.00012728 | 0.266 |
| 0.00012731 | 0.266 |
| 0.00012734 | 0.266 |
| 0.00012738 | 0.266 |
| 0.00012741 | 0.262 |
| 0.00012744 | 0.262 |
| 0.00012747 | 0.262 |
| 0.0001275 | 0.262 |
| 0.00012754 | 0.258 |
| 0.00012757 | 0.262 |
| 0.0001276 | 0.258 |
| 0.00012763 | 0.258 |
| 0.00012766 | 0.258 |
| 0.0001277 | 0.258 |
| 0.00012773 | 0.258 |
| 0.00012776 | 0.258 |
| 0.00012779 | 0.254 |
| 0.00012782 | 0.254 |
| 0.00012786 | 0.254 |
| 0.00012789 | 0.254 |
| 0.00012792 | 0.254 |
| 0.00012795 | 0.254 |
| 0.00012798 | 0.254 |
| 0.00012802 | 0.254 |
| 0.00012805 | 0.25 |
| 0.00012808 | 0.254 |
| 0.00012811 | 0.254 |
| 0.00012814 | 0.254 |
| 0.00012818 | 0.254 |
| 0.00012821 | 0.254 |
| 0.00012824 | 0.254 |
| 0.00012827 | 0.254 |
| 0.0001283 | 0.254 |
| 0.00012834 | 0.254 |
| 0.00012837 | 0.254 |
| 0.0001284 | 0.258 |
| 0.00012843 | 0.258 |
| 0.00012846 | 0.258 |
| 0.0001285 | 0.258 |
| 0.00012853 | 0.262 |
| 0.00012856 | 0.262 |
| 0.00012859 | 0.262 |
| 0.00012862 | 0.262 |
| 0.00012866 | 0.262 |
| 0.00012869 | 0.266 |
| 0.00012872 | 0.262 |
| 0.00012875 | 0.266 |
| 0.00012878 | 0.262 |
| 0.00012882 | 0.266 |
| 0.00012885 | 0.266 |
| 0.00012888 | 0.266 |
| 0.00012891 | 0.266 |
| 0.00012894 | 0.266 |
| 0.00012898 | 0.27 |
| 0.00012901 | 0.262 |
| 0.00012904 | 0.266 |
| 0.00012907 | 0.266 |
| 0.0001291 | 0.266 |
| 0.00012914 | 0.27 |
| 0.00012917 | 0.266 |
| 0.0001292 | 0.266 |
| 0.00012923 | 0.27 |
| 0.00012926 | 0.27 |
| 0.0001293 | 0.27 |
| 0.00012933 | 0.27 |
| 0.00012936 | 0.27 |
| 0.00012939 | 0.27 |
| 0.00012942 | 0.27 |
| 0.00012946 | 0.27 |
| 0.00012949 | 0.274 |
| 0.00012952 | 0.27 |
| 0.00012955 | 0.27 |
| 0.00012958 | 0.27 |
| 0.00012962 | 0.27 |
| 0.00012965 | 0.27 |
| 0.00012968 | 0.27 |
| 0.00012971 | 0.274 |
| 0.00012974 | 0.274 |
| 0.00012978 | 0.274 |
| 0.00012981 | 0.274 |
| 0.00012984 | 0.27 |
| 0.00012987 | 0.27 |
| 0.0001299 | 0.274 |
| 0.00012994 | 0.274 |
| 0.00012997 | 0.27 |
| 0.00013 | 0.27 |
| 0.00013003 | 0.274 |
| 0.00013006 | 0.27 |
| 0.0001301 | 0.27 |
| 0.00013013 | 0.27 |
| 0.00013016 | 0.27 |
| 0.00013019 | 0.27 |
| 0.00013022 | 0.27 |
| 0.00013026 | 0.266 |
| 0.00013029 | 0.27 |
| 0.00013032 | 0.27 |
| 0.00013035 | 0.27 |
| 0.00013038 | 0.27 |
| 0.00013042 | 0.27 |
| 0.00013045 | 0.27 |
| 0.00013048 | 0.27 |
| 0.00013051 | 0.27 |
| 0.00013054 | 0.266 |
| 0.00013057999999999999 | 0.27 |
| 0.00013061 | 0.27 |
| 0.00013064 | 0.27 |
| 0.00013067 | 0.27 |
| 0.0001307 | 0.27 |
| 0.00013074 | 0.266 |
| 0.00013077 | 0.266 |
| 0.0001308 | 0.266 |
| 0.00013083 | 0.266 |
| 0.00013086 | 0.266 |
| 0.0001309 | 0.27 |
| 0.00013093 | 0.266 |
| 0.00013096 | 0.266 |
| 0.00013099 | 0.266 |
| 0.00013102 | 0.27 |
| 0.00013106 | 0.27 |
| 0.00013109 | 0.27 |
| 0.00013112 | 0.266 |
| 0.00013115 | 0.27 |
| 0.00013118 | 0.266 |
| 0.00013122 | 0.27 |
| 0.00013125 | 0.27 |
| 0.00013128 | 0.27 |
| 0.00013131 | 0.27 |
| 0.00013134 | 0.27 |
| 0.00013138 | 0.27 |
| 0.00013141 | 0.27 |
| 0.00013144 | 0.27 |
| 0.00013147 | 0.27 |
| 0.0001315 | 0.27 |
| 0.00013154 | 0.266 |
| 0.00013157 | 0.27 |
| 0.0001316 | 0.27 |
| 0.00013163 | 0.27 |
| 0.00013166 | 0.266 |
| 0.0001317 | 0.27 |
| 0.00013173 | 0.27 |
| 0.00013176 | 0.27 |
| 0.00013179 | 0.27 |
| 0.00013182 | 0.27 |
| 0.00013186 | 0.27 |
| 0.00013189 | 0.27 |
| 0.00013192 | 0.27 |
| 0.00013195 | 0.27 |
| 0.00013198 | 0.27 |
| 0.00013202 | 0.266 |
| 0.00013205 | 0.266 |
| 0.00013208 | 0.266 |
| 0.00013211 | 0.266 |
| 0.00013214 | 0.27 |
| 0.00013218 | 0.27 |
| 0.00013221 | 0.266 |
| 0.00013224 | 0.266 |
| 0.00013227 | 0.266 |
| 0.0001323 | 0.266 |
| 0.00013234 | 0.266 |
| 0.00013237 | 0.266 |
| 0.0001324 | 0.266 |
| 0.00013243 | 0.266 |
| 0.00013246 | 0.266 |
| 0.0001325 | 0.266 |
| 0.00013253 | 0.27 |
| 0.00013256 | 0.266 |
| 0.00013259 | 0.266 |
| 0.00013262 | 0.266 |
| 0.00013266 | 0.266 |
| 0.00013269 | 0.266 |
| 0.00013272 | 0.266 |
| 0.00013275 | 0.266 |
| 0.00013278 | 0.266 |
| 0.00013282 | 0.266 |
| 0.00013285 | 0.266 |
| 0.00013288 | 0.266 |
| 0.00013291 | 0.266 |
| 0.00013294 | 0.266 |
| 0.00013298 | 0.266 |
| 0.00013301 | 0.266 |
| 0.00013304 | 0.262 |
| 0.00013307 | 0.266 |
| 0.0001331 | 0.262 |
| 0.00013314 | 0.262 |
| 0.00013317 | 0.266 |
| 0.0001332 | 0.266 |
| 0.00013323 | 0.266 |
| 0.00013326 | 0.266 |
| 0.0001333 | 0.262 |
| 0.00013333 | 0.266 |
| 0.00013336 | 0.266 |
| 0.00013339 | 0.266 |
| 0.00013342 | 0.266 |
| 0.00013346 | 0.266 |
| 0.00013349 | 0.266 |
| 0.00013352 | 0.266 |
| 0.00013355 | 0.266 |
| 0.00013358 | 0.27 |
| 0.00013362 | 0.27 |
| 0.00013365 | 0.266 |
| 0.00013368 | 0.266 |
| 0.00013371 | 0.266 |
| 0.00013374 | 0.266 |
| 0.00013378 | 0.266 |
| 0.00013381 | 0.266 |
| 0.00013384 | 0.266 |
| 0.00013387 | 0.266 |
| 0.0001339 | 0.266 |
| 0.00013394 | 0.266 |
| 0.00013397 | 0.27 |
| 0.000134 | 0.266 |
| 0.00013403 | 0.266 |
| 0.00013406 | 0.266 |
| 0.0001341 | 0.266 |
| 0.00013413 | 0.27 |
| 0.00013416 | 0.27 |
| 0.00013419 | 0.27 |
| 0.00013422 | 0.27 |
| 0.00013426 | 0.27 |
| 0.00013429 | 0.274 |
| 0.00013432 | 0.274 |
| 0.00013435 | 0.278 |
| 0.00013438 | 0.274 |
| 0.00013442 | 0.278 |
| 0.00013445 | 0.278 |
| 0.00013448 | 0.278 |
| 0.00013451 | 0.278 |
| 0.00013454 | 0.274 |
| 0.00013458 | 0.278 |
| 0.00013461 | 0.278 |
| 0.00013464 | 0.278 |
| 0.00013467 | 0.282 |
| 0.0001347 | 0.282 |
| 0.00013474 | 0.282 |
| 0.00013477 | 0.282 |
| 0.0001348 | 0.278 |
| 0.00013483 | 0.282 |
| 0.00013486 | 0.282 |
| 0.0001349 | 0.278 |
| 0.00013493 | 0.282 |
| 0.00013496 | 0.282 |
| 0.00013499 | 0.282 |
| 0.00013502 | 0.278 |
| 0.00013506 | 0.278 |
| 0.00013509 | 0.278 |
| 0.00013512 | 0.278 |
| 0.00013515 | 0.278 |
| 0.00013518 | 0.278 |
| 0.00013522 | 0.278 |
| 0.00013525 | 0.278 |
| 0.00013528 | 0.278 |
| 0.00013531 | 0.278 |
| 0.00013534 | 0.278 |
| 0.00013538 | 0.278 |
| 0.00013541 | 0.278 |
| 0.00013544 | 0.278 |
| 0.00013547 | 0.278 |
| 0.0001355 | 0.278 |
| 0.00013554 | 0.278 |
| 0.00013557 | 0.274 |
| 0.0001356 | 0.274 |
| 0.00013563 | 0.278 |
| 0.00013566 | 0.274 |
| 0.0001357 | 0.274 |
| 0.00013573 | 0.274 |
| 0.00013576 | 0.274 |
| 0.00013579 | 0.274 |
| 0.00013582 | 0.274 |
| 0.00013586 | 0.274 |
| 0.00013589 | 0.274 |
| 0.00013592 | 0.274 |
| 0.00013595 | 0.274 |
| 0.00013598 | 0.274 |
| 0.00013602 | 0.274 |
| 0.00013605 | 0.27 |
| 0.00013608 | 0.27 |
| 0.00013611 | 0.274 |
| 0.00013614 | 0.274 |
| 0.00013618 | 0.274 |
| 0.00013621 | 0.274 |
| 0.00013624 | 0.274 |
| 0.00013627 | 0.27 |
| 0.0001363 | 0.27 |
| 0.00013634 | 0.274 |
| 0.00013637 | 0.274 |
| 0.0001364 | 0.274 |
| 0.00013643 | 0.274 |
| 0.00013646 | 0.274 |
| 0.0001365 | 0.274 |
| 0.00013653 | 0.274 |
| 0.00013656 | 0.274 |
| 0.00013659 | 0.274 |
| 0.00013662 | 0.278 |
| 0.00013666 | 0.274 |
| 0.00013669 | 0.278 |
| 0.00013672 | 0.278 |
| 0.00013675 | 0.278 |
| 0.00013678 | 0.274 |
| 0.00013682 | 0.274 |
| 0.00013685 | 0.274 |
| 0.00013688 | 0.278 |
| 0.00013691 | 0.278 |
| 0.00013694 | 0.278 |
| 0.00013698 | 0.278 |
| 0.00013701 | 0.278 |
| 0.00013704 | 0.282 |
| 0.00013707 | 0.278 |
| 0.0001371 | 0.278 |
| 0.00013714 | 0.278 |
| 0.00013717 | 0.278 |
| 0.0001372 | 0.282 |
| 0.00013723 | 0.282 |
| 0.00013726 | 0.282 |
| 0.0001373 | 0.282 |
| 0.00013733 | 0.282 |
| 0.00013736 | 0.282 |
| 0.00013739 | 0.282 |
| 0.00013742 | 0.282 |
| 0.00013746 | 0.282 |
| 0.00013749 | 0.282 |
| 0.00013752 | 0.282 |
| 0.00013755 | 0.282 |
| 0.00013758 | 0.282 |
| 0.00013762 | 0.286 |
| 0.00013765 | 0.282 |
| 0.00013768 | 0.282 |
| 0.00013771 | 0.282 |
| 0.00013774 | 0.282 |
| 0.00013778 | 0.282 |
| 0.00013781 | 0.282 |
| 0.00013784 | 0.286 |
| 0.00013787 | 0.282 |
| 0.0001379 | 0.282 |
| 0.00013794 | 0.282 |
| 0.00013797 | 0.282 |
| 0.000138 | 0.282 |
| 0.00013803 | 0.282 |
| 0.00013806 | 0.282 |
| 0.0001381 | 0.282 |
| 0.00013813 | 0.282 |
| 0.00013816 | 0.282 |
| 0.00013819 | 0.282 |
| 0.00013822 | 0.282 |
| 0.00013826 | 0.282 |
| 0.00013829 | 0.282 |
| 0.00013832 | 0.282 |
| 0.00013835 | 0.282 |
| 0.00013838 | 0.282 |
| 0.00013842 | 0.278 |
| 0.00013845 | 0.278 |
| 0.00013848 | 0.282 |
| 0.00013851 | 0.278 |
| 0.00013854 | 0.278 |
| 0.00013858 | 0.278 |
| 0.00013861 | 0.278 |
| 0.00013864 | 0.278 |
| 0.00013867 | 0.278 |
| 0.0001387 | 0.274 |
| 0.00013874 | 0.278 |
| 0.00013877 | 0.278 |
| 0.0001388 | 0.274 |
| 0.00013883 | 0.278 |
| 0.00013886 | 0.274 |
| 0.0001389 | 0.274 |
| 0.00013893 | 0.278 |
| 0.00013896 | 0.278 |
| 0.00013899 | 0.278 |
| 0.00013902 | 0.278 |
| 0.00013906 | 0.278 |
| 0.00013909 | 0.278 |
| 0.00013912 | 0.278 |
| 0.00013915 | 0.278 |
| 0.00013918 | 0.278 |
| 0.00013922 | 0.278 |
| 0.00013925 | 0.278 |
| 0.00013928 | 0.278 |
| 0.00013931 | 0.278 |
| 0.00013934 | 0.274 |
| 0.00013938 | 0.274 |
| 0.00013941 | 0.274 |
| 0.00013944 | 0.274 |
| 0.00013947 | 0.274 |
| 0.0001395 | 0.274 |
| 0.00013954 | 0.274 |
| 0.00013957 | 0.274 |
| 0.0001396 | 0.274 |
| 0.00013963 | 0.274 |
| 0.00013966 | 0.274 |
| 0.0001397 | 0.27 |
| 0.00013973 | 0.27 |
| 0.00013976 | 0.27 |
| 0.00013979 | 0.27 |
| 0.00013982 | 0.27 |
| 0.00013986 | 0.27 |
| 0.00013989 | 0.27 |
| 0.00013992 | 0.27 |
| 0.00013995 | 0.27 |
| 0.00013998 | 0.27 |
| 0.00014002 | 0.27 |
| 0.00014005 | 0.27 |
| 0.00014008 | 0.27 |
| 0.00014011 | 0.266 |
| 0.00014014 | 0.27 |
| 0.00014018 | 0.27 |
| 0.00014021 | 0.27 |
| 0.00014024 | 0.27 |
| 0.00014027 | 0.27 |
| 0.0001403 | 0.27 |
| 0.00014034 | 0.274 |
| 0.00014037 | 0.274 |
| 0.0001404 | 0.274 |
| 0.00014043 | 0.274 |
| 0.00014046 | 0.274 |
| 0.0001405 | 0.274 |
| 0.00014053 | 0.278 |
| 0.00014056 | 0.278 |
| 0.00014059 | 0.278 |
| 0.00014062 | 0.274 |
| 0.00014066 | 0.278 |
| 0.00014069 | 0.278 |
| 0.00014072 | 0.278 |
| 0.00014075 | 0.278 |
| 0.00014078 | 0.278 |
| 0.00014082 | 0.278 |
| 0.00014085 | 0.278 |
| 0.00014088 | 0.278 |
| 0.00014091 | 0.278 |
| 0.00014094 | 0.282 |
| 0.00014098 | 0.278 |
| 0.00014101 | 0.278 |
| 0.00014104 | 0.278 |
| 0.00014107 | 0.278 |
| 0.0001411 | 0.282 |
| 0.00014114 | 0.282 |
| 0.00014117 | 0.282 |
| 0.0001412 | 0.282 |
| 0.00014123 | 0.282 |
| 0.00014126 | 0.282 |
| 0.0001413 | 0.282 |
| 0.00014133 | 0.286 |
| 0.00014136 | 0.286 |
| 0.00014139 | 0.286 |
| 0.00014142 | 0.282 |
| 0.00014146 | 0.282 |
| 0.00014149 | 0.286 |
| 0.00014152 | 0.282 |
| 0.00014155 | 0.282 |
| 0.00014158 | 0.282 |
| 0.00014162 | 0.282 |
| 0.00014165 | 0.282 |
| 0.00014168 | 0.282 |
| 0.00014171 | 0.282 |
| 0.00014174 | 0.278 |
| 0.00014178 | 0.282 |
| 0.00014181 | 0.278 |
| 0.00014184 | 0.282 |
| 0.00014187 | 0.278 |
| 0.0001419 | 0.278 |
| 0.00014194 | 0.274 |
| 0.00014197 | 0.274 |
| 0.000142 | 0.274 |
| 0.00014203 | 0.274 |
| 0.00014206 | 0.274 |
| 0.0001421 | 0.274 |
| 0.00014213 | 0.27 |
| 0.00014216 | 0.274 |
| 0.00014219 | 0.27 |
| 0.00014222 | 0.27 |
| 0.00014226 | 0.27 |
| 0.00014229 | 0.27 |
| 0.00014232 | 0.27 |
| 0.00014235 | 0.27 |
| 0.00014238 | 0.27 |
| 0.00014242 | 0.27 |
| 0.00014245 | 0.27 |
| 0.00014248 | 0.27 |
| 0.00014251 | 0.27 |
| 0.00014254 | 0.27 |
| 0.00014258 | 0.27 |
| 0.00014261 | 0.27 |
| 0.00014264 | 0.27 |
| 0.00014267 | 0.27 |
| 0.0001427 | 0.274 |
| 0.00014274 | 0.274 |
| 0.00014277 | 0.274 |
| 0.0001428 | 0.27 |
| 0.00014283 | 0.27 |
| 0.00014286 | 0.27 |
| 0.0001429 | 0.27 |
| 0.00014293 | 0.27 |
| 0.00014296 | 0.274 |
| 0.00014299 | 0.27 |
| 0.00014302 | 0.274 |
| 0.00014306 | 0.274 |
| 0.00014309 | 0.274 |
| 0.00014312 | 0.274 |
| 0.00014315 | 0.274 |
| 0.00014318 | 0.274 |
| 0.00014322 | 0.274 |
| 0.00014325 | 0.274 |
| 0.00014328 | 0.274 |
| 0.00014331 | 0.274 |
| 0.00014334 | 0.278 |
| 0.00014338 | 0.274 |
| 0.00014341 | 0.274 |
| 0.00014344 | 0.274 |
| 0.00014347 | 0.278 |
| 0.0001435 | 0.278 |
| 0.00014354 | 0.278 |
| 0.00014357 | 0.278 |
| 0.0001436 | 0.274 |
| 0.00014363 | 0.278 |
| 0.00014366 | 0.278 |
| 0.0001437 | 0.278 |
| 0.00014373 | 0.278 |
| 0.00014376 | 0.282 |
| 0.00014379 | 0.282 |
| 0.00014382 | 0.278 |
| 0.00014386 | 0.282 |
| 0.00014389 | 0.282 |
| 0.00014392 | 0.282 |
| 0.00014395 | 0.286 |
| 0.00014398 | 0.286 |
| 0.00014402 | 0.282 |
| 0.00014405 | 0.286 |
| 0.00014408 | 0.286 |
| 0.00014411 | 0.286 |
| 0.00014414 | 0.286 |
| 0.00014418 | 0.286 |
| 0.00014421 | 0.286 |
| 0.00014424 | 0.286 |
| 0.00014427 | 0.29 |
| 0.0001443 | 0.286 |
| 0.00014434 | 0.29 |
| 0.00014437 | 0.286 |
| 0.0001444 | 0.286 |
| 0.00014443 | 0.286 |
| 0.00014446 | 0.286 |
| 0.0001445 | 0.286 |
| 0.00014453 | 0.286 |
| 0.00014456 | 0.286 |
| 0.00014459 | 0.286 |
| 0.00014462 | 0.286 |
| 0.00014466 | 0.286 |
| 0.00014469 | 0.282 |
| 0.00014472 | 0.286 |
| 0.00014475 | 0.282 |
| 0.00014478 | 0.286 |
| 0.00014482 | 0.282 |
| 0.00014485 | 0.282 |
| 0.00014488 | 0.282 |
| 0.00014491 | 0.286 |
| 0.00014494 | 0.282 |
| 0.00014498 | 0.282 |
| 0.00014501 | 0.282 |
| 0.00014504 | 0.282 |
| 0.00014507 | 0.278 |
| 0.0001451 | 0.282 |
| 0.00014514 | 0.278 |
| 0.00014517 | 0.282 |
| 0.0001452 | 0.278 |
| 0.00014523 | 0.278 |
| 0.00014526 | 0.278 |
| 0.0001453 | 0.278 |
| 0.00014533 | 0.278 |
| 0.00014536 | 0.278 |
| 0.00014539 | 0.278 |
| 0.00014542 | 0.278 |
| 0.00014546 | 0.274 |
| 0.00014549 | 0.278 |
| 0.00014552 | 0.274 |
| 0.00014555 | 0.278 |
| 0.00014558 | 0.274 |
| 0.00014562 | 0.274 |
| 0.00014565 | 0.274 |
| 0.00014568 | 0.27 |
| 0.00014571 | 0.274 |
| 0.00014574 | 0.27 |
| 0.00014578 | 0.27 |
| 0.00014581 | 0.27 |
| 0.00014584 | 0.27 |
| 0.00014587 | 0.27 |
| 0.0001459 | 0.27 |
| 0.00014594 | 0.266 |
| 0.00014597 | 0.27 |
| 0.000146 | 0.266 |
| 0.00014603 | 0.266 |
| 0.00014606 | 0.27 |
| 0.0001461 | 0.27 |
| 0.00014613 | 0.27 |
| 0.00014616 | 0.27 |
| 0.00014619 | 0.27 |
| 0.00014622 | 0.27 |
| 0.00014626 | 0.274 |
| 0.00014629 | 0.274 |
| 0.00014632 | 0.274 |
| 0.00014635 | 0.274 |
| 0.00014638 | 0.274 |
| 0.00014642 | 0.274 |
| 0.00014645 | 0.274 |
| 0.00014648 | 0.278 |
| 0.00014651 | 0.278 |
| 0.00014654 | 0.278 |
| 0.00014658 | 0.278 |
| 0.00014661 | 0.282 |
| 0.00014664 | 0.282 |
| 0.00014667 | 0.282 |
| 0.0001467 | 0.282 |
| 0.00014674 | 0.286 |
| 0.00014677 | 0.282 |
| 0.0001468 | 0.282 |
| 0.00014683 | 0.282 |
| 0.00014686 | 0.282 |
| 0.0001469 | 0.282 |
| 0.00014693 | 0.282 |
| 0.00014696 | 0.286 |
| 0.00014699 | 0.282 |
| 0.00014702 | 0.282 |
| 0.00014706 | 0.286 |
| 0.00014709 | 0.286 |
| 0.00014712 | 0.286 |
| 0.00014715 | 0.286 |
| 0.00014718 | 0.286 |
| 0.00014722 | 0.286 |
| 0.00014725 | 0.286 |
| 0.00014728 | 0.286 |
| 0.00014731 | 0.29 |
| 0.00014734 | 0.29 |
| 0.00014738 | 0.286 |
| 0.00014741 | 0.286 |
| 0.00014744 | 0.286 |
| 0.00014747 | 0.286 |
| 0.0001475 | 0.286 |
| 0.00014754 | 0.29 |
| 0.00014757 | 0.29 |
| 0.0001476 | 0.29 |
| 0.00014763 | 0.286 |
| 0.00014766 | 0.286 |
| 0.0001477 | 0.286 |
| 0.00014773 | 0.286 |
| 0.00014776 | 0.286 |
| 0.00014779 | 0.286 |
| 0.00014782 | 0.286 |
| 0.00014786 | 0.286 |
| 0.00014789 | 0.286 |
| 0.00014792 | 0.286 |
| 0.00014795 | 0.286 |
| 0.00014798 | 0.286 |
| 0.00014802 | 0.286 |
| 0.00014805 | 0.286 |
| 0.00014808 | 0.286 |
| 0.00014811 | 0.29 |
| 0.00014814 | 0.286 |
| 0.00014818 | 0.286 |
| 0.00014821 | 0.286 |
| 0.00014824 | 0.29 |
| 0.00014827 | 0.286 |
| 0.0001483 | 0.29 |
| 0.00014834 | 0.286 |
| 0.00014837 | 0.286 |
| 0.0001484 | 0.286 |
| 0.00014843 | 0.286 |
| 0.00014846 | 0.286 |
| 0.0001485 | 0.286 |
| 0.00014853 | 0.286 |
| 0.00014856 | 0.286 |
| 0.00014859 | 0.286 |
| 0.00014862 | 0.282 |
| 0.00014866 | 0.282 |
| 0.00014869 | 0.282 |
| 0.00014872 | 0.282 |
| 0.00014875 | 0.282 |
| 0.00014878 | 0.278 |
| 0.00014882 | 0.278 |
| 0.00014885 | 0.278 |
| 0.00014888 | 0.278 |
| 0.00014891 | 0.278 |
| 0.00014894 | 0.278 |
| 0.00014898 | 0.278 |
| 0.00014901 | 0.274 |
| 0.00014904 | 0.274 |
| 0.00014907 | 0.274 |
| 0.0001491 | 0.274 |
| 0.00014914 | 0.274 |
| 0.00014917 | 0.274 |
| 0.0001492 | 0.274 |
| 0.00014923 | 0.274 |
| 0.00014926 | 0.274 |
| 0.0001493 | 0.274 |
| 0.00014933 | 0.274 |
| 0.00014936 | 0.274 |
| 0.00014939 | 0.274 |
| 0.00014942 | 0.27 |
| 0.00014946 | 0.27 |
| 0.00014949 | 0.27 |
| 0.00014952 | 0.27 |
| 0.00014955 | 0.27 |
| 0.00014958 | 0.27 |
| 0.00014962 | 0.27 |
| 0.00014965 | 0.27 |
| 0.00014968 | 0.27 |
| 0.00014971 | 0.27 |
| 0.00014974 | 0.266 |
| 0.00014978 | 0.266 |
| 0.00014981 | 0.266 |
| 0.00014984 | 0.266 |
| 0.00014987 | 0.266 |
| 0.0001499 | 0.266 |
| 0.00014994 | 0.266 |
| 0.00014997 | 0.266 |
| 0.00015 | 0.266 |
| 0.00015003 | 0.266 |
| 0.00015006 | 0.266 |
| 0.0001501 | 0.266 |
| 0.00015013 | 0.266 |
| 0.00015016 | 0.266 |
| 0.00015019 | 0.266 |
| 0.00015022 | 0.266 |
| 0.00015026 | 0.266 |
| 0.00015029 | 0.266 |
| 0.00015032 | 0.27 |
| 0.00015035 | 0.266 |
| 0.00015038 | 0.27 |
| 0.00015042 | 0.27 |
| 0.00015045 | 0.27 |
| 0.00015048 | 0.27 |
| 0.00015051 | 0.27 |
| 0.00015054 | 0.27 |
| 0.00015058 | 0.27 |
| 0.00015061 | 0.27 |
| 0.00015064 | 0.27 |
| 0.00015067 | 0.27 |
| 0.0001507 | 0.27 |
| 0.00015074 | 0.27 |
| 0.00015077 | 0.274 |
| 0.0001508 | 0.27 |
| 0.00015083 | 0.27 |
| 0.00015086 | 0.27 |
| 0.0001509 | 0.27 |
| 0.00015093 | 0.27 |
| 0.00015096 | 0.274 |
| 0.00015099 | 0.27 |
| 0.00015102 | 0.27 |
| 0.00015106 | 0.27 |
| 0.00015109 | 0.274 |
| 0.00015112 | 0.274 |
| 0.00015115 | 0.274 |
| 0.00015118 | 0.274 |
| 0.00015122 | 0.274 |
| 0.00015125 | 0.274 |
| 0.00015128 | 0.274 |
| 0.00015131 | 0.274 |
| 0.00015134 | 0.274 |
| 0.00015138 | 0.274 |
| 0.00015141 | 0.274 |
| 0.00015144 | 0.274 |
| 0.00015147 | 0.274 |
| 0.0001515 | 0.278 |
| 0.00015154 | 0.274 |
| 0.00015157 | 0.274 |
| 0.0001516 | 0.274 |
| 0.00015163 | 0.274 |
| 0.00015166 | 0.274 |
| 0.0001517 | 0.274 |
| 0.00015173 | 0.274 |
| 0.00015176 | 0.274 |
| 0.00015179 | 0.274 |
| 0.00015182 | 0.274 |
| 0.00015186 | 0.274 |
| 0.00015189 | 0.274 |
| 0.00015192 | 0.274 |
| 0.00015195 | 0.274 |
| 0.00015198 | 0.27 |
| 0.00015202 | 0.274 |
| 0.00015205 | 0.274 |
| 0.00015208 | 0.274 |
| 0.00015211 | 0.27 |
| 0.00015214 | 0.274 |
| 0.00015218 | 0.27 |
| 0.00015221 | 0.27 |
| 0.00015224 | 0.27 |
| 0.00015227 | 0.27 |
| 0.0001523 | 0.27 |
| 0.00015234 | 0.27 |
| 0.00015237 | 0.27 |
| 0.0001524 | 0.27 |
| 0.00015243 | 0.27 |
| 0.00015246 | 0.27 |
| 0.0001525 | 0.27 |
| 0.00015253 | 0.27 |
| 0.00015256 | 0.27 |
| 0.00015259 | 0.27 |
| 0.00015262 | 0.27 |
| 0.00015266 | 0.27 |
| 0.00015269 | 0.27 |
| 0.00015272 | 0.266 |
| 0.00015275 | 0.266 |
| 0.00015278 | 0.266 |
| 0.00015282 | 0.266 |
| 0.00015285 | 0.262 |
| 0.00015288 | 0.266 |
| 0.00015291 | 0.266 |
| 0.00015294 | 0.266 |
| 0.00015298 | 0.266 |
| 0.00015301 | 0.266 |
| 0.00015304 | 0.262 |
| 0.00015307 | 0.262 |
| 0.0001531 | 0.266 |
| 0.00015314 | 0.262 |
| 0.00015317 | 0.262 |
| 0.0001532 | 0.262 |
| 0.00015323 | 0.262 |
| 0.00015326 | 0.262 |
| 0.0001533 | 0.262 |
| 0.00015333 | 0.262 |
| 0.00015336 | 0.262 |
| 0.00015339 | 0.262 |
| 0.00015342 | 0.262 |
| 0.00015346 | 0.262 |
| 0.00015349 | 0.262 |
| 0.00015352 | 0.262 |
| 0.00015355 | 0.258 |
| 0.00015358 | 0.258 |
| 0.00015362 | 0.262 |
| 0.00015365 | 0.258 |
| 0.00015368 | 0.262 |
| 0.00015371 | 0.262 |
| 0.00015374 | 0.258 |
| 0.00015378 | 0.258 |
| 0.00015381 | 0.258 |
| 0.00015384 | 0.258 |
| 0.00015387 | 0.258 |
| 0.0001539 | 0.258 |
| 0.00015394 | 0.262 |
| 0.00015397 | 0.258 |
| 0.000154 | 0.262 |
| 0.00015403 | 0.262 |
| 0.00015406 | 0.258 |
| 0.0001541 | 0.262 |
| 0.00015413 | 0.262 |
| 0.00015416 | 0.258 |
| 0.00015419 | 0.262 |
| 0.00015422 | 0.262 |
| 0.00015426 | 0.258 |
| 0.00015429 | 0.262 |
| 0.00015432 | 0.262 |
| 0.00015435 | 0.262 |
| 0.00015438 | 0.266 |
| 0.00015442 | 0.266 |
| 0.00015445 | 0.266 |
| 0.00015448 | 0.266 |
| 0.00015451 | 0.266 |
| 0.00015454 | 0.266 |
| 0.00015458 | 0.27 |
| 0.00015461 | 0.266 |
| 0.00015464 | 0.27 |
| 0.00015467 | 0.266 |
| 0.0001547 | 0.266 |
| 0.00015474 | 0.27 |
| 0.00015477 | 0.266 |
| 0.0001548 | 0.27 |
| 0.00015483 | 0.266 |
| 0.00015486 | 0.27 |
| 0.0001549 | 0.27 |
| 0.00015493 | 0.266 |
| 0.00015496 | 0.27 |
| 0.00015499 | 0.27 |
| 0.00015502 | 0.266 |
| 0.00015506 | 0.266 |
| 0.00015509 | 0.266 |
| 0.00015512 | 0.266 |
| 0.00015515 | 0.266 |
| 0.00015518 | 0.266 |
| 0.00015522 | 0.266 |
| 0.00015525 | 0.266 |
| 0.00015528 | 0.266 |
| 0.00015531 | 0.266 |
| 0.00015534 | 0.27 |
| 0.00015538 | 0.266 |
| 0.00015541 | 0.266 |
| 0.00015544 | 0.266 |
| 0.00015547 | 0.27 |
| 0.0001555 | 0.27 |
| 0.00015554 | 0.27 |
| 0.00015557 | 0.266 |
| 0.0001556 | 0.27 |
| 0.00015563 | 0.27 |
| 0.00015566 | 0.27 |
| 0.0001557 | 0.27 |
| 0.00015573 | 0.27 |
| 0.00015576 | 0.266 |
| 0.00015579 | 0.266 |
| 0.00015582 | 0.266 |
| 0.00015586 | 0.27 |
| 0.00015589 | 0.266 |
| 0.00015592 | 0.266 |
| 0.00015595 | 0.27 |
| 0.00015598 | 0.266 |
| 0.00015602 | 0.266 |
| 0.00015605 | 0.266 |
| 0.00015608 | 0.266 |
| 0.00015611 | 0.266 |
| 0.00015614 | 0.266 |
| 0.00015618 | 0.266 |
| 0.00015621 | 0.266 |
| 0.00015624 | 0.266 |
| 0.00015627 | 0.266 |
| 0.0001563 | 0.266 |
| 0.00015634 | 0.27 |
| 0.00015637 | 0.266 |
| 0.0001564 | 0.266 |
| 0.00015643 | 0.266 |
| 0.00015646 | 0.266 |
| 0.0001565 | 0.266 |
| 0.00015653 | 0.266 |
| 0.00015656 | 0.266 |
| 0.00015659 | 0.266 |
| 0.00015662 | 0.266 |
| 0.00015666 | 0.266 |
| 0.00015669 | 0.266 |
| 0.00015672 | 0.266 |
| 0.00015675 | 0.266 |
| 0.00015678 | 0.266 |
| 0.00015682 | 0.266 |
| 0.00015685 | 0.266 |
| 0.00015688 | 0.266 |
| 0.00015691 | 0.266 |
| 0.00015694 | 0.266 |
| 0.00015698 | 0.266 |
| 0.00015701 | 0.262 |
| 0.00015704 | 0.266 |
| 0.00015707 | 0.266 |
| 0.0001571 | 0.262 |
| 0.00015714 | 0.262 |
| 0.00015717 | 0.266 |
| 0.0001572 | 0.262 |
| 0.00015723 | 0.262 |
| 0.00015726 | 0.262 |
| 0.0001573 | 0.262 |
| 0.00015733 | 0.262 |
| 0.00015736 | 0.266 |
| 0.00015739 | 0.262 |
| 0.00015742 | 0.262 |
| 0.00015746 | 0.262 |
| 0.00015749 | 0.262 |
| 0.00015752 | 0.262 |
| 0.00015755 | 0.258 |
| 0.00015758 | 0.262 |
| 0.00015762 | 0.258 |
| 0.00015765 | 0.258 |
| 0.00015768 | 0.258 |
| 0.00015771 | 0.262 |
| 0.00015774 | 0.262 |
| 0.00015778 | 0.258 |
| 0.00015781 | 0.258 |
| 0.00015784 | 0.258 |
| 0.00015787 | 0.258 |
| 0.0001579 | 0.258 |
| 0.00015794 | 0.262 |
| 0.00015797 | 0.258 |
| 0.000158 | 0.258 |
| 0.00015803 | 0.258 |
| 0.00015806 | 0.258 |
| 0.0001581 | 0.258 |
| 0.00015813 | 0.258 |
| 0.00015816 | 0.262 |
| 0.00015819 | 0.258 |
| 0.00015822 | 0.258 |
| 0.00015826 | 0.258 |
| 0.00015829 | 0.258 |
| 0.00015832 | 0.258 |
| 0.00015835 | 0.258 |
| 0.00015838 | 0.258 |
| 0.00015842 | 0.258 |
| 0.00015845 | 0.258 |
| 0.00015848 | 0.258 |
| 0.00015851 | 0.258 |
| 0.00015854 | 0.258 |
| 0.00015858 | 0.258 |
| 0.00015861 | 0.258 |
| 0.00015864 | 0.258 |
| 0.00015867 | 0.262 |
| 0.0001587 | 0.258 |
| 0.00015874 | 0.258 |
| 0.00015877 | 0.258 |
| 0.0001588 | 0.258 |
| 0.00015883 | 0.262 |
| 0.00015886 | 0.262 |
| 0.0001589 | 0.258 |
| 0.00015893 | 0.262 |
| 0.00015896 | 0.266 |
| 0.00015899 | 0.262 |
| 0.00015902 | 0.262 |
| 0.00015906 | 0.262 |
| 0.00015909 | 0.262 |
| 0.00015912 | 0.266 |
| 0.00015915 | 0.262 |
| 0.00015918 | 0.266 |
| 0.00015922 | 0.262 |
| 0.00015925 | 0.266 |
| 0.00015928 | 0.266 |
| 0.00015931 | 0.262 |
| 0.00015934 | 0.262 |
| 0.00015938 | 0.262 |
| 0.00015941 | 0.262 |
| 0.00015944 | 0.262 |
| 0.00015947 | 0.262 |
| 0.0001595 | 0.262 |
| 0.00015954 | 0.258 |
| 0.00015957 | 0.258 |
| 0.0001596 | 0.258 |
| 0.00015963 | 0.258 |
| 0.00015966 | 0.258 |
| 0.0001597 | 0.258 |
| 0.00015973 | 0.258 |
| 0.00015976 | 0.254 |
| 0.00015979 | 0.254 |
| 0.00015982 | 0.258 |
| 0.00015986 | 0.254 |
| 0.00015989 | 0.254 |
| 0.00015992 | 0.254 |
| 0.00015995 | 0.254 |
| 0.00015998 | 0.254 |
| 0.00016002 | 0.254 |
| 0.00016005 | 0.254 |
| 0.00016008 | 0.254 |
| 0.00016011 | 0.254 |
| 0.00016014 | 0.254 |
| 0.00016018 | 0.25 |
| 0.00016021 | 0.25 |
| 0.00016024 | 0.254 |
| 0.00016027 | 0.25 |
| 0.0001603 | 0.25 |
| 0.00016034 | 0.25 |
| 0.00016037 | 0.25 |
| 0.0001604 | 0.25 |
| 0.00016043 | 0.25 |
| 0.00016046 | 0.25 |
| 0.0001605 | 0.25 |
| 0.00016053 | 0.25 |
| 0.00016056 | 0.25 |
| 0.00016059 | 0.246 |
| 0.00016062 | 0.25 |
| 0.00016066 | 0.25 |
| 0.00016069 | 0.25 |
| 0.00016072 | 0.25 |
| 0.00016075 | 0.25 |
| 0.00016078 | 0.25 |
| 0.00016082 | 0.25 |
| 0.00016085 | 0.246 |
| 0.00016088 | 0.246 |
| 0.00016091 | 0.25 |
| 0.00016094 | 0.246 |
| 0.00016098 | 0.246 |
| 0.00016101 | 0.25 |
| 0.00016104 | 0.246 |
| 0.00016107 | 0.25 |
| 0.0001611 | 0.25 |
| 0.00016114 | 0.25 |
| 0.00016117 | 0.246 |
| 0.0001612 | 0.246 |
| 0.00016123 | 0.25 |
| 0.00016126 | 0.25 |
| 0.0001613 | 0.246 |
| 0.00016133 | 0.25 |
| 0.00016136 | 0.25 |
| 0.00016139 | 0.246 |
| 0.00016142 | 0.25 |
| 0.00016146 | 0.25 |
| 0.00016149 | 0.246 |
| 0.00016152 | 0.246 |
| 0.00016155 | 0.25 |
| 0.00016158 | 0.254 |
| 0.00016162 | 0.25 |
| 0.00016165 | 0.25 |
| 0.00016168 | 0.254 |
| 0.00016171 | 0.254 |
| 0.00016174 | 0.254 |
| 0.00016178 | 0.254 |
| 0.00016181 | 0.254 |
| 0.00016184 | 0.254 |
| 0.00016187 | 0.254 |
| 0.0001619 | 0.254 |
| 0.00016194 | 0.254 |
| 0.00016197 | 0.254 |
| 0.000162 | 0.254 |
| 0.00016203 | 0.258 |
| 0.00016206 | 0.254 |
| 0.0001621 | 0.258 |
| 0.00016213 | 0.258 |
| 0.00016216 | 0.258 |
| 0.00016219 | 0.254 |
| 0.00016222 | 0.254 |
| 0.00016226 | 0.258 |
| 0.00016229 | 0.258 |
| 0.00016232 | 0.258 |
| 0.00016235 | 0.258 |
| 0.00016238 | 0.258 |
| 0.00016242 | 0.258 |
| 0.00016245 | 0.258 |
| 0.00016248 | 0.258 |
| 0.00016251 | 0.258 |
| 0.00016254 | 0.258 |
| 0.00016258 | 0.258 |
| 0.00016261 | 0.258 |
| 0.00016264 | 0.258 |
| 0.00016267 | 0.258 |
| 0.0001627 | 0.258 |
| 0.00016274 | 0.258 |
| 0.00016277 | 0.258 |
| 0.0001628 | 0.258 |
| 0.00016283 | 0.258 |
| 0.00016286 | 0.258 |
| 0.0001629 | 0.258 |
| 0.00016293 | 0.258 |
| 0.00016296 | 0.258 |
| 0.00016299 | 0.258 |
| 0.00016302 | 0.258 |
| 0.00016306 | 0.258 |
| 0.00016309 | 0.258 |
| 0.00016312 | 0.254 |
| 0.00016315 | 0.254 |
| 0.00016318 | 0.254 |
| 0.00016322 | 0.254 |
| 0.00016325 | 0.254 |
| 0.00016328 | 0.254 |
| 0.00016331 | 0.254 |
| 0.00016334 | 0.254 |
| 0.00016338 | 0.254 |
| 0.00016341 | 0.254 |
| 0.00016344 | 0.254 |
| 0.00016347 | 0.254 |
| 0.0001635 | 0.254 |
| 0.00016354 | 0.25 |
| 0.00016357 | 0.254 |
| 0.0001636 | 0.25 |
| 0.00016363 | 0.25 |
| 0.00016366 | 0.25 |
| 0.0001637 | 0.25 |
| 0.00016373 | 0.25 |
| 0.00016376 | 0.25 |
| 0.00016379 | 0.246 |
| 0.00016382 | 0.25 |
| 0.00016386 | 0.25 |
| 0.00016389 | 0.25 |
| 0.00016392 | 0.246 |
| 0.00016395 | 0.246 |
| 0.00016398 | 0.25 |
| 0.00016402 | 0.246 |
| 0.00016405 | 0.25 |
| 0.00016408 | 0.25 |
| 0.00016411 | 0.25 |
| 0.00016414 | 0.25 |
| 0.00016418 | 0.25 |
| 0.00016421 | 0.25 |
| 0.00016424 | 0.25 |
| 0.00016427 | 0.25 |
| 0.0001643 | 0.25 |
| 0.00016434 | 0.25 |
| 0.00016437 | 0.25 |
| 0.0001644 | 0.25 |
| 0.00016443 | 0.25 |
| 0.00016446 | 0.25 |
| 0.0001645 | 0.246 |
| 0.00016453 | 0.25 |
| 0.00016456 | 0.254 |
| 0.00016459 | 0.246 |
| 0.00016462 | 0.25 |
| 0.00016466 | 0.25 |
| 0.00016469 | 0.25 |
| 0.00016472 | 0.25 |
| 0.00016475 | 0.25 |
| 0.00016478 | 0.254 |
| 0.00016482 | 0.25 |
| 0.00016485 | 0.254 |
| 0.00016488 | 0.254 |
| 0.00016491 | 0.25 |
| 0.00016494 | 0.254 |
| 0.00016498 | 0.254 |
| 0.00016501 | 0.254 |
| 0.00016504 | 0.254 |
| 0.00016507 | 0.254 |
| 0.0001651 | 0.254 |
| 0.00016514 | 0.254 |
| 0.00016517 | 0.254 |
| 0.0001652 | 0.254 |
| 0.00016523 | 0.254 |
| 0.00016526 | 0.254 |
| 0.0001653 | 0.254 |
| 0.00016533 | 0.254 |
| 0.00016536 | 0.254 |
| 0.00016539 | 0.254 |
| 0.00016542 | 0.254 |
| 0.00016546 | 0.254 |
| 0.00016549 | 0.254 |
| 0.00016552 | 0.254 |
| 0.00016555 | 0.254 |
| 0.00016558 | 0.254 |
| 0.00016562 | 0.254 |
| 0.00016565 | 0.254 |
| 0.00016568 | 0.25 |
| 0.00016571 | 0.25 |
| 0.00016574 | 0.25 |
| 0.00016578 | 0.254 |
| 0.00016581 | 0.25 |
| 0.00016584 | 0.25 |
| 0.00016587 | 0.25 |
| 0.0001659 | 0.25 |
| 0.00016594 | 0.25 |
| 0.00016597 | 0.25 |
| 0.000166 | 0.25 |
| 0.00016603 | 0.25 |
| 0.00016606 | 0.25 |
| 0.0001661 | 0.25 |
| 0.00016613 | 0.25 |
| 0.00016616 | 0.25 |
| 0.00016619 | 0.25 |
| 0.00016622 | 0.25 |
| 0.00016626 | 0.25 |
| 0.00016629 | 0.25 |
| 0.00016632 | 0.25 |
| 0.00016635 | 0.25 |
| 0.00016638 | 0.25 |
| 0.00016642 | 0.246 |
| 0.00016645 | 0.246 |
| 0.00016648 | 0.246 |
| 0.00016651 | 0.246 |
| 0.00016654 | 0.25 |
| 0.00016658 | 0.246 |
| 0.00016661 | 0.246 |
| 0.00016664 | 0.25 |
| 0.00016667 | 0.246 |
| 0.0001667 | 0.242 |
| 0.00016674 | 0.246 |
| 0.00016677 | 0.246 |
| 0.0001668 | 0.246 |
| 0.00016683 | 0.246 |
| 0.00016686 | 0.246 |
| 0.0001669 | 0.246 |
| 0.00016693 | 0.246 |
| 0.00016696 | 0.246 |
| 0.00016699 | 0.246 |
| 0.00016702 | 0.246 |
| 0.00016706 | 0.246 |
| 0.00016709 | 0.246 |
| 0.00016712 | 0.246 |
| 0.00016715 | 0.242 |
| 0.00016718 | 0.242 |
| 0.00016722 | 0.246 |
| 0.00016725 | 0.246 |
| 0.00016728 | 0.242 |
| 0.00016731 | 0.242 |
| 0.00016734 | 0.246 |
| 0.00016738 | 0.246 |
| 0.00016741 | 0.246 |
| 0.00016744 | 0.246 |
| 0.00016747 | 0.246 |
| 0.0001675 | 0.246 |
| 0.00016754 | 0.246 |
| 0.00016757 | 0.246 |
| 0.0001676 | 0.246 |
| 0.00016763 | 0.25 |
| 0.00016766 | 0.246 |
| 0.0001677 | 0.246 |
| 0.00016773 | 0.246 |
| 0.00016776 | 0.246 |
| 0.00016779 | 0.25 |
| 0.00016782 | 0.25 |
| 0.00016786 | 0.25 |
| 0.00016789 | 0.25 |
| 0.00016792 | 0.25 |
| 0.00016795 | 0.25 |
| 0.00016798 | 0.25 |
| 0.00016802 | 0.25 |
| 0.00016805 | 0.25 |
| 0.00016808 | 0.25 |
| 0.00016811 | 0.246 |
| 0.00016814 | 0.25 |
| 0.00016818 | 0.25 |
| 0.00016821 | 0.25 |
| 0.00016824 | 0.25 |
| 0.00016827 | 0.25 |
| 0.0001683 | 0.25 |
| 0.00016834 | 0.25 |
| 0.00016837 | 0.25 |
| 0.0001684 | 0.25 |
| 0.00016843 | 0.25 |
| 0.00016846 | 0.25 |
| 0.0001685 | 0.25 |
| 0.00016853 | 0.25 |
| 0.00016856 | 0.254 |
| 0.00016859 | 0.25 |
| 0.00016862 | 0.25 |
| 0.00016866 | 0.25 |
| 0.00016869 | 0.25 |
| 0.00016872 | 0.25 |
| 0.00016875 | 0.25 |
| 0.00016878 | 0.25 |
| 0.00016882 | 0.25 |
| 0.00016885 | 0.246 |
| 0.00016888 | 0.246 |
| 0.00016891 | 0.246 |
| 0.00016894 | 0.246 |
| 0.00016898 | 0.246 |
| 0.00016901 | 0.246 |
| 0.00016904 | 0.246 |
| 0.00016907 | 0.246 |
| 0.0001691 | 0.246 |
| 0.00016914 | 0.246 |
| 0.00016917 | 0.242 |
| 0.0001692 | 0.242 |
| 0.00016923 | 0.246 |
| 0.00016926 | 0.246 |
| 0.0001693 | 0.242 |
| 0.00016933 | 0.242 |
| 0.00016936 | 0.242 |
| 0.00016939 | 0.242 |
| 0.00016942 | 0.242 |
| 0.00016946 | 0.242 |
| 0.00016949 | 0.242 |
| 0.00016952 | 0.242 |
| 0.00016955 | 0.242 |
| 0.00016958 | 0.238 |
| 0.00016962 | 0.238 |
| 0.00016965 | 0.242 |
| 0.00016968 | 0.242 |
| 0.00016971 | 0.242 |
| 0.00016974 | 0.238 |
| 0.00016978 | 0.238 |
| 0.00016981 | 0.238 |
| 0.00016984 | 0.238 |
| 0.00016987 | 0.234 |
| 0.0001699 | 0.234 |
| 0.00016994 | 0.234 |
| 0.00016997 | 0.234 |
| 0.00017 | 0.234 |
| 0.00017003 | 0.234 |
| 0.00017006 | 0.238 |
| 0.0001701 | 0.238 |
| 0.00017013 | 0.238 |
| 0.00017016 | 0.234 |
| 0.00017019 | 0.238 |
| 0.00017022 | 0.238 |
| 0.00017026 | 0.234 |
| 0.00017029 | 0.238 |
| 0.00017032 | 0.238 |
| 0.00017035 | 0.238 |
| 0.00017038 | 0.242 |
| 0.00017042 | 0.242 |
| 0.00017045 | 0.242 |
| 0.00017048 | 0.242 |
| 0.00017051 | 0.242 |
| 0.00017054 | 0.242 |
| 0.00017058 | 0.242 |
| 0.00017061 | 0.242 |
| 0.00017064 | 0.242 |
| 0.00017067 | 0.242 |
| 0.0001707 | 0.242 |
| 0.00017074 | 0.242 |